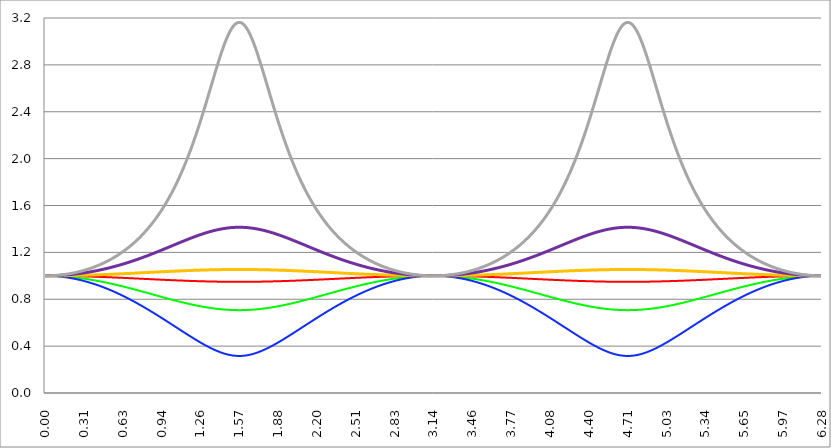
| Category | Series 1 | Series 0 | Series 2 | Series 3 | Series 4 | Series 5 |
|---|---|---|---|---|---|---|
| 0.0 | 1 | 1 | 1 | 1 | 1 | 1 |
| 0.00314159265358979 | 1 | 1 | 1 | 1 | 1 | 1 |
| 0.00628318530717958 | 1 | 1 | 1 | 1 | 1 | 1 |
| 0.00942477796076938 | 1 | 1 | 1 | 1 | 1 | 1 |
| 0.0125663706143592 | 1 | 1 | 1 | 1 | 1 | 1 |
| 0.015707963267949 | 1 | 1 | 1 | 1 | 1 | 1 |
| 0.0188495559215388 | 1 | 1 | 1 | 1 | 1 | 1 |
| 0.0219911485751285 | 1 | 1 | 1 | 1 | 1 | 1 |
| 0.0251327412287183 | 1 | 1 | 1 | 1 | 1 | 1 |
| 0.0282743338823081 | 1 | 1 | 1 | 1 | 1 | 1 |
| 0.0314159265358979 | 1 | 1 | 1 | 1 | 1 | 1 |
| 0.0345575191894877 | 1 | 1 | 0.999 | 1 | 1 | 1.001 |
| 0.0376991118430775 | 1 | 1 | 0.999 | 1 | 1 | 1.001 |
| 0.0408407044966673 | 1 | 1 | 0.999 | 1 | 1 | 1.001 |
| 0.0439822971502571 | 1 | 1 | 0.999 | 1 | 1 | 1.001 |
| 0.0471238898038469 | 1 | 0.999 | 0.999 | 1 | 1.001 | 1.001 |
| 0.0502654824574367 | 1 | 0.999 | 0.999 | 1 | 1.001 | 1.001 |
| 0.0534070751110265 | 1 | 0.999 | 0.999 | 1 | 1.001 | 1.001 |
| 0.0565486677646163 | 1 | 0.999 | 0.999 | 1 | 1.001 | 1.001 |
| 0.059690260418206 | 1 | 0.999 | 0.998 | 1 | 1.001 | 1.002 |
| 0.0628318530717958 | 1 | 0.999 | 0.998 | 1 | 1.001 | 1.002 |
| 0.0659734457253856 | 1 | 0.999 | 0.998 | 1 | 1.001 | 1.002 |
| 0.0691150383789754 | 1 | 0.999 | 0.998 | 1 | 1.001 | 1.002 |
| 0.0722566310325652 | 1 | 0.999 | 0.998 | 1 | 1.001 | 1.002 |
| 0.075398223686155 | 1 | 0.999 | 0.997 | 1 | 1.001 | 1.003 |
| 0.0785398163397448 | 1 | 0.998 | 0.997 | 1 | 1.002 | 1.003 |
| 0.0816814089933346 | 1 | 0.998 | 0.997 | 1 | 1.002 | 1.003 |
| 0.0848230016469244 | 1 | 0.998 | 0.997 | 1 | 1.002 | 1.003 |
| 0.0879645943005142 | 1 | 0.998 | 0.997 | 1 | 1.002 | 1.003 |
| 0.091106186954104 | 1 | 0.998 | 0.996 | 1 | 1.002 | 1.004 |
| 0.0942477796076937 | 1 | 0.998 | 0.996 | 1 | 1.002 | 1.004 |
| 0.0973893722612835 | 1 | 0.998 | 0.996 | 1 | 1.002 | 1.004 |
| 0.100530964914873 | 0.999 | 0.997 | 0.995 | 1.001 | 1.003 | 1.005 |
| 0.103672557568463 | 0.999 | 0.997 | 0.995 | 1.001 | 1.003 | 1.005 |
| 0.106814150222053 | 0.999 | 0.997 | 0.995 | 1.001 | 1.003 | 1.005 |
| 0.109955742875643 | 0.999 | 0.997 | 0.995 | 1.001 | 1.003 | 1.005 |
| 0.113097335529233 | 0.999 | 0.997 | 0.994 | 1.001 | 1.003 | 1.006 |
| 0.116238928182822 | 0.999 | 0.997 | 0.994 | 1.001 | 1.003 | 1.006 |
| 0.119380520836412 | 0.999 | 0.996 | 0.994 | 1.001 | 1.004 | 1.006 |
| 0.122522113490002 | 0.999 | 0.996 | 0.993 | 1.001 | 1.004 | 1.007 |
| 0.125663706143592 | 0.999 | 0.996 | 0.993 | 1.001 | 1.004 | 1.007 |
| 0.128805298797181 | 0.999 | 0.996 | 0.993 | 1.001 | 1.004 | 1.008 |
| 0.131946891450771 | 0.999 | 0.996 | 0.992 | 1.001 | 1.004 | 1.008 |
| 0.135088484104361 | 0.999 | 0.995 | 0.992 | 1.001 | 1.005 | 1.008 |
| 0.138230076757951 | 0.999 | 0.995 | 0.991 | 1.001 | 1.005 | 1.009 |
| 0.141371669411541 | 0.999 | 0.995 | 0.991 | 1.001 | 1.005 | 1.009 |
| 0.14451326206513 | 0.999 | 0.995 | 0.991 | 1.001 | 1.005 | 1.009 |
| 0.14765485471872 | 0.999 | 0.995 | 0.99 | 1.001 | 1.005 | 1.01 |
| 0.15079644737231 | 0.999 | 0.994 | 0.99 | 1.001 | 1.006 | 1.01 |
| 0.1539380400259 | 0.999 | 0.994 | 0.989 | 1.001 | 1.006 | 1.011 |
| 0.15707963267949 | 0.999 | 0.994 | 0.989 | 1.001 | 1.006 | 1.011 |
| 0.160221225333079 | 0.999 | 0.994 | 0.988 | 1.001 | 1.006 | 1.012 |
| 0.163362817986669 | 0.999 | 0.993 | 0.988 | 1.001 | 1.007 | 1.012 |
| 0.166504410640259 | 0.999 | 0.993 | 0.988 | 1.001 | 1.007 | 1.013 |
| 0.169646003293849 | 0.999 | 0.993 | 0.987 | 1.001 | 1.007 | 1.013 |
| 0.172787595947439 | 0.999 | 0.993 | 0.987 | 1.001 | 1.007 | 1.014 |
| 0.175929188601028 | 0.998 | 0.992 | 0.986 | 1.002 | 1.008 | 1.014 |
| 0.179070781254618 | 0.998 | 0.992 | 0.986 | 1.002 | 1.008 | 1.015 |
| 0.182212373908208 | 0.998 | 0.992 | 0.985 | 1.002 | 1.008 | 1.015 |
| 0.185353966561798 | 0.998 | 0.991 | 0.985 | 1.002 | 1.009 | 1.016 |
| 0.188495559215388 | 0.998 | 0.991 | 0.984 | 1.002 | 1.009 | 1.016 |
| 0.191637151868977 | 0.998 | 0.991 | 0.984 | 1.002 | 1.009 | 1.017 |
| 0.194778744522567 | 0.998 | 0.991 | 0.983 | 1.002 | 1.009 | 1.017 |
| 0.197920337176157 | 0.998 | 0.99 | 0.982 | 1.002 | 1.01 | 1.018 |
| 0.201061929829747 | 0.998 | 0.99 | 0.982 | 1.002 | 1.01 | 1.018 |
| 0.204203522483336 | 0.998 | 0.99 | 0.981 | 1.002 | 1.01 | 1.019 |
| 0.207345115136926 | 0.998 | 0.989 | 0.981 | 1.002 | 1.011 | 1.02 |
| 0.210486707790516 | 0.998 | 0.989 | 0.98 | 1.002 | 1.011 | 1.02 |
| 0.213628300444106 | 0.998 | 0.989 | 0.98 | 1.002 | 1.011 | 1.021 |
| 0.216769893097696 | 0.998 | 0.988 | 0.979 | 1.002 | 1.012 | 1.021 |
| 0.219911485751285 | 0.998 | 0.988 | 0.978 | 1.002 | 1.012 | 1.022 |
| 0.223053078404875 | 0.998 | 0.988 | 0.978 | 1.002 | 1.012 | 1.023 |
| 0.226194671058465 | 0.997 | 0.987 | 0.977 | 1.003 | 1.013 | 1.023 |
| 0.229336263712055 | 0.997 | 0.987 | 0.976 | 1.003 | 1.013 | 1.024 |
| 0.232477856365645 | 0.997 | 0.987 | 0.976 | 1.003 | 1.014 | 1.025 |
| 0.235619449019234 | 0.997 | 0.986 | 0.975 | 1.003 | 1.014 | 1.025 |
| 0.238761041672824 | 0.997 | 0.986 | 0.975 | 1.003 | 1.014 | 1.026 |
| 0.241902634326414 | 0.997 | 0.986 | 0.974 | 1.003 | 1.015 | 1.027 |
| 0.245044226980004 | 0.997 | 0.985 | 0.973 | 1.003 | 1.015 | 1.028 |
| 0.248185819633594 | 0.997 | 0.985 | 0.972 | 1.003 | 1.015 | 1.028 |
| 0.251327412287183 | 0.997 | 0.984 | 0.972 | 1.003 | 1.016 | 1.029 |
| 0.254469004940773 | 0.997 | 0.984 | 0.971 | 1.003 | 1.016 | 1.03 |
| 0.257610597594363 | 0.997 | 0.984 | 0.97 | 1.003 | 1.017 | 1.031 |
| 0.260752190247953 | 0.997 | 0.983 | 0.97 | 1.003 | 1.017 | 1.031 |
| 0.263893782901543 | 0.997 | 0.983 | 0.969 | 1.003 | 1.017 | 1.032 |
| 0.267035375555132 | 0.997 | 0.982 | 0.968 | 1.003 | 1.018 | 1.033 |
| 0.270176968208722 | 0.996 | 0.982 | 0.967 | 1.004 | 1.018 | 1.034 |
| 0.273318560862312 | 0.996 | 0.982 | 0.967 | 1.004 | 1.019 | 1.034 |
| 0.276460153515902 | 0.996 | 0.981 | 0.966 | 1.004 | 1.019 | 1.035 |
| 0.279601746169492 | 0.996 | 0.981 | 0.965 | 1.004 | 1.02 | 1.036 |
| 0.282743338823082 | 0.996 | 0.98 | 0.964 | 1.004 | 1.02 | 1.037 |
| 0.285884931476671 | 0.996 | 0.98 | 0.964 | 1.004 | 1.02 | 1.038 |
| 0.289026524130261 | 0.996 | 0.979 | 0.963 | 1.004 | 1.021 | 1.039 |
| 0.292168116783851 | 0.996 | 0.979 | 0.962 | 1.004 | 1.021 | 1.04 |
| 0.295309709437441 | 0.996 | 0.979 | 0.961 | 1.004 | 1.022 | 1.04 |
| 0.298451302091031 | 0.996 | 0.978 | 0.96 | 1.004 | 1.022 | 1.041 |
| 0.30159289474462 | 0.996 | 0.978 | 0.959 | 1.004 | 1.023 | 1.042 |
| 0.30473448739821 | 0.995 | 0.977 | 0.959 | 1.005 | 1.023 | 1.043 |
| 0.3078760800518 | 0.995 | 0.977 | 0.958 | 1.005 | 1.024 | 1.044 |
| 0.31101767270539 | 0.995 | 0.976 | 0.957 | 1.005 | 1.024 | 1.045 |
| 0.31415926535898 | 0.995 | 0.976 | 0.956 | 1.005 | 1.025 | 1.046 |
| 0.31730085801257 | 0.995 | 0.975 | 0.955 | 1.005 | 1.025 | 1.047 |
| 0.320442450666159 | 0.995 | 0.975 | 0.954 | 1.005 | 1.026 | 1.048 |
| 0.323584043319749 | 0.995 | 0.974 | 0.953 | 1.005 | 1.026 | 1.049 |
| 0.326725635973339 | 0.995 | 0.974 | 0.953 | 1.005 | 1.027 | 1.05 |
| 0.329867228626929 | 0.995 | 0.973 | 0.952 | 1.005 | 1.027 | 1.051 |
| 0.333008821280519 | 0.995 | 0.973 | 0.951 | 1.005 | 1.028 | 1.052 |
| 0.336150413934108 | 0.995 | 0.972 | 0.95 | 1.005 | 1.028 | 1.053 |
| 0.339292006587698 | 0.994 | 0.972 | 0.949 | 1.006 | 1.029 | 1.054 |
| 0.342433599241288 | 0.994 | 0.971 | 0.948 | 1.006 | 1.029 | 1.055 |
| 0.345575191894878 | 0.994 | 0.971 | 0.947 | 1.006 | 1.03 | 1.056 |
| 0.348716784548468 | 0.994 | 0.97 | 0.946 | 1.006 | 1.031 | 1.057 |
| 0.351858377202058 | 0.994 | 0.97 | 0.945 | 1.006 | 1.031 | 1.058 |
| 0.354999969855647 | 0.994 | 0.969 | 0.944 | 1.006 | 1.032 | 1.059 |
| 0.358141562509237 | 0.994 | 0.969 | 0.943 | 1.006 | 1.032 | 1.06 |
| 0.361283155162827 | 0.994 | 0.968 | 0.942 | 1.006 | 1.033 | 1.061 |
| 0.364424747816417 | 0.994 | 0.968 | 0.941 | 1.006 | 1.033 | 1.063 |
| 0.367566340470007 | 0.994 | 0.967 | 0.94 | 1.007 | 1.034 | 1.064 |
| 0.370707933123597 | 0.993 | 0.967 | 0.939 | 1.007 | 1.035 | 1.065 |
| 0.373849525777186 | 0.993 | 0.966 | 0.938 | 1.007 | 1.035 | 1.066 |
| 0.376991118430776 | 0.993 | 0.966 | 0.937 | 1.007 | 1.036 | 1.067 |
| 0.380132711084366 | 0.993 | 0.965 | 0.936 | 1.007 | 1.036 | 1.068 |
| 0.383274303737956 | 0.993 | 0.964 | 0.935 | 1.007 | 1.037 | 1.07 |
| 0.386415896391546 | 0.993 | 0.964 | 0.934 | 1.007 | 1.038 | 1.071 |
| 0.389557489045135 | 0.993 | 0.963 | 0.933 | 1.007 | 1.038 | 1.072 |
| 0.392699081698725 | 0.993 | 0.963 | 0.932 | 1.007 | 1.039 | 1.073 |
| 0.395840674352315 | 0.993 | 0.962 | 0.931 | 1.008 | 1.039 | 1.074 |
| 0.398982267005905 | 0.992 | 0.962 | 0.93 | 1.008 | 1.04 | 1.076 |
| 0.402123859659495 | 0.992 | 0.961 | 0.929 | 1.008 | 1.041 | 1.077 |
| 0.405265452313085 | 0.992 | 0.96 | 0.927 | 1.008 | 1.041 | 1.078 |
| 0.408407044966674 | 0.992 | 0.96 | 0.926 | 1.008 | 1.042 | 1.08 |
| 0.411548637620264 | 0.992 | 0.959 | 0.925 | 1.008 | 1.043 | 1.081 |
| 0.414690230273854 | 0.992 | 0.959 | 0.924 | 1.008 | 1.043 | 1.082 |
| 0.417831822927444 | 0.992 | 0.958 | 0.923 | 1.008 | 1.044 | 1.084 |
| 0.420973415581034 | 0.992 | 0.957 | 0.922 | 1.008 | 1.045 | 1.085 |
| 0.424115008234623 | 0.991 | 0.957 | 0.921 | 1.009 | 1.045 | 1.086 |
| 0.427256600888213 | 0.991 | 0.956 | 0.919 | 1.009 | 1.046 | 1.088 |
| 0.430398193541803 | 0.991 | 0.955 | 0.918 | 1.009 | 1.047 | 1.089 |
| 0.433539786195393 | 0.991 | 0.955 | 0.917 | 1.009 | 1.047 | 1.09 |
| 0.436681378848983 | 0.991 | 0.954 | 0.916 | 1.009 | 1.048 | 1.092 |
| 0.439822971502573 | 0.991 | 0.954 | 0.915 | 1.009 | 1.049 | 1.093 |
| 0.442964564156162 | 0.991 | 0.953 | 0.914 | 1.009 | 1.049 | 1.095 |
| 0.446106156809752 | 0.991 | 0.952 | 0.912 | 1.009 | 1.05 | 1.096 |
| 0.449247749463342 | 0.991 | 0.952 | 0.911 | 1.01 | 1.051 | 1.097 |
| 0.452389342116932 | 0.99 | 0.951 | 0.91 | 1.01 | 1.051 | 1.099 |
| 0.455530934770522 | 0.99 | 0.95 | 0.909 | 1.01 | 1.052 | 1.1 |
| 0.458672527424111 | 0.99 | 0.95 | 0.908 | 1.01 | 1.053 | 1.102 |
| 0.461814120077701 | 0.99 | 0.949 | 0.906 | 1.01 | 1.054 | 1.103 |
| 0.464955712731291 | 0.99 | 0.948 | 0.905 | 1.01 | 1.054 | 1.105 |
| 0.468097305384881 | 0.99 | 0.948 | 0.904 | 1.01 | 1.055 | 1.106 |
| 0.471238898038471 | 0.99 | 0.947 | 0.902 | 1.01 | 1.056 | 1.108 |
| 0.474380490692061 | 0.99 | 0.946 | 0.901 | 1.011 | 1.057 | 1.11 |
| 0.47752208334565 | 0.989 | 0.946 | 0.9 | 1.011 | 1.057 | 1.111 |
| 0.48066367599924 | 0.989 | 0.945 | 0.899 | 1.011 | 1.058 | 1.113 |
| 0.48380526865283 | 0.989 | 0.944 | 0.897 | 1.011 | 1.059 | 1.114 |
| 0.48694686130642 | 0.989 | 0.944 | 0.896 | 1.011 | 1.06 | 1.116 |
| 0.49008845396001 | 0.989 | 0.943 | 0.895 | 1.011 | 1.06 | 1.118 |
| 0.493230046613599 | 0.989 | 0.942 | 0.893 | 1.011 | 1.061 | 1.119 |
| 0.496371639267189 | 0.989 | 0.942 | 0.892 | 1.012 | 1.062 | 1.121 |
| 0.499513231920779 | 0.988 | 0.941 | 0.891 | 1.012 | 1.063 | 1.123 |
| 0.502654824574369 | 0.988 | 0.94 | 0.889 | 1.012 | 1.064 | 1.124 |
| 0.505796417227959 | 0.988 | 0.939 | 0.888 | 1.012 | 1.064 | 1.126 |
| 0.508938009881549 | 0.988 | 0.939 | 0.887 | 1.012 | 1.065 | 1.128 |
| 0.512079602535138 | 0.988 | 0.938 | 0.885 | 1.012 | 1.066 | 1.129 |
| 0.515221195188728 | 0.988 | 0.937 | 0.884 | 1.012 | 1.067 | 1.131 |
| 0.518362787842318 | 0.988 | 0.937 | 0.883 | 1.013 | 1.068 | 1.133 |
| 0.521504380495908 | 0.988 | 0.936 | 0.881 | 1.013 | 1.068 | 1.135 |
| 0.524645973149498 | 0.987 | 0.935 | 0.88 | 1.013 | 1.069 | 1.137 |
| 0.527787565803087 | 0.987 | 0.934 | 0.878 | 1.013 | 1.07 | 1.138 |
| 0.530929158456677 | 0.987 | 0.934 | 0.877 | 1.013 | 1.071 | 1.14 |
| 0.534070751110267 | 0.987 | 0.933 | 0.876 | 1.013 | 1.072 | 1.142 |
| 0.537212343763857 | 0.987 | 0.932 | 0.874 | 1.013 | 1.073 | 1.144 |
| 0.540353936417447 | 0.987 | 0.931 | 0.873 | 1.014 | 1.074 | 1.146 |
| 0.543495529071037 | 0.987 | 0.931 | 0.871 | 1.014 | 1.074 | 1.148 |
| 0.546637121724626 | 0.986 | 0.93 | 0.87 | 1.014 | 1.075 | 1.149 |
| 0.549778714378216 | 0.986 | 0.929 | 0.869 | 1.014 | 1.076 | 1.151 |
| 0.552920307031806 | 0.986 | 0.928 | 0.867 | 1.014 | 1.077 | 1.153 |
| 0.556061899685396 | 0.986 | 0.928 | 0.866 | 1.014 | 1.078 | 1.155 |
| 0.559203492338986 | 0.986 | 0.927 | 0.864 | 1.014 | 1.079 | 1.157 |
| 0.562345084992576 | 0.986 | 0.926 | 0.863 | 1.015 | 1.08 | 1.159 |
| 0.565486677646165 | 0.986 | 0.925 | 0.861 | 1.015 | 1.081 | 1.161 |
| 0.568628270299755 | 0.985 | 0.925 | 0.86 | 1.015 | 1.081 | 1.163 |
| 0.571769862953345 | 0.985 | 0.924 | 0.858 | 1.015 | 1.082 | 1.165 |
| 0.574911455606935 | 0.985 | 0.923 | 0.857 | 1.015 | 1.083 | 1.167 |
| 0.578053048260525 | 0.985 | 0.922 | 0.855 | 1.015 | 1.084 | 1.169 |
| 0.581194640914114 | 0.985 | 0.922 | 0.854 | 1.015 | 1.085 | 1.171 |
| 0.584336233567704 | 0.985 | 0.921 | 0.852 | 1.016 | 1.086 | 1.174 |
| 0.587477826221294 | 0.985 | 0.92 | 0.851 | 1.016 | 1.087 | 1.176 |
| 0.590619418874884 | 0.984 | 0.919 | 0.849 | 1.016 | 1.088 | 1.178 |
| 0.593761011528474 | 0.984 | 0.918 | 0.848 | 1.016 | 1.089 | 1.18 |
| 0.596902604182064 | 0.984 | 0.918 | 0.846 | 1.016 | 1.09 | 1.182 |
| 0.600044196835653 | 0.984 | 0.917 | 0.844 | 1.016 | 1.091 | 1.184 |
| 0.603185789489243 | 0.984 | 0.916 | 0.843 | 1.016 | 1.092 | 1.186 |
| 0.606327382142833 | 0.984 | 0.915 | 0.841 | 1.017 | 1.093 | 1.189 |
| 0.609468974796423 | 0.983 | 0.914 | 0.84 | 1.017 | 1.094 | 1.191 |
| 0.612610567450013 | 0.983 | 0.914 | 0.838 | 1.017 | 1.095 | 1.193 |
| 0.615752160103602 | 0.983 | 0.913 | 0.837 | 1.017 | 1.096 | 1.195 |
| 0.618893752757192 | 0.983 | 0.912 | 0.835 | 1.017 | 1.097 | 1.198 |
| 0.622035345410782 | 0.983 | 0.911 | 0.833 | 1.017 | 1.097 | 1.2 |
| 0.625176938064372 | 0.983 | 0.91 | 0.832 | 1.018 | 1.098 | 1.202 |
| 0.628318530717962 | 0.983 | 0.91 | 0.83 | 1.018 | 1.099 | 1.205 |
| 0.631460123371551 | 0.982 | 0.909 | 0.828 | 1.018 | 1.1 | 1.207 |
| 0.634601716025141 | 0.982 | 0.908 | 0.827 | 1.018 | 1.101 | 1.209 |
| 0.637743308678731 | 0.982 | 0.907 | 0.825 | 1.018 | 1.102 | 1.212 |
| 0.640884901332321 | 0.982 | 0.906 | 0.824 | 1.018 | 1.103 | 1.214 |
| 0.644026493985911 | 0.982 | 0.905 | 0.822 | 1.019 | 1.104 | 1.217 |
| 0.647168086639501 | 0.982 | 0.905 | 0.82 | 1.019 | 1.106 | 1.219 |
| 0.65030967929309 | 0.982 | 0.904 | 0.819 | 1.019 | 1.107 | 1.222 |
| 0.65345127194668 | 0.981 | 0.903 | 0.817 | 1.019 | 1.108 | 1.224 |
| 0.65659286460027 | 0.981 | 0.902 | 0.815 | 1.019 | 1.109 | 1.227 |
| 0.65973445725386 | 0.981 | 0.901 | 0.814 | 1.019 | 1.11 | 1.229 |
| 0.66287604990745 | 0.981 | 0.9 | 0.812 | 1.019 | 1.111 | 1.232 |
| 0.666017642561039 | 0.981 | 0.9 | 0.81 | 1.02 | 1.112 | 1.234 |
| 0.669159235214629 | 0.981 | 0.899 | 0.809 | 1.02 | 1.113 | 1.237 |
| 0.672300827868219 | 0.98 | 0.898 | 0.807 | 1.02 | 1.114 | 1.239 |
| 0.675442420521809 | 0.98 | 0.897 | 0.805 | 1.02 | 1.115 | 1.242 |
| 0.678584013175399 | 0.98 | 0.896 | 0.803 | 1.02 | 1.116 | 1.245 |
| 0.681725605828989 | 0.98 | 0.895 | 0.802 | 1.02 | 1.117 | 1.247 |
| 0.684867198482578 | 0.98 | 0.894 | 0.8 | 1.021 | 1.118 | 1.25 |
| 0.688008791136168 | 0.98 | 0.894 | 0.798 | 1.021 | 1.119 | 1.253 |
| 0.691150383789758 | 0.979 | 0.893 | 0.796 | 1.021 | 1.12 | 1.256 |
| 0.694291976443348 | 0.979 | 0.892 | 0.795 | 1.021 | 1.121 | 1.258 |
| 0.697433569096938 | 0.979 | 0.891 | 0.793 | 1.021 | 1.122 | 1.261 |
| 0.700575161750528 | 0.979 | 0.89 | 0.791 | 1.021 | 1.124 | 1.264 |
| 0.703716754404117 | 0.979 | 0.889 | 0.789 | 1.022 | 1.125 | 1.267 |
| 0.706858347057707 | 0.979 | 0.888 | 0.788 | 1.022 | 1.126 | 1.27 |
| 0.709999939711297 | 0.979 | 0.887 | 0.786 | 1.022 | 1.127 | 1.272 |
| 0.713141532364887 | 0.978 | 0.887 | 0.784 | 1.022 | 1.128 | 1.275 |
| 0.716283125018477 | 0.978 | 0.886 | 0.782 | 1.022 | 1.129 | 1.278 |
| 0.719424717672066 | 0.978 | 0.885 | 0.781 | 1.022 | 1.13 | 1.281 |
| 0.722566310325656 | 0.978 | 0.884 | 0.779 | 1.023 | 1.131 | 1.284 |
| 0.725707902979246 | 0.978 | 0.883 | 0.777 | 1.023 | 1.132 | 1.287 |
| 0.728849495632836 | 0.978 | 0.882 | 0.775 | 1.023 | 1.134 | 1.29 |
| 0.731991088286426 | 0.977 | 0.881 | 0.773 | 1.023 | 1.135 | 1.293 |
| 0.735132680940016 | 0.977 | 0.88 | 0.771 | 1.023 | 1.136 | 1.296 |
| 0.738274273593605 | 0.977 | 0.88 | 0.77 | 1.023 | 1.137 | 1.299 |
| 0.741415866247195 | 0.977 | 0.879 | 0.768 | 1.024 | 1.138 | 1.302 |
| 0.744557458900785 | 0.977 | 0.878 | 0.766 | 1.024 | 1.139 | 1.306 |
| 0.747699051554375 | 0.977 | 0.877 | 0.764 | 1.024 | 1.14 | 1.309 |
| 0.750840644207965 | 0.976 | 0.876 | 0.762 | 1.024 | 1.142 | 1.312 |
| 0.753982236861554 | 0.976 | 0.875 | 0.76 | 1.024 | 1.143 | 1.315 |
| 0.757123829515144 | 0.976 | 0.874 | 0.759 | 1.024 | 1.144 | 1.318 |
| 0.760265422168734 | 0.976 | 0.873 | 0.757 | 1.025 | 1.145 | 1.322 |
| 0.763407014822324 | 0.976 | 0.872 | 0.755 | 1.025 | 1.146 | 1.325 |
| 0.766548607475914 | 0.976 | 0.871 | 0.753 | 1.025 | 1.148 | 1.328 |
| 0.769690200129504 | 0.975 | 0.871 | 0.751 | 1.025 | 1.149 | 1.331 |
| 0.772831792783093 | 0.975 | 0.87 | 0.749 | 1.025 | 1.15 | 1.335 |
| 0.775973385436683 | 0.975 | 0.869 | 0.747 | 1.025 | 1.151 | 1.338 |
| 0.779114978090273 | 0.975 | 0.868 | 0.745 | 1.026 | 1.152 | 1.342 |
| 0.782256570743863 | 0.975 | 0.867 | 0.744 | 1.026 | 1.153 | 1.345 |
| 0.785398163397453 | 0.975 | 0.866 | 0.742 | 1.026 | 1.155 | 1.348 |
| 0.788539756051042 | 0.975 | 0.865 | 0.74 | 1.026 | 1.156 | 1.352 |
| 0.791681348704632 | 0.974 | 0.864 | 0.738 | 1.026 | 1.157 | 1.355 |
| 0.794822941358222 | 0.974 | 0.863 | 0.736 | 1.026 | 1.158 | 1.359 |
| 0.797964534011812 | 0.974 | 0.862 | 0.734 | 1.027 | 1.16 | 1.362 |
| 0.801106126665402 | 0.974 | 0.861 | 0.732 | 1.027 | 1.161 | 1.366 |
| 0.804247719318992 | 0.974 | 0.861 | 0.73 | 1.027 | 1.162 | 1.37 |
| 0.807389311972581 | 0.974 | 0.86 | 0.728 | 1.027 | 1.163 | 1.373 |
| 0.810530904626171 | 0.973 | 0.859 | 0.726 | 1.027 | 1.164 | 1.377 |
| 0.813672497279761 | 0.973 | 0.858 | 0.724 | 1.028 | 1.166 | 1.381 |
| 0.816814089933351 | 0.973 | 0.857 | 0.722 | 1.028 | 1.167 | 1.384 |
| 0.819955682586941 | 0.973 | 0.856 | 0.72 | 1.028 | 1.168 | 1.388 |
| 0.823097275240531 | 0.973 | 0.855 | 0.718 | 1.028 | 1.169 | 1.392 |
| 0.82623886789412 | 0.973 | 0.854 | 0.716 | 1.028 | 1.171 | 1.396 |
| 0.82938046054771 | 0.972 | 0.853 | 0.714 | 1.028 | 1.172 | 1.4 |
| 0.8325220532013 | 0.972 | 0.852 | 0.712 | 1.029 | 1.173 | 1.404 |
| 0.83566364585489 | 0.972 | 0.851 | 0.711 | 1.029 | 1.175 | 1.407 |
| 0.83880523850848 | 0.972 | 0.85 | 0.709 | 1.029 | 1.176 | 1.411 |
| 0.841946831162069 | 0.972 | 0.85 | 0.707 | 1.029 | 1.177 | 1.415 |
| 0.845088423815659 | 0.972 | 0.849 | 0.705 | 1.029 | 1.178 | 1.419 |
| 0.848230016469249 | 0.971 | 0.848 | 0.703 | 1.029 | 1.18 | 1.423 |
| 0.851371609122839 | 0.971 | 0.847 | 0.701 | 1.03 | 1.181 | 1.427 |
| 0.854513201776429 | 0.971 | 0.846 | 0.699 | 1.03 | 1.182 | 1.432 |
| 0.857654794430019 | 0.971 | 0.845 | 0.697 | 1.03 | 1.183 | 1.436 |
| 0.860796387083608 | 0.971 | 0.844 | 0.695 | 1.03 | 1.185 | 1.44 |
| 0.863937979737198 | 0.971 | 0.843 | 0.693 | 1.03 | 1.186 | 1.444 |
| 0.867079572390788 | 0.97 | 0.842 | 0.691 | 1.03 | 1.187 | 1.448 |
| 0.870221165044378 | 0.97 | 0.841 | 0.688 | 1.031 | 1.189 | 1.452 |
| 0.873362757697968 | 0.97 | 0.84 | 0.686 | 1.031 | 1.19 | 1.457 |
| 0.876504350351557 | 0.97 | 0.839 | 0.684 | 1.031 | 1.191 | 1.461 |
| 0.879645943005147 | 0.97 | 0.839 | 0.682 | 1.031 | 1.193 | 1.465 |
| 0.882787535658737 | 0.97 | 0.838 | 0.68 | 1.031 | 1.194 | 1.47 |
| 0.885929128312327 | 0.97 | 0.837 | 0.678 | 1.031 | 1.195 | 1.474 |
| 0.889070720965917 | 0.969 | 0.836 | 0.676 | 1.032 | 1.196 | 1.479 |
| 0.892212313619507 | 0.969 | 0.835 | 0.674 | 1.032 | 1.198 | 1.483 |
| 0.895353906273096 | 0.969 | 0.834 | 0.672 | 1.032 | 1.199 | 1.488 |
| 0.898495498926686 | 0.969 | 0.833 | 0.67 | 1.032 | 1.2 | 1.492 |
| 0.901637091580276 | 0.969 | 0.832 | 0.668 | 1.032 | 1.202 | 1.497 |
| 0.904778684233866 | 0.969 | 0.831 | 0.666 | 1.032 | 1.203 | 1.501 |
| 0.907920276887456 | 0.968 | 0.83 | 0.664 | 1.033 | 1.204 | 1.506 |
| 0.911061869541045 | 0.968 | 0.829 | 0.662 | 1.033 | 1.206 | 1.511 |
| 0.914203462194635 | 0.968 | 0.828 | 0.66 | 1.033 | 1.207 | 1.516 |
| 0.917345054848225 | 0.968 | 0.828 | 0.658 | 1.033 | 1.208 | 1.52 |
| 0.920486647501815 | 0.968 | 0.827 | 0.656 | 1.033 | 1.21 | 1.525 |
| 0.923628240155405 | 0.968 | 0.826 | 0.654 | 1.033 | 1.211 | 1.53 |
| 0.926769832808995 | 0.967 | 0.825 | 0.652 | 1.034 | 1.212 | 1.535 |
| 0.929911425462584 | 0.967 | 0.824 | 0.649 | 1.034 | 1.214 | 1.54 |
| 0.933053018116174 | 0.967 | 0.823 | 0.647 | 1.034 | 1.215 | 1.545 |
| 0.936194610769764 | 0.967 | 0.822 | 0.645 | 1.034 | 1.216 | 1.55 |
| 0.939336203423354 | 0.967 | 0.821 | 0.643 | 1.034 | 1.218 | 1.555 |
| 0.942477796076944 | 0.967 | 0.82 | 0.641 | 1.034 | 1.219 | 1.56 |
| 0.945619388730533 | 0.967 | 0.819 | 0.639 | 1.035 | 1.221 | 1.565 |
| 0.948760981384123 | 0.966 | 0.818 | 0.637 | 1.035 | 1.222 | 1.57 |
| 0.951902574037713 | 0.966 | 0.817 | 0.635 | 1.035 | 1.223 | 1.575 |
| 0.955044166691303 | 0.966 | 0.817 | 0.633 | 1.035 | 1.225 | 1.581 |
| 0.958185759344893 | 0.966 | 0.816 | 0.631 | 1.035 | 1.226 | 1.586 |
| 0.961327351998483 | 0.966 | 0.815 | 0.628 | 1.035 | 1.227 | 1.591 |
| 0.964468944652072 | 0.966 | 0.814 | 0.626 | 1.036 | 1.229 | 1.597 |
| 0.967610537305662 | 0.965 | 0.813 | 0.624 | 1.036 | 1.23 | 1.602 |
| 0.970752129959252 | 0.965 | 0.812 | 0.622 | 1.036 | 1.231 | 1.608 |
| 0.973893722612842 | 0.965 | 0.811 | 0.62 | 1.036 | 1.233 | 1.613 |
| 0.977035315266432 | 0.965 | 0.81 | 0.618 | 1.036 | 1.234 | 1.619 |
| 0.980176907920022 | 0.965 | 0.809 | 0.616 | 1.036 | 1.236 | 1.624 |
| 0.983318500573611 | 0.965 | 0.808 | 0.614 | 1.037 | 1.237 | 1.63 |
| 0.986460093227201 | 0.965 | 0.808 | 0.611 | 1.037 | 1.238 | 1.635 |
| 0.989601685880791 | 0.964 | 0.807 | 0.609 | 1.037 | 1.24 | 1.641 |
| 0.992743278534381 | 0.964 | 0.806 | 0.607 | 1.037 | 1.241 | 1.647 |
| 0.995884871187971 | 0.964 | 0.805 | 0.605 | 1.037 | 1.242 | 1.653 |
| 0.99902646384156 | 0.964 | 0.804 | 0.603 | 1.037 | 1.244 | 1.659 |
| 1.00216805649515 | 0.964 | 0.803 | 0.601 | 1.038 | 1.245 | 1.664 |
| 1.00530964914874 | 0.964 | 0.802 | 0.599 | 1.038 | 1.247 | 1.67 |
| 1.00845124180233 | 0.964 | 0.801 | 0.597 | 1.038 | 1.248 | 1.676 |
| 1.01159283445592 | 0.963 | 0.8 | 0.594 | 1.038 | 1.249 | 1.682 |
| 1.01473442710951 | 0.963 | 0.8 | 0.592 | 1.038 | 1.251 | 1.688 |
| 1.017876019763099 | 0.963 | 0.799 | 0.59 | 1.038 | 1.252 | 1.695 |
| 1.021017612416689 | 0.963 | 0.798 | 0.588 | 1.038 | 1.253 | 1.701 |
| 1.02415920507028 | 0.963 | 0.797 | 0.586 | 1.039 | 1.255 | 1.707 |
| 1.027300797723869 | 0.963 | 0.796 | 0.584 | 1.039 | 1.256 | 1.713 |
| 1.030442390377459 | 0.963 | 0.795 | 0.582 | 1.039 | 1.258 | 1.72 |
| 1.033583983031048 | 0.962 | 0.794 | 0.579 | 1.039 | 1.259 | 1.726 |
| 1.036725575684638 | 0.962 | 0.793 | 0.577 | 1.039 | 1.26 | 1.732 |
| 1.039867168338228 | 0.962 | 0.793 | 0.575 | 1.039 | 1.262 | 1.739 |
| 1.043008760991818 | 0.962 | 0.792 | 0.573 | 1.04 | 1.263 | 1.745 |
| 1.046150353645408 | 0.962 | 0.791 | 0.571 | 1.04 | 1.264 | 1.752 |
| 1.049291946298998 | 0.962 | 0.79 | 0.569 | 1.04 | 1.266 | 1.759 |
| 1.052433538952587 | 0.962 | 0.789 | 0.567 | 1.04 | 1.267 | 1.765 |
| 1.055575131606177 | 0.961 | 0.788 | 0.564 | 1.04 | 1.269 | 1.772 |
| 1.058716724259767 | 0.961 | 0.787 | 0.562 | 1.04 | 1.27 | 1.779 |
| 1.061858316913357 | 0.961 | 0.787 | 0.56 | 1.04 | 1.271 | 1.786 |
| 1.064999909566947 | 0.961 | 0.786 | 0.558 | 1.041 | 1.273 | 1.792 |
| 1.068141502220536 | 0.961 | 0.785 | 0.556 | 1.041 | 1.274 | 1.799 |
| 1.071283094874126 | 0.961 | 0.784 | 0.554 | 1.041 | 1.275 | 1.806 |
| 1.074424687527716 | 0.961 | 0.783 | 0.551 | 1.041 | 1.277 | 1.813 |
| 1.077566280181306 | 0.96 | 0.782 | 0.549 | 1.041 | 1.278 | 1.82 |
| 1.080707872834896 | 0.96 | 0.782 | 0.547 | 1.041 | 1.28 | 1.828 |
| 1.083849465488486 | 0.96 | 0.781 | 0.545 | 1.041 | 1.281 | 1.835 |
| 1.086991058142075 | 0.96 | 0.78 | 0.543 | 1.042 | 1.282 | 1.842 |
| 1.090132650795665 | 0.96 | 0.779 | 0.541 | 1.042 | 1.284 | 1.849 |
| 1.093274243449255 | 0.96 | 0.778 | 0.539 | 1.042 | 1.285 | 1.857 |
| 1.096415836102845 | 0.96 | 0.777 | 0.536 | 1.042 | 1.286 | 1.864 |
| 1.099557428756435 | 0.959 | 0.777 | 0.534 | 1.042 | 1.288 | 1.872 |
| 1.102699021410025 | 0.959 | 0.776 | 0.532 | 1.042 | 1.289 | 1.879 |
| 1.105840614063614 | 0.959 | 0.775 | 0.53 | 1.043 | 1.29 | 1.887 |
| 1.108982206717204 | 0.959 | 0.774 | 0.528 | 1.043 | 1.292 | 1.894 |
| 1.112123799370794 | 0.959 | 0.773 | 0.526 | 1.043 | 1.293 | 1.902 |
| 1.115265392024384 | 0.959 | 0.773 | 0.524 | 1.043 | 1.294 | 1.91 |
| 1.118406984677974 | 0.959 | 0.772 | 0.522 | 1.043 | 1.296 | 1.918 |
| 1.121548577331563 | 0.959 | 0.771 | 0.519 | 1.043 | 1.297 | 1.925 |
| 1.124690169985153 | 0.958 | 0.77 | 0.517 | 1.043 | 1.299 | 1.933 |
| 1.127831762638743 | 0.958 | 0.769 | 0.515 | 1.043 | 1.3 | 1.941 |
| 1.130973355292333 | 0.958 | 0.769 | 0.513 | 1.044 | 1.301 | 1.949 |
| 1.134114947945923 | 0.958 | 0.768 | 0.511 | 1.044 | 1.303 | 1.957 |
| 1.137256540599513 | 0.958 | 0.767 | 0.509 | 1.044 | 1.304 | 1.966 |
| 1.140398133253102 | 0.958 | 0.766 | 0.507 | 1.044 | 1.305 | 1.974 |
| 1.143539725906692 | 0.958 | 0.765 | 0.505 | 1.044 | 1.306 | 1.982 |
| 1.146681318560282 | 0.958 | 0.765 | 0.502 | 1.044 | 1.308 | 1.99 |
| 1.149822911213872 | 0.957 | 0.764 | 0.5 | 1.044 | 1.309 | 1.999 |
| 1.152964503867462 | 0.957 | 0.763 | 0.498 | 1.045 | 1.31 | 2.007 |
| 1.156106096521051 | 0.957 | 0.762 | 0.496 | 1.045 | 1.312 | 2.016 |
| 1.159247689174641 | 0.957 | 0.762 | 0.494 | 1.045 | 1.313 | 2.024 |
| 1.162389281828231 | 0.957 | 0.761 | 0.492 | 1.045 | 1.314 | 2.033 |
| 1.165530874481821 | 0.957 | 0.76 | 0.49 | 1.045 | 1.316 | 2.042 |
| 1.168672467135411 | 0.957 | 0.759 | 0.488 | 1.045 | 1.317 | 2.05 |
| 1.171814059789001 | 0.957 | 0.759 | 0.486 | 1.045 | 1.318 | 2.059 |
| 1.17495565244259 | 0.956 | 0.758 | 0.484 | 1.045 | 1.32 | 2.068 |
| 1.17809724509618 | 0.956 | 0.757 | 0.481 | 1.046 | 1.321 | 2.077 |
| 1.18123883774977 | 0.956 | 0.756 | 0.479 | 1.046 | 1.322 | 2.086 |
| 1.18438043040336 | 0.956 | 0.756 | 0.477 | 1.046 | 1.323 | 2.095 |
| 1.18752202305695 | 0.956 | 0.755 | 0.475 | 1.046 | 1.325 | 2.104 |
| 1.190663615710539 | 0.956 | 0.754 | 0.473 | 1.046 | 1.326 | 2.113 |
| 1.193805208364129 | 0.956 | 0.753 | 0.471 | 1.046 | 1.327 | 2.123 |
| 1.19694680101772 | 0.956 | 0.753 | 0.469 | 1.046 | 1.328 | 2.132 |
| 1.200088393671309 | 0.956 | 0.752 | 0.467 | 1.046 | 1.33 | 2.141 |
| 1.203229986324899 | 0.955 | 0.751 | 0.465 | 1.047 | 1.331 | 2.151 |
| 1.206371578978489 | 0.955 | 0.751 | 0.463 | 1.047 | 1.332 | 2.16 |
| 1.209513171632078 | 0.955 | 0.75 | 0.461 | 1.047 | 1.333 | 2.17 |
| 1.212654764285668 | 0.955 | 0.749 | 0.459 | 1.047 | 1.335 | 2.179 |
| 1.215796356939258 | 0.955 | 0.749 | 0.457 | 1.047 | 1.336 | 2.189 |
| 1.218937949592848 | 0.955 | 0.748 | 0.455 | 1.047 | 1.337 | 2.198 |
| 1.222079542246438 | 0.955 | 0.747 | 0.453 | 1.047 | 1.338 | 2.208 |
| 1.225221134900027 | 0.955 | 0.747 | 0.451 | 1.047 | 1.339 | 2.218 |
| 1.228362727553617 | 0.955 | 0.746 | 0.449 | 1.048 | 1.341 | 2.228 |
| 1.231504320207207 | 0.955 | 0.745 | 0.447 | 1.048 | 1.342 | 2.238 |
| 1.234645912860797 | 0.954 | 0.745 | 0.445 | 1.048 | 1.343 | 2.248 |
| 1.237787505514387 | 0.954 | 0.744 | 0.443 | 1.048 | 1.344 | 2.258 |
| 1.240929098167977 | 0.954 | 0.743 | 0.441 | 1.048 | 1.345 | 2.268 |
| 1.244070690821566 | 0.954 | 0.743 | 0.439 | 1.048 | 1.347 | 2.278 |
| 1.247212283475156 | 0.954 | 0.742 | 0.437 | 1.048 | 1.348 | 2.288 |
| 1.250353876128746 | 0.954 | 0.741 | 0.435 | 1.048 | 1.349 | 2.298 |
| 1.253495468782336 | 0.954 | 0.741 | 0.433 | 1.048 | 1.35 | 2.309 |
| 1.256637061435926 | 0.954 | 0.74 | 0.431 | 1.049 | 1.351 | 2.319 |
| 1.259778654089515 | 0.954 | 0.739 | 0.429 | 1.049 | 1.352 | 2.329 |
| 1.262920246743105 | 0.954 | 0.739 | 0.427 | 1.049 | 1.353 | 2.34 |
| 1.266061839396695 | 0.953 | 0.738 | 0.425 | 1.049 | 1.355 | 2.35 |
| 1.269203432050285 | 0.953 | 0.738 | 0.424 | 1.049 | 1.356 | 2.361 |
| 1.272345024703875 | 0.953 | 0.737 | 0.422 | 1.049 | 1.357 | 2.371 |
| 1.275486617357465 | 0.953 | 0.736 | 0.42 | 1.049 | 1.358 | 2.382 |
| 1.278628210011054 | 0.953 | 0.736 | 0.418 | 1.049 | 1.359 | 2.393 |
| 1.281769802664644 | 0.953 | 0.735 | 0.416 | 1.049 | 1.36 | 2.403 |
| 1.284911395318234 | 0.953 | 0.735 | 0.414 | 1.049 | 1.361 | 2.414 |
| 1.288052987971824 | 0.953 | 0.734 | 0.412 | 1.05 | 1.362 | 2.425 |
| 1.291194580625414 | 0.953 | 0.734 | 0.411 | 1.05 | 1.363 | 2.436 |
| 1.294336173279003 | 0.953 | 0.733 | 0.409 | 1.05 | 1.364 | 2.447 |
| 1.297477765932593 | 0.953 | 0.732 | 0.407 | 1.05 | 1.365 | 2.458 |
| 1.300619358586183 | 0.952 | 0.732 | 0.405 | 1.05 | 1.366 | 2.468 |
| 1.303760951239773 | 0.952 | 0.731 | 0.403 | 1.05 | 1.367 | 2.479 |
| 1.306902543893363 | 0.952 | 0.731 | 0.402 | 1.05 | 1.368 | 2.49 |
| 1.310044136546953 | 0.952 | 0.73 | 0.4 | 1.05 | 1.369 | 2.501 |
| 1.313185729200542 | 0.952 | 0.73 | 0.398 | 1.05 | 1.37 | 2.512 |
| 1.316327321854132 | 0.952 | 0.729 | 0.396 | 1.05 | 1.371 | 2.524 |
| 1.319468914507722 | 0.952 | 0.729 | 0.395 | 1.05 | 1.372 | 2.535 |
| 1.322610507161312 | 0.952 | 0.728 | 0.393 | 1.051 | 1.373 | 2.546 |
| 1.325752099814902 | 0.952 | 0.728 | 0.391 | 1.051 | 1.374 | 2.557 |
| 1.328893692468491 | 0.952 | 0.727 | 0.389 | 1.051 | 1.375 | 2.568 |
| 1.332035285122081 | 0.952 | 0.727 | 0.388 | 1.051 | 1.376 | 2.579 |
| 1.335176877775671 | 0.952 | 0.726 | 0.386 | 1.051 | 1.377 | 2.59 |
| 1.338318470429261 | 0.951 | 0.726 | 0.384 | 1.051 | 1.378 | 2.601 |
| 1.341460063082851 | 0.951 | 0.725 | 0.383 | 1.051 | 1.379 | 2.613 |
| 1.344601655736441 | 0.951 | 0.725 | 0.381 | 1.051 | 1.38 | 2.624 |
| 1.34774324839003 | 0.951 | 0.724 | 0.38 | 1.051 | 1.381 | 2.635 |
| 1.35088484104362 | 0.951 | 0.724 | 0.378 | 1.051 | 1.382 | 2.646 |
| 1.35402643369721 | 0.951 | 0.723 | 0.376 | 1.051 | 1.383 | 2.657 |
| 1.3571680263508 | 0.951 | 0.723 | 0.375 | 1.051 | 1.383 | 2.668 |
| 1.36030961900439 | 0.951 | 0.722 | 0.373 | 1.052 | 1.384 | 2.679 |
| 1.363451211657979 | 0.951 | 0.722 | 0.372 | 1.052 | 1.385 | 2.691 |
| 1.36659280431157 | 0.951 | 0.721 | 0.37 | 1.052 | 1.386 | 2.702 |
| 1.369734396965159 | 0.951 | 0.721 | 0.369 | 1.052 | 1.387 | 2.713 |
| 1.372875989618749 | 0.951 | 0.721 | 0.367 | 1.052 | 1.388 | 2.724 |
| 1.376017582272339 | 0.951 | 0.72 | 0.366 | 1.052 | 1.388 | 2.735 |
| 1.379159174925929 | 0.951 | 0.72 | 0.364 | 1.052 | 1.389 | 2.746 |
| 1.382300767579518 | 0.951 | 0.719 | 0.363 | 1.052 | 1.39 | 2.757 |
| 1.385442360233108 | 0.95 | 0.719 | 0.361 | 1.052 | 1.391 | 2.767 |
| 1.388583952886698 | 0.95 | 0.719 | 0.36 | 1.052 | 1.392 | 2.778 |
| 1.391725545540288 | 0.95 | 0.718 | 0.359 | 1.052 | 1.392 | 2.789 |
| 1.394867138193878 | 0.95 | 0.718 | 0.357 | 1.052 | 1.393 | 2.8 |
| 1.398008730847468 | 0.95 | 0.717 | 0.356 | 1.052 | 1.394 | 2.81 |
| 1.401150323501057 | 0.95 | 0.717 | 0.354 | 1.052 | 1.394 | 2.821 |
| 1.404291916154647 | 0.95 | 0.717 | 0.353 | 1.052 | 1.395 | 2.832 |
| 1.407433508808237 | 0.95 | 0.716 | 0.352 | 1.053 | 1.396 | 2.842 |
| 1.410575101461827 | 0.95 | 0.716 | 0.351 | 1.053 | 1.397 | 2.852 |
| 1.413716694115417 | 0.95 | 0.716 | 0.349 | 1.053 | 1.397 | 2.863 |
| 1.416858286769006 | 0.95 | 0.715 | 0.348 | 1.053 | 1.398 | 2.873 |
| 1.419999879422596 | 0.95 | 0.715 | 0.347 | 1.053 | 1.399 | 2.883 |
| 1.423141472076186 | 0.95 | 0.715 | 0.346 | 1.053 | 1.399 | 2.893 |
| 1.426283064729776 | 0.95 | 0.714 | 0.344 | 1.053 | 1.4 | 2.903 |
| 1.429424657383366 | 0.95 | 0.714 | 0.343 | 1.053 | 1.4 | 2.913 |
| 1.432566250036956 | 0.95 | 0.714 | 0.342 | 1.053 | 1.401 | 2.922 |
| 1.435707842690545 | 0.95 | 0.713 | 0.341 | 1.053 | 1.402 | 2.932 |
| 1.438849435344135 | 0.95 | 0.713 | 0.34 | 1.053 | 1.402 | 2.941 |
| 1.441991027997725 | 0.95 | 0.713 | 0.339 | 1.053 | 1.403 | 2.951 |
| 1.445132620651315 | 0.95 | 0.713 | 0.338 | 1.053 | 1.403 | 2.96 |
| 1.448274213304905 | 0.949 | 0.712 | 0.337 | 1.053 | 1.404 | 2.969 |
| 1.451415805958494 | 0.949 | 0.712 | 0.336 | 1.053 | 1.404 | 2.978 |
| 1.454557398612084 | 0.949 | 0.712 | 0.335 | 1.053 | 1.405 | 2.987 |
| 1.457698991265674 | 0.949 | 0.712 | 0.334 | 1.053 | 1.405 | 2.995 |
| 1.460840583919264 | 0.949 | 0.711 | 0.333 | 1.053 | 1.406 | 3.004 |
| 1.463982176572854 | 0.949 | 0.711 | 0.332 | 1.053 | 1.406 | 3.012 |
| 1.467123769226444 | 0.949 | 0.711 | 0.331 | 1.053 | 1.407 | 3.02 |
| 1.470265361880033 | 0.949 | 0.711 | 0.33 | 1.054 | 1.407 | 3.028 |
| 1.473406954533623 | 0.949 | 0.71 | 0.329 | 1.054 | 1.408 | 3.036 |
| 1.476548547187213 | 0.949 | 0.71 | 0.329 | 1.054 | 1.408 | 3.043 |
| 1.479690139840803 | 0.949 | 0.71 | 0.328 | 1.054 | 1.408 | 3.051 |
| 1.482831732494393 | 0.949 | 0.71 | 0.327 | 1.054 | 1.409 | 3.058 |
| 1.485973325147982 | 0.949 | 0.71 | 0.326 | 1.054 | 1.409 | 3.065 |
| 1.489114917801572 | 0.949 | 0.709 | 0.326 | 1.054 | 1.41 | 3.072 |
| 1.492256510455162 | 0.949 | 0.709 | 0.325 | 1.054 | 1.41 | 3.078 |
| 1.495398103108752 | 0.949 | 0.709 | 0.324 | 1.054 | 1.41 | 3.084 |
| 1.498539695762342 | 0.949 | 0.709 | 0.324 | 1.054 | 1.411 | 3.091 |
| 1.501681288415932 | 0.949 | 0.709 | 0.323 | 1.054 | 1.411 | 3.097 |
| 1.504822881069521 | 0.949 | 0.709 | 0.322 | 1.054 | 1.411 | 3.102 |
| 1.507964473723111 | 0.949 | 0.708 | 0.322 | 1.054 | 1.411 | 3.108 |
| 1.511106066376701 | 0.949 | 0.708 | 0.321 | 1.054 | 1.412 | 3.113 |
| 1.514247659030291 | 0.949 | 0.708 | 0.321 | 1.054 | 1.412 | 3.118 |
| 1.517389251683881 | 0.949 | 0.708 | 0.32 | 1.054 | 1.412 | 3.122 |
| 1.520530844337471 | 0.949 | 0.708 | 0.32 | 1.054 | 1.412 | 3.127 |
| 1.52367243699106 | 0.949 | 0.708 | 0.319 | 1.054 | 1.413 | 3.131 |
| 1.52681402964465 | 0.949 | 0.708 | 0.319 | 1.054 | 1.413 | 3.135 |
| 1.52995562229824 | 0.949 | 0.708 | 0.319 | 1.054 | 1.413 | 3.139 |
| 1.53309721495183 | 0.949 | 0.708 | 0.318 | 1.054 | 1.413 | 3.142 |
| 1.53623880760542 | 0.949 | 0.708 | 0.318 | 1.054 | 1.413 | 3.145 |
| 1.539380400259009 | 0.949 | 0.707 | 0.318 | 1.054 | 1.414 | 3.148 |
| 1.542521992912599 | 0.949 | 0.707 | 0.317 | 1.054 | 1.414 | 3.151 |
| 1.545663585566189 | 0.949 | 0.707 | 0.317 | 1.054 | 1.414 | 3.153 |
| 1.548805178219779 | 0.949 | 0.707 | 0.317 | 1.054 | 1.414 | 3.155 |
| 1.551946770873369 | 0.949 | 0.707 | 0.317 | 1.054 | 1.414 | 3.157 |
| 1.555088363526959 | 0.949 | 0.707 | 0.317 | 1.054 | 1.414 | 3.159 |
| 1.558229956180548 | 0.949 | 0.707 | 0.316 | 1.054 | 1.414 | 3.16 |
| 1.561371548834138 | 0.949 | 0.707 | 0.316 | 1.054 | 1.414 | 3.161 |
| 1.564513141487728 | 0.949 | 0.707 | 0.316 | 1.054 | 1.414 | 3.162 |
| 1.567654734141318 | 0.949 | 0.707 | 0.316 | 1.054 | 1.414 | 3.162 |
| 1.570796326794908 | 0.949 | 0.707 | 0.316 | 1.054 | 1.414 | 3.162 |
| 1.573937919448497 | 0.949 | 0.707 | 0.316 | 1.054 | 1.414 | 3.162 |
| 1.577079512102087 | 0.949 | 0.707 | 0.316 | 1.054 | 1.414 | 3.162 |
| 1.580221104755677 | 0.949 | 0.707 | 0.316 | 1.054 | 1.414 | 3.161 |
| 1.583362697409267 | 0.949 | 0.707 | 0.316 | 1.054 | 1.414 | 3.16 |
| 1.586504290062857 | 0.949 | 0.707 | 0.317 | 1.054 | 1.414 | 3.159 |
| 1.589645882716447 | 0.949 | 0.707 | 0.317 | 1.054 | 1.414 | 3.157 |
| 1.592787475370036 | 0.949 | 0.707 | 0.317 | 1.054 | 1.414 | 3.155 |
| 1.595929068023626 | 0.949 | 0.707 | 0.317 | 1.054 | 1.414 | 3.153 |
| 1.599070660677216 | 0.949 | 0.707 | 0.317 | 1.054 | 1.414 | 3.151 |
| 1.602212253330806 | 0.949 | 0.707 | 0.318 | 1.054 | 1.414 | 3.148 |
| 1.605353845984396 | 0.949 | 0.708 | 0.318 | 1.054 | 1.413 | 3.145 |
| 1.608495438637985 | 0.949 | 0.708 | 0.318 | 1.054 | 1.413 | 3.142 |
| 1.611637031291575 | 0.949 | 0.708 | 0.319 | 1.054 | 1.413 | 3.139 |
| 1.614778623945165 | 0.949 | 0.708 | 0.319 | 1.054 | 1.413 | 3.135 |
| 1.617920216598755 | 0.949 | 0.708 | 0.319 | 1.054 | 1.413 | 3.131 |
| 1.621061809252345 | 0.949 | 0.708 | 0.32 | 1.054 | 1.412 | 3.127 |
| 1.624203401905935 | 0.949 | 0.708 | 0.32 | 1.054 | 1.412 | 3.122 |
| 1.627344994559524 | 0.949 | 0.708 | 0.321 | 1.054 | 1.412 | 3.118 |
| 1.630486587213114 | 0.949 | 0.708 | 0.321 | 1.054 | 1.412 | 3.113 |
| 1.633628179866704 | 0.949 | 0.708 | 0.322 | 1.054 | 1.411 | 3.108 |
| 1.636769772520294 | 0.949 | 0.709 | 0.322 | 1.054 | 1.411 | 3.102 |
| 1.639911365173884 | 0.949 | 0.709 | 0.323 | 1.054 | 1.411 | 3.097 |
| 1.643052957827473 | 0.949 | 0.709 | 0.324 | 1.054 | 1.411 | 3.091 |
| 1.646194550481063 | 0.949 | 0.709 | 0.324 | 1.054 | 1.41 | 3.084 |
| 1.649336143134653 | 0.949 | 0.709 | 0.325 | 1.054 | 1.41 | 3.078 |
| 1.652477735788243 | 0.949 | 0.709 | 0.326 | 1.054 | 1.41 | 3.072 |
| 1.655619328441833 | 0.949 | 0.71 | 0.326 | 1.054 | 1.409 | 3.065 |
| 1.658760921095423 | 0.949 | 0.71 | 0.327 | 1.054 | 1.409 | 3.058 |
| 1.661902513749012 | 0.949 | 0.71 | 0.328 | 1.054 | 1.408 | 3.051 |
| 1.665044106402602 | 0.949 | 0.71 | 0.329 | 1.054 | 1.408 | 3.043 |
| 1.668185699056192 | 0.949 | 0.71 | 0.329 | 1.054 | 1.408 | 3.036 |
| 1.671327291709782 | 0.949 | 0.711 | 0.33 | 1.054 | 1.407 | 3.028 |
| 1.674468884363372 | 0.949 | 0.711 | 0.331 | 1.053 | 1.407 | 3.02 |
| 1.677610477016961 | 0.949 | 0.711 | 0.332 | 1.053 | 1.406 | 3.012 |
| 1.680752069670551 | 0.949 | 0.711 | 0.333 | 1.053 | 1.406 | 3.004 |
| 1.683893662324141 | 0.949 | 0.712 | 0.334 | 1.053 | 1.405 | 2.995 |
| 1.687035254977731 | 0.949 | 0.712 | 0.335 | 1.053 | 1.405 | 2.987 |
| 1.690176847631321 | 0.949 | 0.712 | 0.336 | 1.053 | 1.404 | 2.978 |
| 1.693318440284911 | 0.949 | 0.712 | 0.337 | 1.053 | 1.404 | 2.969 |
| 1.6964600329385 | 0.95 | 0.713 | 0.338 | 1.053 | 1.403 | 2.96 |
| 1.69960162559209 | 0.95 | 0.713 | 0.339 | 1.053 | 1.403 | 2.951 |
| 1.70274321824568 | 0.95 | 0.713 | 0.34 | 1.053 | 1.402 | 2.941 |
| 1.70588481089927 | 0.95 | 0.713 | 0.341 | 1.053 | 1.402 | 2.932 |
| 1.70902640355286 | 0.95 | 0.714 | 0.342 | 1.053 | 1.401 | 2.922 |
| 1.712167996206449 | 0.95 | 0.714 | 0.343 | 1.053 | 1.4 | 2.913 |
| 1.715309588860039 | 0.95 | 0.714 | 0.344 | 1.053 | 1.4 | 2.903 |
| 1.71845118151363 | 0.95 | 0.715 | 0.346 | 1.053 | 1.399 | 2.893 |
| 1.721592774167219 | 0.95 | 0.715 | 0.347 | 1.053 | 1.399 | 2.883 |
| 1.724734366820809 | 0.95 | 0.715 | 0.348 | 1.053 | 1.398 | 2.873 |
| 1.727875959474399 | 0.95 | 0.716 | 0.349 | 1.053 | 1.397 | 2.863 |
| 1.731017552127988 | 0.95 | 0.716 | 0.351 | 1.053 | 1.397 | 2.852 |
| 1.734159144781578 | 0.95 | 0.716 | 0.352 | 1.053 | 1.396 | 2.842 |
| 1.737300737435168 | 0.95 | 0.717 | 0.353 | 1.052 | 1.395 | 2.832 |
| 1.740442330088758 | 0.95 | 0.717 | 0.354 | 1.052 | 1.394 | 2.821 |
| 1.743583922742348 | 0.95 | 0.717 | 0.356 | 1.052 | 1.394 | 2.81 |
| 1.746725515395937 | 0.95 | 0.718 | 0.357 | 1.052 | 1.393 | 2.8 |
| 1.749867108049527 | 0.95 | 0.718 | 0.359 | 1.052 | 1.392 | 2.789 |
| 1.753008700703117 | 0.95 | 0.719 | 0.36 | 1.052 | 1.392 | 2.778 |
| 1.756150293356707 | 0.95 | 0.719 | 0.361 | 1.052 | 1.391 | 2.767 |
| 1.759291886010297 | 0.951 | 0.719 | 0.363 | 1.052 | 1.39 | 2.757 |
| 1.762433478663887 | 0.951 | 0.72 | 0.364 | 1.052 | 1.389 | 2.746 |
| 1.765575071317476 | 0.951 | 0.72 | 0.366 | 1.052 | 1.388 | 2.735 |
| 1.768716663971066 | 0.951 | 0.721 | 0.367 | 1.052 | 1.388 | 2.724 |
| 1.771858256624656 | 0.951 | 0.721 | 0.369 | 1.052 | 1.387 | 2.713 |
| 1.774999849278246 | 0.951 | 0.721 | 0.37 | 1.052 | 1.386 | 2.702 |
| 1.778141441931836 | 0.951 | 0.722 | 0.372 | 1.052 | 1.385 | 2.691 |
| 1.781283034585426 | 0.951 | 0.722 | 0.373 | 1.052 | 1.384 | 2.679 |
| 1.784424627239015 | 0.951 | 0.723 | 0.375 | 1.051 | 1.383 | 2.668 |
| 1.787566219892605 | 0.951 | 0.723 | 0.376 | 1.051 | 1.383 | 2.657 |
| 1.790707812546195 | 0.951 | 0.724 | 0.378 | 1.051 | 1.382 | 2.646 |
| 1.793849405199785 | 0.951 | 0.724 | 0.38 | 1.051 | 1.381 | 2.635 |
| 1.796990997853375 | 0.951 | 0.725 | 0.381 | 1.051 | 1.38 | 2.624 |
| 1.800132590506964 | 0.951 | 0.725 | 0.383 | 1.051 | 1.379 | 2.613 |
| 1.803274183160554 | 0.951 | 0.726 | 0.384 | 1.051 | 1.378 | 2.601 |
| 1.806415775814144 | 0.952 | 0.726 | 0.386 | 1.051 | 1.377 | 2.59 |
| 1.809557368467734 | 0.952 | 0.727 | 0.388 | 1.051 | 1.376 | 2.579 |
| 1.812698961121324 | 0.952 | 0.727 | 0.389 | 1.051 | 1.375 | 2.568 |
| 1.815840553774914 | 0.952 | 0.728 | 0.391 | 1.051 | 1.374 | 2.557 |
| 1.818982146428503 | 0.952 | 0.728 | 0.393 | 1.051 | 1.373 | 2.546 |
| 1.822123739082093 | 0.952 | 0.729 | 0.395 | 1.05 | 1.372 | 2.535 |
| 1.825265331735683 | 0.952 | 0.729 | 0.396 | 1.05 | 1.371 | 2.524 |
| 1.828406924389273 | 0.952 | 0.73 | 0.398 | 1.05 | 1.37 | 2.512 |
| 1.831548517042863 | 0.952 | 0.73 | 0.4 | 1.05 | 1.369 | 2.501 |
| 1.834690109696452 | 0.952 | 0.731 | 0.402 | 1.05 | 1.368 | 2.49 |
| 1.837831702350042 | 0.952 | 0.731 | 0.403 | 1.05 | 1.367 | 2.479 |
| 1.840973295003632 | 0.952 | 0.732 | 0.405 | 1.05 | 1.366 | 2.468 |
| 1.844114887657222 | 0.953 | 0.732 | 0.407 | 1.05 | 1.365 | 2.458 |
| 1.847256480310812 | 0.953 | 0.733 | 0.409 | 1.05 | 1.364 | 2.447 |
| 1.850398072964402 | 0.953 | 0.734 | 0.411 | 1.05 | 1.363 | 2.436 |
| 1.853539665617991 | 0.953 | 0.734 | 0.412 | 1.05 | 1.362 | 2.425 |
| 1.856681258271581 | 0.953 | 0.735 | 0.414 | 1.049 | 1.361 | 2.414 |
| 1.859822850925171 | 0.953 | 0.735 | 0.416 | 1.049 | 1.36 | 2.403 |
| 1.862964443578761 | 0.953 | 0.736 | 0.418 | 1.049 | 1.359 | 2.393 |
| 1.866106036232351 | 0.953 | 0.736 | 0.42 | 1.049 | 1.358 | 2.382 |
| 1.86924762888594 | 0.953 | 0.737 | 0.422 | 1.049 | 1.357 | 2.371 |
| 1.87238922153953 | 0.953 | 0.738 | 0.424 | 1.049 | 1.356 | 2.361 |
| 1.87553081419312 | 0.953 | 0.738 | 0.425 | 1.049 | 1.355 | 2.35 |
| 1.87867240684671 | 0.954 | 0.739 | 0.427 | 1.049 | 1.353 | 2.34 |
| 1.8818139995003 | 0.954 | 0.739 | 0.429 | 1.049 | 1.352 | 2.329 |
| 1.88495559215389 | 0.954 | 0.74 | 0.431 | 1.049 | 1.351 | 2.319 |
| 1.888097184807479 | 0.954 | 0.741 | 0.433 | 1.048 | 1.35 | 2.309 |
| 1.891238777461069 | 0.954 | 0.741 | 0.435 | 1.048 | 1.349 | 2.298 |
| 1.89438037011466 | 0.954 | 0.742 | 0.437 | 1.048 | 1.348 | 2.288 |
| 1.897521962768249 | 0.954 | 0.743 | 0.439 | 1.048 | 1.347 | 2.278 |
| 1.900663555421839 | 0.954 | 0.743 | 0.441 | 1.048 | 1.345 | 2.268 |
| 1.903805148075429 | 0.954 | 0.744 | 0.443 | 1.048 | 1.344 | 2.258 |
| 1.906946740729018 | 0.954 | 0.745 | 0.445 | 1.048 | 1.343 | 2.248 |
| 1.910088333382608 | 0.955 | 0.745 | 0.447 | 1.048 | 1.342 | 2.238 |
| 1.913229926036198 | 0.955 | 0.746 | 0.449 | 1.048 | 1.341 | 2.228 |
| 1.916371518689788 | 0.955 | 0.747 | 0.451 | 1.047 | 1.339 | 2.218 |
| 1.919513111343378 | 0.955 | 0.747 | 0.453 | 1.047 | 1.338 | 2.208 |
| 1.922654703996967 | 0.955 | 0.748 | 0.455 | 1.047 | 1.337 | 2.198 |
| 1.925796296650557 | 0.955 | 0.749 | 0.457 | 1.047 | 1.336 | 2.189 |
| 1.928937889304147 | 0.955 | 0.749 | 0.459 | 1.047 | 1.335 | 2.179 |
| 1.932079481957737 | 0.955 | 0.75 | 0.461 | 1.047 | 1.333 | 2.17 |
| 1.935221074611327 | 0.955 | 0.751 | 0.463 | 1.047 | 1.332 | 2.16 |
| 1.938362667264917 | 0.955 | 0.751 | 0.465 | 1.047 | 1.331 | 2.151 |
| 1.941504259918506 | 0.956 | 0.752 | 0.467 | 1.046 | 1.33 | 2.141 |
| 1.944645852572096 | 0.956 | 0.753 | 0.469 | 1.046 | 1.328 | 2.132 |
| 1.947787445225686 | 0.956 | 0.753 | 0.471 | 1.046 | 1.327 | 2.123 |
| 1.950929037879276 | 0.956 | 0.754 | 0.473 | 1.046 | 1.326 | 2.113 |
| 1.954070630532866 | 0.956 | 0.755 | 0.475 | 1.046 | 1.325 | 2.104 |
| 1.957212223186455 | 0.956 | 0.756 | 0.477 | 1.046 | 1.323 | 2.095 |
| 1.960353815840045 | 0.956 | 0.756 | 0.479 | 1.046 | 1.322 | 2.086 |
| 1.963495408493635 | 0.956 | 0.757 | 0.481 | 1.046 | 1.321 | 2.077 |
| 1.966637001147225 | 0.956 | 0.758 | 0.484 | 1.045 | 1.32 | 2.068 |
| 1.969778593800815 | 0.957 | 0.759 | 0.486 | 1.045 | 1.318 | 2.059 |
| 1.972920186454405 | 0.957 | 0.759 | 0.488 | 1.045 | 1.317 | 2.05 |
| 1.976061779107994 | 0.957 | 0.76 | 0.49 | 1.045 | 1.316 | 2.042 |
| 1.979203371761584 | 0.957 | 0.761 | 0.492 | 1.045 | 1.314 | 2.033 |
| 1.982344964415174 | 0.957 | 0.762 | 0.494 | 1.045 | 1.313 | 2.024 |
| 1.985486557068764 | 0.957 | 0.762 | 0.496 | 1.045 | 1.312 | 2.016 |
| 1.988628149722354 | 0.957 | 0.763 | 0.498 | 1.045 | 1.31 | 2.007 |
| 1.991769742375943 | 0.957 | 0.764 | 0.5 | 1.044 | 1.309 | 1.999 |
| 1.994911335029533 | 0.958 | 0.765 | 0.502 | 1.044 | 1.308 | 1.99 |
| 1.998052927683123 | 0.958 | 0.765 | 0.505 | 1.044 | 1.306 | 1.982 |
| 2.001194520336712 | 0.958 | 0.766 | 0.507 | 1.044 | 1.305 | 1.974 |
| 2.004336112990302 | 0.958 | 0.767 | 0.509 | 1.044 | 1.304 | 1.966 |
| 2.007477705643892 | 0.958 | 0.768 | 0.511 | 1.044 | 1.303 | 1.957 |
| 2.010619298297482 | 0.958 | 0.769 | 0.513 | 1.044 | 1.301 | 1.949 |
| 2.013760890951071 | 0.958 | 0.769 | 0.515 | 1.043 | 1.3 | 1.941 |
| 2.016902483604661 | 0.958 | 0.77 | 0.517 | 1.043 | 1.299 | 1.933 |
| 2.02004407625825 | 0.959 | 0.771 | 0.519 | 1.043 | 1.297 | 1.925 |
| 2.02318566891184 | 0.959 | 0.772 | 0.522 | 1.043 | 1.296 | 1.918 |
| 2.02632726156543 | 0.959 | 0.773 | 0.524 | 1.043 | 1.294 | 1.91 |
| 2.029468854219019 | 0.959 | 0.773 | 0.526 | 1.043 | 1.293 | 1.902 |
| 2.032610446872609 | 0.959 | 0.774 | 0.528 | 1.043 | 1.292 | 1.894 |
| 2.035752039526198 | 0.959 | 0.775 | 0.53 | 1.043 | 1.29 | 1.887 |
| 2.038893632179788 | 0.959 | 0.776 | 0.532 | 1.042 | 1.289 | 1.879 |
| 2.042035224833378 | 0.959 | 0.777 | 0.534 | 1.042 | 1.288 | 1.872 |
| 2.045176817486967 | 0.96 | 0.777 | 0.536 | 1.042 | 1.286 | 1.864 |
| 2.048318410140557 | 0.96 | 0.778 | 0.539 | 1.042 | 1.285 | 1.857 |
| 2.051460002794146 | 0.96 | 0.779 | 0.541 | 1.042 | 1.284 | 1.849 |
| 2.054601595447736 | 0.96 | 0.78 | 0.543 | 1.042 | 1.282 | 1.842 |
| 2.057743188101325 | 0.96 | 0.781 | 0.545 | 1.041 | 1.281 | 1.835 |
| 2.060884780754915 | 0.96 | 0.782 | 0.547 | 1.041 | 1.28 | 1.828 |
| 2.064026373408505 | 0.96 | 0.782 | 0.549 | 1.041 | 1.278 | 1.82 |
| 2.067167966062094 | 0.961 | 0.783 | 0.551 | 1.041 | 1.277 | 1.813 |
| 2.070309558715684 | 0.961 | 0.784 | 0.554 | 1.041 | 1.275 | 1.806 |
| 2.073451151369273 | 0.961 | 0.785 | 0.556 | 1.041 | 1.274 | 1.799 |
| 2.076592744022863 | 0.961 | 0.786 | 0.558 | 1.041 | 1.273 | 1.792 |
| 2.079734336676452 | 0.961 | 0.787 | 0.56 | 1.04 | 1.271 | 1.786 |
| 2.082875929330042 | 0.961 | 0.787 | 0.562 | 1.04 | 1.27 | 1.779 |
| 2.086017521983632 | 0.961 | 0.788 | 0.564 | 1.04 | 1.269 | 1.772 |
| 2.089159114637221 | 0.962 | 0.789 | 0.567 | 1.04 | 1.267 | 1.765 |
| 2.092300707290811 | 0.962 | 0.79 | 0.569 | 1.04 | 1.266 | 1.759 |
| 2.095442299944401 | 0.962 | 0.791 | 0.571 | 1.04 | 1.264 | 1.752 |
| 2.09858389259799 | 0.962 | 0.792 | 0.573 | 1.04 | 1.263 | 1.745 |
| 2.10172548525158 | 0.962 | 0.793 | 0.575 | 1.039 | 1.262 | 1.739 |
| 2.104867077905169 | 0.962 | 0.793 | 0.577 | 1.039 | 1.26 | 1.732 |
| 2.108008670558759 | 0.962 | 0.794 | 0.579 | 1.039 | 1.259 | 1.726 |
| 2.111150263212349 | 0.963 | 0.795 | 0.582 | 1.039 | 1.258 | 1.72 |
| 2.114291855865938 | 0.963 | 0.796 | 0.584 | 1.039 | 1.256 | 1.713 |
| 2.117433448519528 | 0.963 | 0.797 | 0.586 | 1.039 | 1.255 | 1.707 |
| 2.120575041173117 | 0.963 | 0.798 | 0.588 | 1.038 | 1.253 | 1.701 |
| 2.123716633826707 | 0.963 | 0.799 | 0.59 | 1.038 | 1.252 | 1.695 |
| 2.126858226480297 | 0.963 | 0.8 | 0.592 | 1.038 | 1.251 | 1.688 |
| 2.129999819133886 | 0.963 | 0.8 | 0.594 | 1.038 | 1.249 | 1.682 |
| 2.133141411787476 | 0.964 | 0.801 | 0.597 | 1.038 | 1.248 | 1.676 |
| 2.136283004441065 | 0.964 | 0.802 | 0.599 | 1.038 | 1.247 | 1.67 |
| 2.139424597094655 | 0.964 | 0.803 | 0.601 | 1.038 | 1.245 | 1.664 |
| 2.142566189748245 | 0.964 | 0.804 | 0.603 | 1.037 | 1.244 | 1.659 |
| 2.145707782401834 | 0.964 | 0.805 | 0.605 | 1.037 | 1.242 | 1.653 |
| 2.148849375055424 | 0.964 | 0.806 | 0.607 | 1.037 | 1.241 | 1.647 |
| 2.151990967709013 | 0.964 | 0.807 | 0.609 | 1.037 | 1.24 | 1.641 |
| 2.155132560362603 | 0.965 | 0.808 | 0.611 | 1.037 | 1.238 | 1.635 |
| 2.158274153016193 | 0.965 | 0.808 | 0.614 | 1.037 | 1.237 | 1.63 |
| 2.161415745669782 | 0.965 | 0.809 | 0.616 | 1.036 | 1.236 | 1.624 |
| 2.164557338323372 | 0.965 | 0.81 | 0.618 | 1.036 | 1.234 | 1.619 |
| 2.167698930976961 | 0.965 | 0.811 | 0.62 | 1.036 | 1.233 | 1.613 |
| 2.170840523630551 | 0.965 | 0.812 | 0.622 | 1.036 | 1.231 | 1.608 |
| 2.173982116284141 | 0.965 | 0.813 | 0.624 | 1.036 | 1.23 | 1.602 |
| 2.17712370893773 | 0.966 | 0.814 | 0.626 | 1.036 | 1.229 | 1.597 |
| 2.18026530159132 | 0.966 | 0.815 | 0.628 | 1.035 | 1.227 | 1.591 |
| 2.183406894244909 | 0.966 | 0.816 | 0.631 | 1.035 | 1.226 | 1.586 |
| 2.186548486898499 | 0.966 | 0.817 | 0.633 | 1.035 | 1.225 | 1.581 |
| 2.189690079552089 | 0.966 | 0.817 | 0.635 | 1.035 | 1.223 | 1.575 |
| 2.192831672205678 | 0.966 | 0.818 | 0.637 | 1.035 | 1.222 | 1.57 |
| 2.195973264859268 | 0.967 | 0.819 | 0.639 | 1.035 | 1.221 | 1.565 |
| 2.199114857512857 | 0.967 | 0.82 | 0.641 | 1.034 | 1.219 | 1.56 |
| 2.202256450166447 | 0.967 | 0.821 | 0.643 | 1.034 | 1.218 | 1.555 |
| 2.205398042820036 | 0.967 | 0.822 | 0.645 | 1.034 | 1.216 | 1.55 |
| 2.208539635473626 | 0.967 | 0.823 | 0.647 | 1.034 | 1.215 | 1.545 |
| 2.211681228127216 | 0.967 | 0.824 | 0.649 | 1.034 | 1.214 | 1.54 |
| 2.214822820780805 | 0.967 | 0.825 | 0.652 | 1.034 | 1.212 | 1.535 |
| 2.217964413434395 | 0.968 | 0.826 | 0.654 | 1.033 | 1.211 | 1.53 |
| 2.221106006087984 | 0.968 | 0.827 | 0.656 | 1.033 | 1.21 | 1.525 |
| 2.224247598741574 | 0.968 | 0.828 | 0.658 | 1.033 | 1.208 | 1.52 |
| 2.227389191395164 | 0.968 | 0.828 | 0.66 | 1.033 | 1.207 | 1.516 |
| 2.230530784048753 | 0.968 | 0.829 | 0.662 | 1.033 | 1.206 | 1.511 |
| 2.233672376702343 | 0.968 | 0.83 | 0.664 | 1.033 | 1.204 | 1.506 |
| 2.236813969355933 | 0.969 | 0.831 | 0.666 | 1.032 | 1.203 | 1.501 |
| 2.239955562009522 | 0.969 | 0.832 | 0.668 | 1.032 | 1.202 | 1.497 |
| 2.243097154663112 | 0.969 | 0.833 | 0.67 | 1.032 | 1.2 | 1.492 |
| 2.246238747316701 | 0.969 | 0.834 | 0.672 | 1.032 | 1.199 | 1.488 |
| 2.249380339970291 | 0.969 | 0.835 | 0.674 | 1.032 | 1.198 | 1.483 |
| 2.252521932623881 | 0.969 | 0.836 | 0.676 | 1.032 | 1.196 | 1.479 |
| 2.25566352527747 | 0.97 | 0.837 | 0.678 | 1.031 | 1.195 | 1.474 |
| 2.25880511793106 | 0.97 | 0.838 | 0.68 | 1.031 | 1.194 | 1.47 |
| 2.261946710584649 | 0.97 | 0.839 | 0.682 | 1.031 | 1.193 | 1.465 |
| 2.265088303238239 | 0.97 | 0.839 | 0.684 | 1.031 | 1.191 | 1.461 |
| 2.268229895891829 | 0.97 | 0.84 | 0.686 | 1.031 | 1.19 | 1.457 |
| 2.271371488545418 | 0.97 | 0.841 | 0.688 | 1.031 | 1.189 | 1.452 |
| 2.274513081199008 | 0.97 | 0.842 | 0.691 | 1.03 | 1.187 | 1.448 |
| 2.277654673852597 | 0.971 | 0.843 | 0.693 | 1.03 | 1.186 | 1.444 |
| 2.280796266506186 | 0.971 | 0.844 | 0.695 | 1.03 | 1.185 | 1.44 |
| 2.283937859159776 | 0.971 | 0.845 | 0.697 | 1.03 | 1.183 | 1.436 |
| 2.287079451813366 | 0.971 | 0.846 | 0.699 | 1.03 | 1.182 | 1.432 |
| 2.290221044466955 | 0.971 | 0.847 | 0.701 | 1.03 | 1.181 | 1.427 |
| 2.293362637120545 | 0.971 | 0.848 | 0.703 | 1.029 | 1.18 | 1.423 |
| 2.296504229774135 | 0.972 | 0.849 | 0.705 | 1.029 | 1.178 | 1.419 |
| 2.299645822427724 | 0.972 | 0.85 | 0.707 | 1.029 | 1.177 | 1.415 |
| 2.302787415081314 | 0.972 | 0.85 | 0.709 | 1.029 | 1.176 | 1.411 |
| 2.305929007734904 | 0.972 | 0.851 | 0.711 | 1.029 | 1.175 | 1.407 |
| 2.309070600388493 | 0.972 | 0.852 | 0.712 | 1.029 | 1.173 | 1.404 |
| 2.312212193042083 | 0.972 | 0.853 | 0.714 | 1.028 | 1.172 | 1.4 |
| 2.315353785695672 | 0.973 | 0.854 | 0.716 | 1.028 | 1.171 | 1.396 |
| 2.318495378349262 | 0.973 | 0.855 | 0.718 | 1.028 | 1.169 | 1.392 |
| 2.321636971002852 | 0.973 | 0.856 | 0.72 | 1.028 | 1.168 | 1.388 |
| 2.324778563656441 | 0.973 | 0.857 | 0.722 | 1.028 | 1.167 | 1.384 |
| 2.327920156310031 | 0.973 | 0.858 | 0.724 | 1.028 | 1.166 | 1.381 |
| 2.33106174896362 | 0.973 | 0.859 | 0.726 | 1.027 | 1.164 | 1.377 |
| 2.33420334161721 | 0.974 | 0.86 | 0.728 | 1.027 | 1.163 | 1.373 |
| 2.3373449342708 | 0.974 | 0.861 | 0.73 | 1.027 | 1.162 | 1.37 |
| 2.340486526924389 | 0.974 | 0.861 | 0.732 | 1.027 | 1.161 | 1.366 |
| 2.343628119577979 | 0.974 | 0.862 | 0.734 | 1.027 | 1.16 | 1.362 |
| 2.346769712231568 | 0.974 | 0.863 | 0.736 | 1.026 | 1.158 | 1.359 |
| 2.349911304885158 | 0.974 | 0.864 | 0.738 | 1.026 | 1.157 | 1.355 |
| 2.353052897538748 | 0.975 | 0.865 | 0.74 | 1.026 | 1.156 | 1.352 |
| 2.356194490192337 | 0.975 | 0.866 | 0.742 | 1.026 | 1.155 | 1.348 |
| 2.359336082845927 | 0.975 | 0.867 | 0.744 | 1.026 | 1.153 | 1.345 |
| 2.362477675499516 | 0.975 | 0.868 | 0.745 | 1.026 | 1.152 | 1.342 |
| 2.365619268153106 | 0.975 | 0.869 | 0.747 | 1.025 | 1.151 | 1.338 |
| 2.368760860806696 | 0.975 | 0.87 | 0.749 | 1.025 | 1.15 | 1.335 |
| 2.371902453460285 | 0.975 | 0.871 | 0.751 | 1.025 | 1.149 | 1.331 |
| 2.375044046113875 | 0.976 | 0.871 | 0.753 | 1.025 | 1.148 | 1.328 |
| 2.378185638767464 | 0.976 | 0.872 | 0.755 | 1.025 | 1.146 | 1.325 |
| 2.381327231421054 | 0.976 | 0.873 | 0.757 | 1.025 | 1.145 | 1.322 |
| 2.384468824074644 | 0.976 | 0.874 | 0.759 | 1.024 | 1.144 | 1.318 |
| 2.387610416728233 | 0.976 | 0.875 | 0.76 | 1.024 | 1.143 | 1.315 |
| 2.390752009381823 | 0.976 | 0.876 | 0.762 | 1.024 | 1.142 | 1.312 |
| 2.393893602035412 | 0.977 | 0.877 | 0.764 | 1.024 | 1.14 | 1.309 |
| 2.397035194689002 | 0.977 | 0.878 | 0.766 | 1.024 | 1.139 | 1.306 |
| 2.400176787342591 | 0.977 | 0.879 | 0.768 | 1.024 | 1.138 | 1.302 |
| 2.403318379996181 | 0.977 | 0.88 | 0.77 | 1.023 | 1.137 | 1.299 |
| 2.406459972649771 | 0.977 | 0.88 | 0.771 | 1.023 | 1.136 | 1.296 |
| 2.40960156530336 | 0.977 | 0.881 | 0.773 | 1.023 | 1.135 | 1.293 |
| 2.41274315795695 | 0.978 | 0.882 | 0.775 | 1.023 | 1.134 | 1.29 |
| 2.41588475061054 | 0.978 | 0.883 | 0.777 | 1.023 | 1.132 | 1.287 |
| 2.419026343264129 | 0.978 | 0.884 | 0.779 | 1.023 | 1.131 | 1.284 |
| 2.422167935917719 | 0.978 | 0.885 | 0.781 | 1.022 | 1.13 | 1.281 |
| 2.425309528571308 | 0.978 | 0.886 | 0.782 | 1.022 | 1.129 | 1.278 |
| 2.428451121224898 | 0.978 | 0.887 | 0.784 | 1.022 | 1.128 | 1.275 |
| 2.431592713878488 | 0.979 | 0.887 | 0.786 | 1.022 | 1.127 | 1.272 |
| 2.434734306532077 | 0.979 | 0.888 | 0.788 | 1.022 | 1.126 | 1.27 |
| 2.437875899185667 | 0.979 | 0.889 | 0.789 | 1.022 | 1.125 | 1.267 |
| 2.441017491839256 | 0.979 | 0.89 | 0.791 | 1.021 | 1.124 | 1.264 |
| 2.444159084492846 | 0.979 | 0.891 | 0.793 | 1.021 | 1.122 | 1.261 |
| 2.447300677146435 | 0.979 | 0.892 | 0.795 | 1.021 | 1.121 | 1.258 |
| 2.450442269800025 | 0.979 | 0.893 | 0.796 | 1.021 | 1.12 | 1.256 |
| 2.453583862453615 | 0.98 | 0.894 | 0.798 | 1.021 | 1.119 | 1.253 |
| 2.456725455107204 | 0.98 | 0.894 | 0.8 | 1.021 | 1.118 | 1.25 |
| 2.459867047760794 | 0.98 | 0.895 | 0.802 | 1.02 | 1.117 | 1.247 |
| 2.463008640414384 | 0.98 | 0.896 | 0.803 | 1.02 | 1.116 | 1.245 |
| 2.466150233067973 | 0.98 | 0.897 | 0.805 | 1.02 | 1.115 | 1.242 |
| 2.469291825721563 | 0.98 | 0.898 | 0.807 | 1.02 | 1.114 | 1.239 |
| 2.472433418375152 | 0.981 | 0.899 | 0.809 | 1.02 | 1.113 | 1.237 |
| 2.475575011028742 | 0.981 | 0.9 | 0.81 | 1.02 | 1.112 | 1.234 |
| 2.478716603682332 | 0.981 | 0.9 | 0.812 | 1.019 | 1.111 | 1.232 |
| 2.481858196335921 | 0.981 | 0.901 | 0.814 | 1.019 | 1.11 | 1.229 |
| 2.48499978898951 | 0.981 | 0.902 | 0.815 | 1.019 | 1.109 | 1.227 |
| 2.4881413816431 | 0.981 | 0.903 | 0.817 | 1.019 | 1.108 | 1.224 |
| 2.49128297429669 | 0.982 | 0.904 | 0.819 | 1.019 | 1.107 | 1.222 |
| 2.49442456695028 | 0.982 | 0.905 | 0.82 | 1.019 | 1.106 | 1.219 |
| 2.497566159603869 | 0.982 | 0.905 | 0.822 | 1.019 | 1.104 | 1.217 |
| 2.500707752257458 | 0.982 | 0.906 | 0.824 | 1.018 | 1.103 | 1.214 |
| 2.503849344911048 | 0.982 | 0.907 | 0.825 | 1.018 | 1.102 | 1.212 |
| 2.506990937564638 | 0.982 | 0.908 | 0.827 | 1.018 | 1.101 | 1.209 |
| 2.510132530218228 | 0.982 | 0.909 | 0.828 | 1.018 | 1.1 | 1.207 |
| 2.513274122871817 | 0.983 | 0.91 | 0.83 | 1.018 | 1.099 | 1.205 |
| 2.516415715525407 | 0.983 | 0.91 | 0.832 | 1.018 | 1.098 | 1.202 |
| 2.519557308178996 | 0.983 | 0.911 | 0.833 | 1.017 | 1.097 | 1.2 |
| 2.522698900832586 | 0.983 | 0.912 | 0.835 | 1.017 | 1.097 | 1.198 |
| 2.525840493486176 | 0.983 | 0.913 | 0.837 | 1.017 | 1.096 | 1.195 |
| 2.528982086139765 | 0.983 | 0.914 | 0.838 | 1.017 | 1.095 | 1.193 |
| 2.532123678793355 | 0.983 | 0.914 | 0.84 | 1.017 | 1.094 | 1.191 |
| 2.535265271446944 | 0.984 | 0.915 | 0.841 | 1.017 | 1.093 | 1.189 |
| 2.538406864100534 | 0.984 | 0.916 | 0.843 | 1.016 | 1.092 | 1.186 |
| 2.541548456754124 | 0.984 | 0.917 | 0.844 | 1.016 | 1.091 | 1.184 |
| 2.544690049407713 | 0.984 | 0.918 | 0.846 | 1.016 | 1.09 | 1.182 |
| 2.547831642061302 | 0.984 | 0.918 | 0.848 | 1.016 | 1.089 | 1.18 |
| 2.550973234714892 | 0.984 | 0.919 | 0.849 | 1.016 | 1.088 | 1.178 |
| 2.554114827368482 | 0.985 | 0.92 | 0.851 | 1.016 | 1.087 | 1.176 |
| 2.557256420022072 | 0.985 | 0.921 | 0.852 | 1.016 | 1.086 | 1.174 |
| 2.560398012675661 | 0.985 | 0.922 | 0.854 | 1.015 | 1.085 | 1.171 |
| 2.563539605329251 | 0.985 | 0.922 | 0.855 | 1.015 | 1.084 | 1.169 |
| 2.56668119798284 | 0.985 | 0.923 | 0.857 | 1.015 | 1.083 | 1.167 |
| 2.56982279063643 | 0.985 | 0.924 | 0.858 | 1.015 | 1.082 | 1.165 |
| 2.57296438329002 | 0.985 | 0.925 | 0.86 | 1.015 | 1.081 | 1.163 |
| 2.576105975943609 | 0.986 | 0.925 | 0.861 | 1.015 | 1.081 | 1.161 |
| 2.579247568597199 | 0.986 | 0.926 | 0.863 | 1.015 | 1.08 | 1.159 |
| 2.582389161250788 | 0.986 | 0.927 | 0.864 | 1.014 | 1.079 | 1.157 |
| 2.585530753904377 | 0.986 | 0.928 | 0.866 | 1.014 | 1.078 | 1.155 |
| 2.588672346557967 | 0.986 | 0.928 | 0.867 | 1.014 | 1.077 | 1.153 |
| 2.591813939211557 | 0.986 | 0.929 | 0.869 | 1.014 | 1.076 | 1.151 |
| 2.594955531865147 | 0.986 | 0.93 | 0.87 | 1.014 | 1.075 | 1.149 |
| 2.598097124518736 | 0.987 | 0.931 | 0.871 | 1.014 | 1.074 | 1.148 |
| 2.601238717172326 | 0.987 | 0.931 | 0.873 | 1.014 | 1.074 | 1.146 |
| 2.604380309825915 | 0.987 | 0.932 | 0.874 | 1.013 | 1.073 | 1.144 |
| 2.607521902479505 | 0.987 | 0.933 | 0.876 | 1.013 | 1.072 | 1.142 |
| 2.610663495133095 | 0.987 | 0.934 | 0.877 | 1.013 | 1.071 | 1.14 |
| 2.613805087786684 | 0.987 | 0.934 | 0.878 | 1.013 | 1.07 | 1.138 |
| 2.616946680440274 | 0.987 | 0.935 | 0.88 | 1.013 | 1.069 | 1.137 |
| 2.620088273093863 | 0.988 | 0.936 | 0.881 | 1.013 | 1.068 | 1.135 |
| 2.623229865747452 | 0.988 | 0.937 | 0.883 | 1.013 | 1.068 | 1.133 |
| 2.626371458401042 | 0.988 | 0.937 | 0.884 | 1.012 | 1.067 | 1.131 |
| 2.629513051054632 | 0.988 | 0.938 | 0.885 | 1.012 | 1.066 | 1.129 |
| 2.632654643708222 | 0.988 | 0.939 | 0.887 | 1.012 | 1.065 | 1.128 |
| 2.635796236361811 | 0.988 | 0.939 | 0.888 | 1.012 | 1.064 | 1.126 |
| 2.638937829015401 | 0.988 | 0.94 | 0.889 | 1.012 | 1.064 | 1.124 |
| 2.642079421668991 | 0.988 | 0.941 | 0.891 | 1.012 | 1.063 | 1.123 |
| 2.64522101432258 | 0.989 | 0.942 | 0.892 | 1.012 | 1.062 | 1.121 |
| 2.64836260697617 | 0.989 | 0.942 | 0.893 | 1.011 | 1.061 | 1.119 |
| 2.651504199629759 | 0.989 | 0.943 | 0.895 | 1.011 | 1.06 | 1.118 |
| 2.654645792283349 | 0.989 | 0.944 | 0.896 | 1.011 | 1.06 | 1.116 |
| 2.657787384936938 | 0.989 | 0.944 | 0.897 | 1.011 | 1.059 | 1.114 |
| 2.660928977590528 | 0.989 | 0.945 | 0.899 | 1.011 | 1.058 | 1.113 |
| 2.664070570244118 | 0.989 | 0.946 | 0.9 | 1.011 | 1.057 | 1.111 |
| 2.667212162897707 | 0.99 | 0.946 | 0.901 | 1.011 | 1.057 | 1.11 |
| 2.670353755551297 | 0.99 | 0.947 | 0.902 | 1.01 | 1.056 | 1.108 |
| 2.673495348204887 | 0.99 | 0.948 | 0.904 | 1.01 | 1.055 | 1.106 |
| 2.676636940858476 | 0.99 | 0.948 | 0.905 | 1.01 | 1.054 | 1.105 |
| 2.679778533512066 | 0.99 | 0.949 | 0.906 | 1.01 | 1.054 | 1.103 |
| 2.682920126165655 | 0.99 | 0.95 | 0.908 | 1.01 | 1.053 | 1.102 |
| 2.686061718819245 | 0.99 | 0.95 | 0.909 | 1.01 | 1.052 | 1.1 |
| 2.689203311472835 | 0.99 | 0.951 | 0.91 | 1.01 | 1.051 | 1.099 |
| 2.692344904126424 | 0.991 | 0.952 | 0.911 | 1.01 | 1.051 | 1.097 |
| 2.695486496780014 | 0.991 | 0.952 | 0.912 | 1.009 | 1.05 | 1.096 |
| 2.698628089433603 | 0.991 | 0.953 | 0.914 | 1.009 | 1.049 | 1.095 |
| 2.701769682087193 | 0.991 | 0.954 | 0.915 | 1.009 | 1.049 | 1.093 |
| 2.704911274740782 | 0.991 | 0.954 | 0.916 | 1.009 | 1.048 | 1.092 |
| 2.708052867394372 | 0.991 | 0.955 | 0.917 | 1.009 | 1.047 | 1.09 |
| 2.711194460047962 | 0.991 | 0.955 | 0.918 | 1.009 | 1.047 | 1.089 |
| 2.714336052701551 | 0.991 | 0.956 | 0.919 | 1.009 | 1.046 | 1.088 |
| 2.717477645355141 | 0.991 | 0.957 | 0.921 | 1.009 | 1.045 | 1.086 |
| 2.720619238008731 | 0.992 | 0.957 | 0.922 | 1.008 | 1.045 | 1.085 |
| 2.72376083066232 | 0.992 | 0.958 | 0.923 | 1.008 | 1.044 | 1.084 |
| 2.72690242331591 | 0.992 | 0.959 | 0.924 | 1.008 | 1.043 | 1.082 |
| 2.730044015969499 | 0.992 | 0.959 | 0.925 | 1.008 | 1.043 | 1.081 |
| 2.733185608623089 | 0.992 | 0.96 | 0.926 | 1.008 | 1.042 | 1.08 |
| 2.736327201276678 | 0.992 | 0.96 | 0.927 | 1.008 | 1.041 | 1.078 |
| 2.739468793930268 | 0.992 | 0.961 | 0.929 | 1.008 | 1.041 | 1.077 |
| 2.742610386583858 | 0.992 | 0.962 | 0.93 | 1.008 | 1.04 | 1.076 |
| 2.745751979237447 | 0.993 | 0.962 | 0.931 | 1.008 | 1.039 | 1.074 |
| 2.748893571891036 | 0.993 | 0.963 | 0.932 | 1.007 | 1.039 | 1.073 |
| 2.752035164544627 | 0.993 | 0.963 | 0.933 | 1.007 | 1.038 | 1.072 |
| 2.755176757198216 | 0.993 | 0.964 | 0.934 | 1.007 | 1.038 | 1.071 |
| 2.758318349851806 | 0.993 | 0.964 | 0.935 | 1.007 | 1.037 | 1.07 |
| 2.761459942505395 | 0.993 | 0.965 | 0.936 | 1.007 | 1.036 | 1.068 |
| 2.764601535158985 | 0.993 | 0.966 | 0.937 | 1.007 | 1.036 | 1.067 |
| 2.767743127812574 | 0.993 | 0.966 | 0.938 | 1.007 | 1.035 | 1.066 |
| 2.770884720466164 | 0.993 | 0.967 | 0.939 | 1.007 | 1.035 | 1.065 |
| 2.774026313119754 | 0.994 | 0.967 | 0.94 | 1.007 | 1.034 | 1.064 |
| 2.777167905773343 | 0.994 | 0.968 | 0.941 | 1.006 | 1.033 | 1.063 |
| 2.780309498426932 | 0.994 | 0.968 | 0.942 | 1.006 | 1.033 | 1.061 |
| 2.783451091080522 | 0.994 | 0.969 | 0.943 | 1.006 | 1.032 | 1.06 |
| 2.786592683734112 | 0.994 | 0.969 | 0.944 | 1.006 | 1.032 | 1.059 |
| 2.789734276387701 | 0.994 | 0.97 | 0.945 | 1.006 | 1.031 | 1.058 |
| 2.792875869041291 | 0.994 | 0.97 | 0.946 | 1.006 | 1.031 | 1.057 |
| 2.796017461694881 | 0.994 | 0.971 | 0.947 | 1.006 | 1.03 | 1.056 |
| 2.79915905434847 | 0.994 | 0.971 | 0.948 | 1.006 | 1.029 | 1.055 |
| 2.80230064700206 | 0.994 | 0.972 | 0.949 | 1.006 | 1.029 | 1.054 |
| 2.80544223965565 | 0.995 | 0.972 | 0.95 | 1.005 | 1.028 | 1.053 |
| 2.808583832309239 | 0.995 | 0.973 | 0.951 | 1.005 | 1.028 | 1.052 |
| 2.811725424962829 | 0.995 | 0.973 | 0.952 | 1.005 | 1.027 | 1.051 |
| 2.814867017616419 | 0.995 | 0.974 | 0.953 | 1.005 | 1.027 | 1.05 |
| 2.818008610270008 | 0.995 | 0.974 | 0.953 | 1.005 | 1.026 | 1.049 |
| 2.821150202923598 | 0.995 | 0.975 | 0.954 | 1.005 | 1.026 | 1.048 |
| 2.824291795577187 | 0.995 | 0.975 | 0.955 | 1.005 | 1.025 | 1.047 |
| 2.827433388230777 | 0.995 | 0.976 | 0.956 | 1.005 | 1.025 | 1.046 |
| 2.830574980884366 | 0.995 | 0.976 | 0.957 | 1.005 | 1.024 | 1.045 |
| 2.833716573537956 | 0.995 | 0.977 | 0.958 | 1.005 | 1.024 | 1.044 |
| 2.836858166191546 | 0.995 | 0.977 | 0.959 | 1.005 | 1.023 | 1.043 |
| 2.839999758845135 | 0.996 | 0.978 | 0.959 | 1.004 | 1.023 | 1.042 |
| 2.843141351498725 | 0.996 | 0.978 | 0.96 | 1.004 | 1.022 | 1.041 |
| 2.846282944152314 | 0.996 | 0.979 | 0.961 | 1.004 | 1.022 | 1.04 |
| 2.849424536805904 | 0.996 | 0.979 | 0.962 | 1.004 | 1.021 | 1.04 |
| 2.852566129459494 | 0.996 | 0.979 | 0.963 | 1.004 | 1.021 | 1.039 |
| 2.855707722113083 | 0.996 | 0.98 | 0.964 | 1.004 | 1.02 | 1.038 |
| 2.858849314766673 | 0.996 | 0.98 | 0.964 | 1.004 | 1.02 | 1.037 |
| 2.861990907420262 | 0.996 | 0.981 | 0.965 | 1.004 | 1.02 | 1.036 |
| 2.865132500073852 | 0.996 | 0.981 | 0.966 | 1.004 | 1.019 | 1.035 |
| 2.868274092727442 | 0.996 | 0.982 | 0.967 | 1.004 | 1.019 | 1.034 |
| 2.871415685381031 | 0.996 | 0.982 | 0.967 | 1.004 | 1.018 | 1.034 |
| 2.874557278034621 | 0.997 | 0.982 | 0.968 | 1.003 | 1.018 | 1.033 |
| 2.87769887068821 | 0.997 | 0.983 | 0.969 | 1.003 | 1.017 | 1.032 |
| 2.8808404633418 | 0.997 | 0.983 | 0.97 | 1.003 | 1.017 | 1.031 |
| 2.88398205599539 | 0.997 | 0.984 | 0.97 | 1.003 | 1.017 | 1.031 |
| 2.88712364864898 | 0.997 | 0.984 | 0.971 | 1.003 | 1.016 | 1.03 |
| 2.890265241302569 | 0.997 | 0.984 | 0.972 | 1.003 | 1.016 | 1.029 |
| 2.893406833956158 | 0.997 | 0.985 | 0.972 | 1.003 | 1.015 | 1.028 |
| 2.896548426609748 | 0.997 | 0.985 | 0.973 | 1.003 | 1.015 | 1.028 |
| 2.899690019263338 | 0.997 | 0.986 | 0.974 | 1.003 | 1.015 | 1.027 |
| 2.902831611916927 | 0.997 | 0.986 | 0.975 | 1.003 | 1.014 | 1.026 |
| 2.905973204570517 | 0.997 | 0.986 | 0.975 | 1.003 | 1.014 | 1.025 |
| 2.909114797224106 | 0.997 | 0.987 | 0.976 | 1.003 | 1.014 | 1.025 |
| 2.912256389877696 | 0.997 | 0.987 | 0.976 | 1.003 | 1.013 | 1.024 |
| 2.915397982531286 | 0.997 | 0.987 | 0.977 | 1.003 | 1.013 | 1.023 |
| 2.918539575184875 | 0.998 | 0.988 | 0.978 | 1.002 | 1.012 | 1.023 |
| 2.921681167838465 | 0.998 | 0.988 | 0.978 | 1.002 | 1.012 | 1.022 |
| 2.924822760492054 | 0.998 | 0.988 | 0.979 | 1.002 | 1.012 | 1.021 |
| 2.927964353145644 | 0.998 | 0.989 | 0.98 | 1.002 | 1.011 | 1.021 |
| 2.931105945799234 | 0.998 | 0.989 | 0.98 | 1.002 | 1.011 | 1.02 |
| 2.934247538452823 | 0.998 | 0.989 | 0.981 | 1.002 | 1.011 | 1.02 |
| 2.937389131106413 | 0.998 | 0.99 | 0.981 | 1.002 | 1.01 | 1.019 |
| 2.940530723760002 | 0.998 | 0.99 | 0.982 | 1.002 | 1.01 | 1.018 |
| 2.943672316413592 | 0.998 | 0.99 | 0.982 | 1.002 | 1.01 | 1.018 |
| 2.946813909067182 | 0.998 | 0.991 | 0.983 | 1.002 | 1.009 | 1.017 |
| 2.949955501720771 | 0.998 | 0.991 | 0.984 | 1.002 | 1.009 | 1.017 |
| 2.953097094374361 | 0.998 | 0.991 | 0.984 | 1.002 | 1.009 | 1.016 |
| 2.95623868702795 | 0.998 | 0.991 | 0.985 | 1.002 | 1.009 | 1.016 |
| 2.95938027968154 | 0.998 | 0.992 | 0.985 | 1.002 | 1.008 | 1.015 |
| 2.96252187233513 | 0.998 | 0.992 | 0.986 | 1.002 | 1.008 | 1.015 |
| 2.965663464988719 | 0.998 | 0.992 | 0.986 | 1.002 | 1.008 | 1.014 |
| 2.968805057642309 | 0.999 | 0.993 | 0.987 | 1.001 | 1.007 | 1.014 |
| 2.971946650295898 | 0.999 | 0.993 | 0.987 | 1.001 | 1.007 | 1.013 |
| 2.975088242949488 | 0.999 | 0.993 | 0.988 | 1.001 | 1.007 | 1.013 |
| 2.978229835603078 | 0.999 | 0.993 | 0.988 | 1.001 | 1.007 | 1.012 |
| 2.981371428256667 | 0.999 | 0.994 | 0.988 | 1.001 | 1.006 | 1.012 |
| 2.984513020910257 | 0.999 | 0.994 | 0.989 | 1.001 | 1.006 | 1.011 |
| 2.987654613563846 | 0.999 | 0.994 | 0.989 | 1.001 | 1.006 | 1.011 |
| 2.990796206217436 | 0.999 | 0.994 | 0.99 | 1.001 | 1.006 | 1.01 |
| 2.993937798871025 | 0.999 | 0.995 | 0.99 | 1.001 | 1.005 | 1.01 |
| 2.997079391524615 | 0.999 | 0.995 | 0.991 | 1.001 | 1.005 | 1.009 |
| 3.000220984178205 | 0.999 | 0.995 | 0.991 | 1.001 | 1.005 | 1.009 |
| 3.003362576831794 | 0.999 | 0.995 | 0.991 | 1.001 | 1.005 | 1.009 |
| 3.006504169485384 | 0.999 | 0.995 | 0.992 | 1.001 | 1.005 | 1.008 |
| 3.009645762138974 | 0.999 | 0.996 | 0.992 | 1.001 | 1.004 | 1.008 |
| 3.012787354792563 | 0.999 | 0.996 | 0.993 | 1.001 | 1.004 | 1.008 |
| 3.015928947446153 | 0.999 | 0.996 | 0.993 | 1.001 | 1.004 | 1.007 |
| 3.019070540099742 | 0.999 | 0.996 | 0.993 | 1.001 | 1.004 | 1.007 |
| 3.022212132753332 | 0.999 | 0.996 | 0.994 | 1.001 | 1.004 | 1.006 |
| 3.025353725406922 | 0.999 | 0.997 | 0.994 | 1.001 | 1.003 | 1.006 |
| 3.028495318060511 | 0.999 | 0.997 | 0.994 | 1.001 | 1.003 | 1.006 |
| 3.031636910714101 | 0.999 | 0.997 | 0.995 | 1.001 | 1.003 | 1.005 |
| 3.03477850336769 | 0.999 | 0.997 | 0.995 | 1.001 | 1.003 | 1.005 |
| 3.03792009602128 | 0.999 | 0.997 | 0.995 | 1.001 | 1.003 | 1.005 |
| 3.04106168867487 | 0.999 | 0.997 | 0.995 | 1.001 | 1.003 | 1.005 |
| 3.04420328132846 | 1 | 0.998 | 0.996 | 1 | 1.002 | 1.004 |
| 3.047344873982049 | 1 | 0.998 | 0.996 | 1 | 1.002 | 1.004 |
| 3.050486466635638 | 1 | 0.998 | 0.996 | 1 | 1.002 | 1.004 |
| 3.053628059289228 | 1 | 0.998 | 0.997 | 1 | 1.002 | 1.003 |
| 3.056769651942818 | 1 | 0.998 | 0.997 | 1 | 1.002 | 1.003 |
| 3.059911244596407 | 1 | 0.998 | 0.997 | 1 | 1.002 | 1.003 |
| 3.063052837249997 | 1 | 0.998 | 0.997 | 1 | 1.002 | 1.003 |
| 3.066194429903586 | 1 | 0.999 | 0.997 | 1 | 1.001 | 1.003 |
| 3.069336022557176 | 1 | 0.999 | 0.998 | 1 | 1.001 | 1.002 |
| 3.072477615210766 | 1 | 0.999 | 0.998 | 1 | 1.001 | 1.002 |
| 3.075619207864355 | 1 | 0.999 | 0.998 | 1 | 1.001 | 1.002 |
| 3.078760800517945 | 1 | 0.999 | 0.998 | 1 | 1.001 | 1.002 |
| 3.081902393171534 | 1 | 0.999 | 0.998 | 1 | 1.001 | 1.002 |
| 3.085043985825124 | 1 | 0.999 | 0.999 | 1 | 1.001 | 1.001 |
| 3.088185578478713 | 1 | 0.999 | 0.999 | 1 | 1.001 | 1.001 |
| 3.091327171132303 | 1 | 0.999 | 0.999 | 1 | 1.001 | 1.001 |
| 3.094468763785893 | 1 | 0.999 | 0.999 | 1 | 1.001 | 1.001 |
| 3.097610356439482 | 1 | 1 | 0.999 | 1 | 1 | 1.001 |
| 3.100751949093072 | 1 | 1 | 0.999 | 1 | 1 | 1.001 |
| 3.103893541746661 | 1 | 1 | 0.999 | 1 | 1 | 1.001 |
| 3.107035134400251 | 1 | 1 | 0.999 | 1 | 1 | 1.001 |
| 3.110176727053841 | 1 | 1 | 1 | 1 | 1 | 1 |
| 3.11331831970743 | 1 | 1 | 1 | 1 | 1 | 1 |
| 3.11645991236102 | 1 | 1 | 1 | 1 | 1 | 1 |
| 3.11960150501461 | 1 | 1 | 1 | 1 | 1 | 1 |
| 3.122743097668199 | 1 | 1 | 1 | 1 | 1 | 1 |
| 3.125884690321789 | 1 | 1 | 1 | 1 | 1 | 1 |
| 3.129026282975378 | 1 | 1 | 1 | 1 | 1 | 1 |
| 3.132167875628968 | 1 | 1 | 1 | 1 | 1 | 1 |
| 3.135309468282557 | 1 | 1 | 1 | 1 | 1 | 1 |
| 3.138451060936147 | 1 | 1 | 1 | 1 | 1 | 1 |
| 3.141592653589737 | 1 | 1 | 1 | 1 | 1 | 1 |
| 3.144734246243326 | 1 | 1 | 1 | 1 | 1 | 1 |
| 3.147875838896916 | 1 | 1 | 1 | 1 | 1 | 1 |
| 3.151017431550505 | 1 | 1 | 1 | 1 | 1 | 1 |
| 3.154159024204095 | 1 | 1 | 1 | 1 | 1 | 1 |
| 3.157300616857685 | 1 | 1 | 1 | 1 | 1 | 1 |
| 3.160442209511274 | 1 | 1 | 1 | 1 | 1 | 1 |
| 3.163583802164864 | 1 | 1 | 1 | 1 | 1 | 1 |
| 3.166725394818453 | 1 | 1 | 1 | 1 | 1 | 1 |
| 3.169866987472043 | 1 | 1 | 1 | 1 | 1 | 1 |
| 3.173008580125633 | 1 | 1 | 1 | 1 | 1 | 1 |
| 3.176150172779222 | 1 | 1 | 0.999 | 1 | 1 | 1.001 |
| 3.179291765432812 | 1 | 1 | 0.999 | 1 | 1 | 1.001 |
| 3.182433358086401 | 1 | 1 | 0.999 | 1 | 1 | 1.001 |
| 3.185574950739991 | 1 | 1 | 0.999 | 1 | 1 | 1.001 |
| 3.188716543393581 | 1 | 0.999 | 0.999 | 1 | 1.001 | 1.001 |
| 3.19185813604717 | 1 | 0.999 | 0.999 | 1 | 1.001 | 1.001 |
| 3.19499972870076 | 1 | 0.999 | 0.999 | 1 | 1.001 | 1.001 |
| 3.198141321354349 | 1 | 0.999 | 0.999 | 1 | 1.001 | 1.001 |
| 3.20128291400794 | 1 | 0.999 | 0.998 | 1 | 1.001 | 1.002 |
| 3.204424506661528 | 1 | 0.999 | 0.998 | 1 | 1.001 | 1.002 |
| 3.207566099315118 | 1 | 0.999 | 0.998 | 1 | 1.001 | 1.002 |
| 3.210707691968708 | 1 | 0.999 | 0.998 | 1 | 1.001 | 1.002 |
| 3.213849284622297 | 1 | 0.999 | 0.998 | 1 | 1.001 | 1.002 |
| 3.216990877275887 | 1 | 0.999 | 0.997 | 1 | 1.001 | 1.003 |
| 3.220132469929476 | 1 | 0.998 | 0.997 | 1 | 1.002 | 1.003 |
| 3.223274062583066 | 1 | 0.998 | 0.997 | 1 | 1.002 | 1.003 |
| 3.226415655236656 | 1 | 0.998 | 0.997 | 1 | 1.002 | 1.003 |
| 3.229557247890245 | 1 | 0.998 | 0.997 | 1 | 1.002 | 1.003 |
| 3.232698840543835 | 1 | 0.998 | 0.996 | 1 | 1.002 | 1.004 |
| 3.235840433197425 | 1 | 0.998 | 0.996 | 1 | 1.002 | 1.004 |
| 3.238982025851014 | 1 | 0.998 | 0.996 | 1 | 1.002 | 1.004 |
| 3.242123618504604 | 0.999 | 0.997 | 0.995 | 1.001 | 1.003 | 1.005 |
| 3.245265211158193 | 0.999 | 0.997 | 0.995 | 1.001 | 1.003 | 1.005 |
| 3.248406803811783 | 0.999 | 0.997 | 0.995 | 1.001 | 1.003 | 1.005 |
| 3.251548396465373 | 0.999 | 0.997 | 0.995 | 1.001 | 1.003 | 1.005 |
| 3.254689989118962 | 0.999 | 0.997 | 0.994 | 1.001 | 1.003 | 1.006 |
| 3.257831581772551 | 0.999 | 0.997 | 0.994 | 1.001 | 1.003 | 1.006 |
| 3.260973174426141 | 0.999 | 0.996 | 0.994 | 1.001 | 1.004 | 1.006 |
| 3.26411476707973 | 0.999 | 0.996 | 0.993 | 1.001 | 1.004 | 1.007 |
| 3.267256359733321 | 0.999 | 0.996 | 0.993 | 1.001 | 1.004 | 1.007 |
| 3.27039795238691 | 0.999 | 0.996 | 0.993 | 1.001 | 1.004 | 1.008 |
| 3.2735395450405 | 0.999 | 0.996 | 0.992 | 1.001 | 1.004 | 1.008 |
| 3.276681137694089 | 0.999 | 0.995 | 0.992 | 1.001 | 1.005 | 1.008 |
| 3.279822730347679 | 0.999 | 0.995 | 0.991 | 1.001 | 1.005 | 1.009 |
| 3.282964323001269 | 0.999 | 0.995 | 0.991 | 1.001 | 1.005 | 1.009 |
| 3.286105915654858 | 0.999 | 0.995 | 0.991 | 1.001 | 1.005 | 1.009 |
| 3.289247508308448 | 0.999 | 0.995 | 0.99 | 1.001 | 1.005 | 1.01 |
| 3.292389100962037 | 0.999 | 0.994 | 0.99 | 1.001 | 1.006 | 1.01 |
| 3.295530693615627 | 0.999 | 0.994 | 0.989 | 1.001 | 1.006 | 1.011 |
| 3.298672286269217 | 0.999 | 0.994 | 0.989 | 1.001 | 1.006 | 1.011 |
| 3.301813878922806 | 0.999 | 0.994 | 0.988 | 1.001 | 1.006 | 1.012 |
| 3.304955471576396 | 0.999 | 0.993 | 0.988 | 1.001 | 1.007 | 1.012 |
| 3.308097064229985 | 0.999 | 0.993 | 0.988 | 1.001 | 1.007 | 1.013 |
| 3.311238656883575 | 0.999 | 0.993 | 0.987 | 1.001 | 1.007 | 1.013 |
| 3.314380249537165 | 0.999 | 0.993 | 0.987 | 1.001 | 1.007 | 1.014 |
| 3.317521842190754 | 0.998 | 0.992 | 0.986 | 1.002 | 1.008 | 1.014 |
| 3.320663434844344 | 0.998 | 0.992 | 0.986 | 1.002 | 1.008 | 1.015 |
| 3.323805027497933 | 0.998 | 0.992 | 0.985 | 1.002 | 1.008 | 1.015 |
| 3.326946620151523 | 0.998 | 0.991 | 0.985 | 1.002 | 1.009 | 1.016 |
| 3.330088212805113 | 0.998 | 0.991 | 0.984 | 1.002 | 1.009 | 1.016 |
| 3.333229805458702 | 0.998 | 0.991 | 0.984 | 1.002 | 1.009 | 1.017 |
| 3.336371398112292 | 0.998 | 0.991 | 0.983 | 1.002 | 1.009 | 1.017 |
| 3.339512990765881 | 0.998 | 0.99 | 0.982 | 1.002 | 1.01 | 1.018 |
| 3.342654583419471 | 0.998 | 0.99 | 0.982 | 1.002 | 1.01 | 1.018 |
| 3.345796176073061 | 0.998 | 0.99 | 0.981 | 1.002 | 1.01 | 1.019 |
| 3.34893776872665 | 0.998 | 0.989 | 0.981 | 1.002 | 1.011 | 1.02 |
| 3.35207936138024 | 0.998 | 0.989 | 0.98 | 1.002 | 1.011 | 1.02 |
| 3.355220954033829 | 0.998 | 0.989 | 0.98 | 1.002 | 1.011 | 1.021 |
| 3.358362546687419 | 0.998 | 0.988 | 0.979 | 1.002 | 1.012 | 1.021 |
| 3.361504139341009 | 0.998 | 0.988 | 0.978 | 1.002 | 1.012 | 1.022 |
| 3.364645731994598 | 0.998 | 0.988 | 0.978 | 1.002 | 1.012 | 1.023 |
| 3.367787324648188 | 0.997 | 0.987 | 0.977 | 1.003 | 1.013 | 1.023 |
| 3.370928917301777 | 0.997 | 0.987 | 0.976 | 1.003 | 1.013 | 1.024 |
| 3.374070509955367 | 0.997 | 0.987 | 0.976 | 1.003 | 1.014 | 1.025 |
| 3.377212102608956 | 0.997 | 0.986 | 0.975 | 1.003 | 1.014 | 1.025 |
| 3.380353695262546 | 0.997 | 0.986 | 0.975 | 1.003 | 1.014 | 1.026 |
| 3.383495287916136 | 0.997 | 0.986 | 0.974 | 1.003 | 1.015 | 1.027 |
| 3.386636880569725 | 0.997 | 0.985 | 0.973 | 1.003 | 1.015 | 1.028 |
| 3.389778473223315 | 0.997 | 0.985 | 0.972 | 1.003 | 1.015 | 1.028 |
| 3.392920065876904 | 0.997 | 0.984 | 0.972 | 1.003 | 1.016 | 1.029 |
| 3.396061658530494 | 0.997 | 0.984 | 0.971 | 1.003 | 1.016 | 1.03 |
| 3.399203251184084 | 0.997 | 0.984 | 0.97 | 1.003 | 1.017 | 1.031 |
| 3.402344843837673 | 0.997 | 0.983 | 0.97 | 1.003 | 1.017 | 1.031 |
| 3.405486436491263 | 0.997 | 0.983 | 0.969 | 1.003 | 1.017 | 1.032 |
| 3.408628029144852 | 0.997 | 0.982 | 0.968 | 1.003 | 1.018 | 1.033 |
| 3.411769621798442 | 0.996 | 0.982 | 0.967 | 1.004 | 1.018 | 1.034 |
| 3.414911214452032 | 0.996 | 0.982 | 0.967 | 1.004 | 1.019 | 1.034 |
| 3.418052807105621 | 0.996 | 0.981 | 0.966 | 1.004 | 1.019 | 1.035 |
| 3.421194399759211 | 0.996 | 0.981 | 0.965 | 1.004 | 1.02 | 1.036 |
| 3.4243359924128 | 0.996 | 0.98 | 0.964 | 1.004 | 1.02 | 1.037 |
| 3.42747758506639 | 0.996 | 0.98 | 0.964 | 1.004 | 1.02 | 1.038 |
| 3.43061917771998 | 0.996 | 0.979 | 0.963 | 1.004 | 1.021 | 1.039 |
| 3.433760770373569 | 0.996 | 0.979 | 0.962 | 1.004 | 1.021 | 1.04 |
| 3.436902363027159 | 0.996 | 0.979 | 0.961 | 1.004 | 1.022 | 1.04 |
| 3.440043955680748 | 0.996 | 0.978 | 0.96 | 1.004 | 1.022 | 1.041 |
| 3.443185548334338 | 0.996 | 0.978 | 0.959 | 1.004 | 1.023 | 1.042 |
| 3.446327140987927 | 0.995 | 0.977 | 0.959 | 1.005 | 1.023 | 1.043 |
| 3.449468733641517 | 0.995 | 0.977 | 0.958 | 1.005 | 1.024 | 1.044 |
| 3.452610326295107 | 0.995 | 0.976 | 0.957 | 1.005 | 1.024 | 1.045 |
| 3.455751918948696 | 0.995 | 0.976 | 0.956 | 1.005 | 1.025 | 1.046 |
| 3.458893511602286 | 0.995 | 0.975 | 0.955 | 1.005 | 1.025 | 1.047 |
| 3.462035104255876 | 0.995 | 0.975 | 0.954 | 1.005 | 1.026 | 1.048 |
| 3.465176696909465 | 0.995 | 0.974 | 0.953 | 1.005 | 1.026 | 1.049 |
| 3.468318289563055 | 0.995 | 0.974 | 0.953 | 1.005 | 1.027 | 1.05 |
| 3.471459882216644 | 0.995 | 0.973 | 0.952 | 1.005 | 1.027 | 1.051 |
| 3.474601474870234 | 0.995 | 0.973 | 0.951 | 1.005 | 1.028 | 1.052 |
| 3.477743067523824 | 0.995 | 0.972 | 0.95 | 1.005 | 1.028 | 1.053 |
| 3.480884660177413 | 0.994 | 0.972 | 0.949 | 1.006 | 1.029 | 1.054 |
| 3.484026252831002 | 0.994 | 0.971 | 0.948 | 1.006 | 1.029 | 1.055 |
| 3.487167845484592 | 0.994 | 0.971 | 0.947 | 1.006 | 1.03 | 1.056 |
| 3.490309438138182 | 0.994 | 0.97 | 0.946 | 1.006 | 1.031 | 1.057 |
| 3.493451030791772 | 0.994 | 0.97 | 0.945 | 1.006 | 1.031 | 1.058 |
| 3.496592623445361 | 0.994 | 0.969 | 0.944 | 1.006 | 1.032 | 1.059 |
| 3.499734216098951 | 0.994 | 0.969 | 0.943 | 1.006 | 1.032 | 1.06 |
| 3.50287580875254 | 0.994 | 0.968 | 0.942 | 1.006 | 1.033 | 1.061 |
| 3.50601740140613 | 0.994 | 0.968 | 0.941 | 1.006 | 1.033 | 1.063 |
| 3.50915899405972 | 0.994 | 0.967 | 0.94 | 1.007 | 1.034 | 1.064 |
| 3.512300586713309 | 0.993 | 0.967 | 0.939 | 1.007 | 1.035 | 1.065 |
| 3.515442179366899 | 0.993 | 0.966 | 0.938 | 1.007 | 1.035 | 1.066 |
| 3.518583772020488 | 0.993 | 0.966 | 0.937 | 1.007 | 1.036 | 1.067 |
| 3.521725364674078 | 0.993 | 0.965 | 0.936 | 1.007 | 1.036 | 1.068 |
| 3.524866957327668 | 0.993 | 0.964 | 0.935 | 1.007 | 1.037 | 1.07 |
| 3.528008549981257 | 0.993 | 0.964 | 0.934 | 1.007 | 1.038 | 1.071 |
| 3.531150142634847 | 0.993 | 0.963 | 0.933 | 1.007 | 1.038 | 1.072 |
| 3.534291735288436 | 0.993 | 0.963 | 0.932 | 1.007 | 1.039 | 1.073 |
| 3.537433327942026 | 0.993 | 0.962 | 0.931 | 1.008 | 1.039 | 1.074 |
| 3.540574920595616 | 0.992 | 0.962 | 0.93 | 1.008 | 1.04 | 1.076 |
| 3.543716513249205 | 0.992 | 0.961 | 0.929 | 1.008 | 1.041 | 1.077 |
| 3.546858105902795 | 0.992 | 0.96 | 0.927 | 1.008 | 1.041 | 1.078 |
| 3.549999698556384 | 0.992 | 0.96 | 0.926 | 1.008 | 1.042 | 1.08 |
| 3.553141291209974 | 0.992 | 0.959 | 0.925 | 1.008 | 1.043 | 1.081 |
| 3.556282883863564 | 0.992 | 0.959 | 0.924 | 1.008 | 1.043 | 1.082 |
| 3.559424476517153 | 0.992 | 0.958 | 0.923 | 1.008 | 1.044 | 1.084 |
| 3.562566069170743 | 0.992 | 0.957 | 0.922 | 1.008 | 1.045 | 1.085 |
| 3.565707661824332 | 0.991 | 0.957 | 0.921 | 1.009 | 1.045 | 1.086 |
| 3.568849254477922 | 0.991 | 0.956 | 0.919 | 1.009 | 1.046 | 1.088 |
| 3.571990847131511 | 0.991 | 0.955 | 0.918 | 1.009 | 1.047 | 1.089 |
| 3.575132439785101 | 0.991 | 0.955 | 0.917 | 1.009 | 1.047 | 1.09 |
| 3.578274032438691 | 0.991 | 0.954 | 0.916 | 1.009 | 1.048 | 1.092 |
| 3.58141562509228 | 0.991 | 0.954 | 0.915 | 1.009 | 1.049 | 1.093 |
| 3.58455721774587 | 0.991 | 0.953 | 0.914 | 1.009 | 1.049 | 1.095 |
| 3.58769881039946 | 0.991 | 0.952 | 0.912 | 1.009 | 1.05 | 1.096 |
| 3.590840403053049 | 0.991 | 0.952 | 0.911 | 1.01 | 1.051 | 1.097 |
| 3.593981995706639 | 0.99 | 0.951 | 0.91 | 1.01 | 1.051 | 1.099 |
| 3.597123588360228 | 0.99 | 0.95 | 0.909 | 1.01 | 1.052 | 1.1 |
| 3.600265181013818 | 0.99 | 0.95 | 0.908 | 1.01 | 1.053 | 1.102 |
| 3.603406773667407 | 0.99 | 0.949 | 0.906 | 1.01 | 1.054 | 1.103 |
| 3.606548366320997 | 0.99 | 0.948 | 0.905 | 1.01 | 1.054 | 1.105 |
| 3.609689958974587 | 0.99 | 0.948 | 0.904 | 1.01 | 1.055 | 1.106 |
| 3.612831551628176 | 0.99 | 0.947 | 0.902 | 1.01 | 1.056 | 1.108 |
| 3.615973144281766 | 0.99 | 0.946 | 0.901 | 1.011 | 1.057 | 1.11 |
| 3.619114736935355 | 0.989 | 0.946 | 0.9 | 1.011 | 1.057 | 1.111 |
| 3.622256329588945 | 0.989 | 0.945 | 0.899 | 1.011 | 1.058 | 1.113 |
| 3.625397922242534 | 0.989 | 0.944 | 0.897 | 1.011 | 1.059 | 1.114 |
| 3.628539514896124 | 0.989 | 0.944 | 0.896 | 1.011 | 1.06 | 1.116 |
| 3.631681107549714 | 0.989 | 0.943 | 0.895 | 1.011 | 1.06 | 1.118 |
| 3.634822700203303 | 0.989 | 0.942 | 0.893 | 1.011 | 1.061 | 1.119 |
| 3.637964292856893 | 0.989 | 0.942 | 0.892 | 1.012 | 1.062 | 1.121 |
| 3.641105885510483 | 0.988 | 0.941 | 0.891 | 1.012 | 1.063 | 1.123 |
| 3.644247478164072 | 0.988 | 0.94 | 0.889 | 1.012 | 1.064 | 1.124 |
| 3.647389070817662 | 0.988 | 0.939 | 0.888 | 1.012 | 1.064 | 1.126 |
| 3.650530663471251 | 0.988 | 0.939 | 0.887 | 1.012 | 1.065 | 1.128 |
| 3.653672256124841 | 0.988 | 0.938 | 0.885 | 1.012 | 1.066 | 1.129 |
| 3.656813848778431 | 0.988 | 0.937 | 0.884 | 1.012 | 1.067 | 1.131 |
| 3.65995544143202 | 0.988 | 0.937 | 0.883 | 1.013 | 1.068 | 1.133 |
| 3.66309703408561 | 0.988 | 0.936 | 0.881 | 1.013 | 1.068 | 1.135 |
| 3.666238626739199 | 0.987 | 0.935 | 0.88 | 1.013 | 1.069 | 1.137 |
| 3.66938021939279 | 0.987 | 0.934 | 0.878 | 1.013 | 1.07 | 1.138 |
| 3.672521812046378 | 0.987 | 0.934 | 0.877 | 1.013 | 1.071 | 1.14 |
| 3.675663404699968 | 0.987 | 0.933 | 0.876 | 1.013 | 1.072 | 1.142 |
| 3.678804997353558 | 0.987 | 0.932 | 0.874 | 1.013 | 1.073 | 1.144 |
| 3.681946590007147 | 0.987 | 0.931 | 0.873 | 1.014 | 1.074 | 1.146 |
| 3.685088182660737 | 0.987 | 0.931 | 0.871 | 1.014 | 1.074 | 1.148 |
| 3.688229775314326 | 0.986 | 0.93 | 0.87 | 1.014 | 1.075 | 1.149 |
| 3.691371367967916 | 0.986 | 0.929 | 0.869 | 1.014 | 1.076 | 1.151 |
| 3.694512960621506 | 0.986 | 0.928 | 0.867 | 1.014 | 1.077 | 1.153 |
| 3.697654553275095 | 0.986 | 0.928 | 0.866 | 1.014 | 1.078 | 1.155 |
| 3.700796145928685 | 0.986 | 0.927 | 0.864 | 1.014 | 1.079 | 1.157 |
| 3.703937738582274 | 0.986 | 0.926 | 0.863 | 1.015 | 1.08 | 1.159 |
| 3.707079331235864 | 0.986 | 0.925 | 0.861 | 1.015 | 1.081 | 1.161 |
| 3.710220923889454 | 0.985 | 0.925 | 0.86 | 1.015 | 1.081 | 1.163 |
| 3.713362516543043 | 0.985 | 0.924 | 0.858 | 1.015 | 1.082 | 1.165 |
| 3.716504109196633 | 0.985 | 0.923 | 0.857 | 1.015 | 1.083 | 1.167 |
| 3.719645701850223 | 0.985 | 0.922 | 0.855 | 1.015 | 1.084 | 1.169 |
| 3.722787294503812 | 0.985 | 0.922 | 0.854 | 1.015 | 1.085 | 1.171 |
| 3.725928887157402 | 0.985 | 0.921 | 0.852 | 1.016 | 1.086 | 1.174 |
| 3.729070479810991 | 0.985 | 0.92 | 0.851 | 1.016 | 1.087 | 1.176 |
| 3.732212072464581 | 0.984 | 0.919 | 0.849 | 1.016 | 1.088 | 1.178 |
| 3.735353665118171 | 0.984 | 0.918 | 0.848 | 1.016 | 1.089 | 1.18 |
| 3.73849525777176 | 0.984 | 0.918 | 0.846 | 1.016 | 1.09 | 1.182 |
| 3.74163685042535 | 0.984 | 0.917 | 0.844 | 1.016 | 1.091 | 1.184 |
| 3.744778443078939 | 0.984 | 0.916 | 0.843 | 1.016 | 1.092 | 1.186 |
| 3.747920035732529 | 0.984 | 0.915 | 0.841 | 1.017 | 1.093 | 1.189 |
| 3.751061628386119 | 0.983 | 0.914 | 0.84 | 1.017 | 1.094 | 1.191 |
| 3.754203221039708 | 0.983 | 0.914 | 0.838 | 1.017 | 1.095 | 1.193 |
| 3.757344813693298 | 0.983 | 0.913 | 0.837 | 1.017 | 1.096 | 1.195 |
| 3.760486406346887 | 0.983 | 0.912 | 0.835 | 1.017 | 1.097 | 1.198 |
| 3.763627999000477 | 0.983 | 0.911 | 0.833 | 1.017 | 1.097 | 1.2 |
| 3.766769591654067 | 0.983 | 0.91 | 0.832 | 1.018 | 1.098 | 1.202 |
| 3.769911184307656 | 0.983 | 0.91 | 0.83 | 1.018 | 1.099 | 1.205 |
| 3.773052776961246 | 0.982 | 0.909 | 0.828 | 1.018 | 1.1 | 1.207 |
| 3.776194369614835 | 0.982 | 0.908 | 0.827 | 1.018 | 1.101 | 1.209 |
| 3.779335962268425 | 0.982 | 0.907 | 0.825 | 1.018 | 1.102 | 1.212 |
| 3.782477554922014 | 0.982 | 0.906 | 0.824 | 1.018 | 1.103 | 1.214 |
| 3.785619147575604 | 0.982 | 0.905 | 0.822 | 1.019 | 1.104 | 1.217 |
| 3.788760740229193 | 0.982 | 0.905 | 0.82 | 1.019 | 1.106 | 1.219 |
| 3.791902332882783 | 0.982 | 0.904 | 0.819 | 1.019 | 1.107 | 1.222 |
| 3.795043925536373 | 0.981 | 0.903 | 0.817 | 1.019 | 1.108 | 1.224 |
| 3.798185518189962 | 0.981 | 0.902 | 0.815 | 1.019 | 1.109 | 1.227 |
| 3.801327110843552 | 0.981 | 0.901 | 0.814 | 1.019 | 1.11 | 1.229 |
| 3.804468703497142 | 0.981 | 0.9 | 0.812 | 1.019 | 1.111 | 1.232 |
| 3.807610296150731 | 0.981 | 0.9 | 0.81 | 1.02 | 1.112 | 1.234 |
| 3.810751888804321 | 0.981 | 0.899 | 0.809 | 1.02 | 1.113 | 1.237 |
| 3.813893481457911 | 0.98 | 0.898 | 0.807 | 1.02 | 1.114 | 1.239 |
| 3.8170350741115 | 0.98 | 0.897 | 0.805 | 1.02 | 1.115 | 1.242 |
| 3.82017666676509 | 0.98 | 0.896 | 0.803 | 1.02 | 1.116 | 1.245 |
| 3.823318259418679 | 0.98 | 0.895 | 0.802 | 1.02 | 1.117 | 1.247 |
| 3.826459852072269 | 0.98 | 0.894 | 0.8 | 1.021 | 1.118 | 1.25 |
| 3.829601444725859 | 0.98 | 0.894 | 0.798 | 1.021 | 1.119 | 1.253 |
| 3.832743037379448 | 0.979 | 0.893 | 0.796 | 1.021 | 1.12 | 1.256 |
| 3.835884630033038 | 0.979 | 0.892 | 0.795 | 1.021 | 1.121 | 1.258 |
| 3.839026222686627 | 0.979 | 0.891 | 0.793 | 1.021 | 1.122 | 1.261 |
| 3.842167815340217 | 0.979 | 0.89 | 0.791 | 1.021 | 1.124 | 1.264 |
| 3.845309407993807 | 0.979 | 0.889 | 0.789 | 1.022 | 1.125 | 1.267 |
| 3.848451000647396 | 0.979 | 0.888 | 0.788 | 1.022 | 1.126 | 1.27 |
| 3.851592593300986 | 0.979 | 0.887 | 0.786 | 1.022 | 1.127 | 1.272 |
| 3.854734185954575 | 0.978 | 0.887 | 0.784 | 1.022 | 1.128 | 1.275 |
| 3.857875778608165 | 0.978 | 0.886 | 0.782 | 1.022 | 1.129 | 1.278 |
| 3.861017371261755 | 0.978 | 0.885 | 0.781 | 1.022 | 1.13 | 1.281 |
| 3.864158963915344 | 0.978 | 0.884 | 0.779 | 1.023 | 1.131 | 1.284 |
| 3.867300556568933 | 0.978 | 0.883 | 0.777 | 1.023 | 1.132 | 1.287 |
| 3.870442149222523 | 0.978 | 0.882 | 0.775 | 1.023 | 1.134 | 1.29 |
| 3.873583741876112 | 0.977 | 0.881 | 0.773 | 1.023 | 1.135 | 1.293 |
| 3.876725334529703 | 0.977 | 0.88 | 0.771 | 1.023 | 1.136 | 1.296 |
| 3.879866927183292 | 0.977 | 0.88 | 0.77 | 1.023 | 1.137 | 1.299 |
| 3.883008519836882 | 0.977 | 0.879 | 0.768 | 1.024 | 1.138 | 1.302 |
| 3.886150112490471 | 0.977 | 0.878 | 0.766 | 1.024 | 1.139 | 1.306 |
| 3.889291705144061 | 0.977 | 0.877 | 0.764 | 1.024 | 1.14 | 1.309 |
| 3.892433297797651 | 0.976 | 0.876 | 0.762 | 1.024 | 1.142 | 1.312 |
| 3.89557489045124 | 0.976 | 0.875 | 0.76 | 1.024 | 1.143 | 1.315 |
| 3.89871648310483 | 0.976 | 0.874 | 0.759 | 1.024 | 1.144 | 1.318 |
| 3.901858075758419 | 0.976 | 0.873 | 0.757 | 1.025 | 1.145 | 1.322 |
| 3.904999668412009 | 0.976 | 0.872 | 0.755 | 1.025 | 1.146 | 1.325 |
| 3.908141261065598 | 0.976 | 0.871 | 0.753 | 1.025 | 1.148 | 1.328 |
| 3.911282853719188 | 0.975 | 0.871 | 0.751 | 1.025 | 1.149 | 1.331 |
| 3.914424446372778 | 0.975 | 0.87 | 0.749 | 1.025 | 1.15 | 1.335 |
| 3.917566039026367 | 0.975 | 0.869 | 0.747 | 1.025 | 1.151 | 1.338 |
| 3.920707631679957 | 0.975 | 0.868 | 0.745 | 1.026 | 1.152 | 1.342 |
| 3.923849224333547 | 0.975 | 0.867 | 0.744 | 1.026 | 1.153 | 1.345 |
| 3.926990816987136 | 0.975 | 0.866 | 0.742 | 1.026 | 1.155 | 1.348 |
| 3.930132409640726 | 0.975 | 0.865 | 0.74 | 1.026 | 1.156 | 1.352 |
| 3.933274002294315 | 0.974 | 0.864 | 0.738 | 1.026 | 1.157 | 1.355 |
| 3.936415594947905 | 0.974 | 0.863 | 0.736 | 1.026 | 1.158 | 1.359 |
| 3.939557187601495 | 0.974 | 0.862 | 0.734 | 1.027 | 1.16 | 1.362 |
| 3.942698780255084 | 0.974 | 0.861 | 0.732 | 1.027 | 1.161 | 1.366 |
| 3.945840372908674 | 0.974 | 0.861 | 0.73 | 1.027 | 1.162 | 1.37 |
| 3.948981965562263 | 0.974 | 0.86 | 0.728 | 1.027 | 1.163 | 1.373 |
| 3.952123558215853 | 0.973 | 0.859 | 0.726 | 1.027 | 1.164 | 1.377 |
| 3.955265150869442 | 0.973 | 0.858 | 0.724 | 1.028 | 1.166 | 1.381 |
| 3.958406743523032 | 0.973 | 0.857 | 0.722 | 1.028 | 1.167 | 1.384 |
| 3.961548336176622 | 0.973 | 0.856 | 0.72 | 1.028 | 1.168 | 1.388 |
| 3.964689928830211 | 0.973 | 0.855 | 0.718 | 1.028 | 1.169 | 1.392 |
| 3.967831521483801 | 0.973 | 0.854 | 0.716 | 1.028 | 1.171 | 1.396 |
| 3.97097311413739 | 0.972 | 0.853 | 0.714 | 1.028 | 1.172 | 1.4 |
| 3.97411470679098 | 0.972 | 0.852 | 0.712 | 1.029 | 1.173 | 1.404 |
| 3.97725629944457 | 0.972 | 0.851 | 0.711 | 1.029 | 1.175 | 1.407 |
| 3.98039789209816 | 0.972 | 0.85 | 0.709 | 1.029 | 1.176 | 1.411 |
| 3.983539484751749 | 0.972 | 0.85 | 0.707 | 1.029 | 1.177 | 1.415 |
| 3.986681077405338 | 0.972 | 0.849 | 0.705 | 1.029 | 1.178 | 1.419 |
| 3.989822670058928 | 0.971 | 0.848 | 0.703 | 1.029 | 1.18 | 1.423 |
| 3.992964262712517 | 0.971 | 0.847 | 0.701 | 1.03 | 1.181 | 1.427 |
| 3.996105855366107 | 0.971 | 0.846 | 0.699 | 1.03 | 1.182 | 1.432 |
| 3.999247448019697 | 0.971 | 0.845 | 0.697 | 1.03 | 1.183 | 1.436 |
| 4.002389040673287 | 0.971 | 0.844 | 0.695 | 1.03 | 1.185 | 1.44 |
| 4.005530633326877 | 0.971 | 0.843 | 0.693 | 1.03 | 1.186 | 1.444 |
| 4.008672225980466 | 0.97 | 0.842 | 0.691 | 1.03 | 1.187 | 1.448 |
| 4.011813818634056 | 0.97 | 0.841 | 0.688 | 1.031 | 1.189 | 1.452 |
| 4.014955411287645 | 0.97 | 0.84 | 0.686 | 1.031 | 1.19 | 1.457 |
| 4.018097003941234 | 0.97 | 0.839 | 0.684 | 1.031 | 1.191 | 1.461 |
| 4.021238596594824 | 0.97 | 0.839 | 0.682 | 1.031 | 1.193 | 1.465 |
| 4.024380189248414 | 0.97 | 0.838 | 0.68 | 1.031 | 1.194 | 1.47 |
| 4.027521781902004 | 0.97 | 0.837 | 0.678 | 1.031 | 1.195 | 1.474 |
| 4.030663374555593 | 0.969 | 0.836 | 0.676 | 1.032 | 1.196 | 1.479 |
| 4.033804967209183 | 0.969 | 0.835 | 0.674 | 1.032 | 1.198 | 1.483 |
| 4.036946559862773 | 0.969 | 0.834 | 0.672 | 1.032 | 1.199 | 1.488 |
| 4.040088152516362 | 0.969 | 0.833 | 0.67 | 1.032 | 1.2 | 1.492 |
| 4.043229745169951 | 0.969 | 0.832 | 0.668 | 1.032 | 1.202 | 1.497 |
| 4.046371337823541 | 0.969 | 0.831 | 0.666 | 1.032 | 1.203 | 1.501 |
| 4.049512930477131 | 0.968 | 0.83 | 0.664 | 1.033 | 1.204 | 1.506 |
| 4.05265452313072 | 0.968 | 0.829 | 0.662 | 1.033 | 1.206 | 1.511 |
| 4.05579611578431 | 0.968 | 0.828 | 0.66 | 1.033 | 1.207 | 1.516 |
| 4.0589377084379 | 0.968 | 0.828 | 0.658 | 1.033 | 1.208 | 1.52 |
| 4.062079301091489 | 0.968 | 0.827 | 0.656 | 1.033 | 1.21 | 1.525 |
| 4.065220893745079 | 0.968 | 0.826 | 0.654 | 1.033 | 1.211 | 1.53 |
| 4.068362486398668 | 0.967 | 0.825 | 0.652 | 1.034 | 1.212 | 1.535 |
| 4.071504079052258 | 0.967 | 0.824 | 0.649 | 1.034 | 1.214 | 1.54 |
| 4.074645671705848 | 0.967 | 0.823 | 0.647 | 1.034 | 1.215 | 1.545 |
| 4.077787264359437 | 0.967 | 0.822 | 0.645 | 1.034 | 1.216 | 1.55 |
| 4.080928857013027 | 0.967 | 0.821 | 0.643 | 1.034 | 1.218 | 1.555 |
| 4.084070449666616 | 0.967 | 0.82 | 0.641 | 1.034 | 1.219 | 1.56 |
| 4.087212042320206 | 0.967 | 0.819 | 0.639 | 1.035 | 1.221 | 1.565 |
| 4.090353634973795 | 0.966 | 0.818 | 0.637 | 1.035 | 1.222 | 1.57 |
| 4.093495227627385 | 0.966 | 0.817 | 0.635 | 1.035 | 1.223 | 1.575 |
| 4.096636820280975 | 0.966 | 0.817 | 0.633 | 1.035 | 1.225 | 1.581 |
| 4.099778412934564 | 0.966 | 0.816 | 0.631 | 1.035 | 1.226 | 1.586 |
| 4.102920005588154 | 0.966 | 0.815 | 0.628 | 1.035 | 1.227 | 1.591 |
| 4.106061598241744 | 0.966 | 0.814 | 0.626 | 1.036 | 1.229 | 1.597 |
| 4.109203190895333 | 0.965 | 0.813 | 0.624 | 1.036 | 1.23 | 1.602 |
| 4.112344783548923 | 0.965 | 0.812 | 0.622 | 1.036 | 1.231 | 1.608 |
| 4.115486376202512 | 0.965 | 0.811 | 0.62 | 1.036 | 1.233 | 1.613 |
| 4.118627968856102 | 0.965 | 0.81 | 0.618 | 1.036 | 1.234 | 1.619 |
| 4.121769561509692 | 0.965 | 0.809 | 0.616 | 1.036 | 1.236 | 1.624 |
| 4.124911154163281 | 0.965 | 0.808 | 0.614 | 1.037 | 1.237 | 1.63 |
| 4.128052746816871 | 0.965 | 0.808 | 0.611 | 1.037 | 1.238 | 1.635 |
| 4.13119433947046 | 0.964 | 0.807 | 0.609 | 1.037 | 1.24 | 1.641 |
| 4.13433593212405 | 0.964 | 0.806 | 0.607 | 1.037 | 1.241 | 1.647 |
| 4.13747752477764 | 0.964 | 0.805 | 0.605 | 1.037 | 1.242 | 1.653 |
| 4.14061911743123 | 0.964 | 0.804 | 0.603 | 1.037 | 1.244 | 1.659 |
| 4.143760710084818 | 0.964 | 0.803 | 0.601 | 1.038 | 1.245 | 1.664 |
| 4.146902302738408 | 0.964 | 0.802 | 0.599 | 1.038 | 1.247 | 1.67 |
| 4.150043895391998 | 0.964 | 0.801 | 0.597 | 1.038 | 1.248 | 1.676 |
| 4.153185488045588 | 0.963 | 0.8 | 0.594 | 1.038 | 1.249 | 1.682 |
| 4.156327080699177 | 0.963 | 0.8 | 0.592 | 1.038 | 1.251 | 1.688 |
| 4.159468673352766 | 0.963 | 0.799 | 0.59 | 1.038 | 1.252 | 1.695 |
| 4.162610266006356 | 0.963 | 0.798 | 0.588 | 1.038 | 1.253 | 1.701 |
| 4.165751858659946 | 0.963 | 0.797 | 0.586 | 1.039 | 1.255 | 1.707 |
| 4.168893451313535 | 0.963 | 0.796 | 0.584 | 1.039 | 1.256 | 1.713 |
| 4.172035043967125 | 0.963 | 0.795 | 0.582 | 1.039 | 1.258 | 1.72 |
| 4.175176636620715 | 0.962 | 0.794 | 0.579 | 1.039 | 1.259 | 1.726 |
| 4.178318229274304 | 0.962 | 0.793 | 0.577 | 1.039 | 1.26 | 1.732 |
| 4.181459821927894 | 0.962 | 0.793 | 0.575 | 1.039 | 1.262 | 1.739 |
| 4.184601414581484 | 0.962 | 0.792 | 0.573 | 1.04 | 1.263 | 1.745 |
| 4.187743007235073 | 0.962 | 0.791 | 0.571 | 1.04 | 1.264 | 1.752 |
| 4.190884599888663 | 0.962 | 0.79 | 0.569 | 1.04 | 1.266 | 1.759 |
| 4.194026192542252 | 0.962 | 0.789 | 0.567 | 1.04 | 1.267 | 1.765 |
| 4.197167785195842 | 0.961 | 0.788 | 0.564 | 1.04 | 1.269 | 1.772 |
| 4.200309377849432 | 0.961 | 0.787 | 0.562 | 1.04 | 1.27 | 1.779 |
| 4.203450970503021 | 0.961 | 0.787 | 0.56 | 1.04 | 1.271 | 1.786 |
| 4.206592563156611 | 0.961 | 0.786 | 0.558 | 1.041 | 1.273 | 1.792 |
| 4.2097341558102 | 0.961 | 0.785 | 0.556 | 1.041 | 1.274 | 1.799 |
| 4.21287574846379 | 0.961 | 0.784 | 0.554 | 1.041 | 1.275 | 1.806 |
| 4.21601734111738 | 0.961 | 0.783 | 0.551 | 1.041 | 1.277 | 1.813 |
| 4.21915893377097 | 0.96 | 0.782 | 0.549 | 1.041 | 1.278 | 1.82 |
| 4.222300526424559 | 0.96 | 0.782 | 0.547 | 1.041 | 1.28 | 1.828 |
| 4.225442119078148 | 0.96 | 0.781 | 0.545 | 1.041 | 1.281 | 1.835 |
| 4.228583711731738 | 0.96 | 0.78 | 0.543 | 1.042 | 1.282 | 1.842 |
| 4.231725304385327 | 0.96 | 0.779 | 0.541 | 1.042 | 1.284 | 1.849 |
| 4.234866897038917 | 0.96 | 0.778 | 0.539 | 1.042 | 1.285 | 1.857 |
| 4.238008489692506 | 0.96 | 0.777 | 0.536 | 1.042 | 1.286 | 1.864 |
| 4.241150082346096 | 0.959 | 0.777 | 0.534 | 1.042 | 1.288 | 1.872 |
| 4.244291674999685 | 0.959 | 0.776 | 0.532 | 1.042 | 1.289 | 1.879 |
| 4.247433267653276 | 0.959 | 0.775 | 0.53 | 1.043 | 1.29 | 1.887 |
| 4.250574860306865 | 0.959 | 0.774 | 0.528 | 1.043 | 1.292 | 1.894 |
| 4.253716452960455 | 0.959 | 0.773 | 0.526 | 1.043 | 1.293 | 1.902 |
| 4.256858045614044 | 0.959 | 0.773 | 0.524 | 1.043 | 1.294 | 1.91 |
| 4.259999638267634 | 0.959 | 0.772 | 0.522 | 1.043 | 1.296 | 1.918 |
| 4.263141230921224 | 0.959 | 0.771 | 0.519 | 1.043 | 1.297 | 1.925 |
| 4.266282823574813 | 0.958 | 0.77 | 0.517 | 1.043 | 1.299 | 1.933 |
| 4.269424416228403 | 0.958 | 0.769 | 0.515 | 1.043 | 1.3 | 1.941 |
| 4.272566008881992 | 0.958 | 0.769 | 0.513 | 1.044 | 1.301 | 1.949 |
| 4.275707601535582 | 0.958 | 0.768 | 0.511 | 1.044 | 1.303 | 1.957 |
| 4.27884919418917 | 0.958 | 0.767 | 0.509 | 1.044 | 1.304 | 1.966 |
| 4.28199078684276 | 0.958 | 0.766 | 0.507 | 1.044 | 1.305 | 1.974 |
| 4.285132379496351 | 0.958 | 0.765 | 0.505 | 1.044 | 1.306 | 1.982 |
| 4.28827397214994 | 0.958 | 0.765 | 0.502 | 1.044 | 1.308 | 1.99 |
| 4.29141556480353 | 0.957 | 0.764 | 0.5 | 1.044 | 1.309 | 1.999 |
| 4.294557157457119 | 0.957 | 0.763 | 0.498 | 1.045 | 1.31 | 2.007 |
| 4.29769875011071 | 0.957 | 0.762 | 0.496 | 1.045 | 1.312 | 2.016 |
| 4.300840342764299 | 0.957 | 0.762 | 0.494 | 1.045 | 1.313 | 2.024 |
| 4.303981935417888 | 0.957 | 0.761 | 0.492 | 1.045 | 1.314 | 2.033 |
| 4.307123528071478 | 0.957 | 0.76 | 0.49 | 1.045 | 1.316 | 2.042 |
| 4.310265120725067 | 0.957 | 0.759 | 0.488 | 1.045 | 1.317 | 2.05 |
| 4.313406713378657 | 0.957 | 0.759 | 0.486 | 1.045 | 1.318 | 2.059 |
| 4.316548306032247 | 0.956 | 0.758 | 0.484 | 1.045 | 1.32 | 2.068 |
| 4.319689898685836 | 0.956 | 0.757 | 0.481 | 1.046 | 1.321 | 2.077 |
| 4.322831491339426 | 0.956 | 0.756 | 0.479 | 1.046 | 1.322 | 2.086 |
| 4.325973083993015 | 0.956 | 0.756 | 0.477 | 1.046 | 1.323 | 2.095 |
| 4.329114676646605 | 0.956 | 0.755 | 0.475 | 1.046 | 1.325 | 2.104 |
| 4.332256269300195 | 0.956 | 0.754 | 0.473 | 1.046 | 1.326 | 2.113 |
| 4.335397861953784 | 0.956 | 0.753 | 0.471 | 1.046 | 1.327 | 2.123 |
| 4.338539454607374 | 0.956 | 0.753 | 0.469 | 1.046 | 1.328 | 2.132 |
| 4.341681047260963 | 0.956 | 0.752 | 0.467 | 1.046 | 1.33 | 2.141 |
| 4.344822639914553 | 0.955 | 0.751 | 0.465 | 1.047 | 1.331 | 2.151 |
| 4.347964232568143 | 0.955 | 0.751 | 0.463 | 1.047 | 1.332 | 2.16 |
| 4.351105825221732 | 0.955 | 0.75 | 0.461 | 1.047 | 1.333 | 2.17 |
| 4.354247417875322 | 0.955 | 0.749 | 0.459 | 1.047 | 1.335 | 2.179 |
| 4.357389010528911 | 0.955 | 0.749 | 0.457 | 1.047 | 1.336 | 2.189 |
| 4.360530603182501 | 0.955 | 0.748 | 0.455 | 1.047 | 1.337 | 2.198 |
| 4.36367219583609 | 0.955 | 0.747 | 0.453 | 1.047 | 1.338 | 2.208 |
| 4.36681378848968 | 0.955 | 0.747 | 0.451 | 1.047 | 1.339 | 2.218 |
| 4.36995538114327 | 0.955 | 0.746 | 0.449 | 1.048 | 1.341 | 2.228 |
| 4.373096973796859 | 0.955 | 0.745 | 0.447 | 1.048 | 1.342 | 2.238 |
| 4.376238566450449 | 0.954 | 0.745 | 0.445 | 1.048 | 1.343 | 2.248 |
| 4.379380159104038 | 0.954 | 0.744 | 0.443 | 1.048 | 1.344 | 2.258 |
| 4.382521751757628 | 0.954 | 0.743 | 0.441 | 1.048 | 1.345 | 2.268 |
| 4.385663344411217 | 0.954 | 0.743 | 0.439 | 1.048 | 1.347 | 2.278 |
| 4.388804937064807 | 0.954 | 0.742 | 0.437 | 1.048 | 1.348 | 2.288 |
| 4.391946529718397 | 0.954 | 0.741 | 0.435 | 1.048 | 1.349 | 2.298 |
| 4.395088122371987 | 0.954 | 0.741 | 0.433 | 1.048 | 1.35 | 2.309 |
| 4.398229715025576 | 0.954 | 0.74 | 0.431 | 1.049 | 1.351 | 2.319 |
| 4.401371307679165 | 0.954 | 0.739 | 0.429 | 1.049 | 1.352 | 2.329 |
| 4.404512900332755 | 0.954 | 0.739 | 0.427 | 1.049 | 1.353 | 2.34 |
| 4.407654492986345 | 0.953 | 0.738 | 0.425 | 1.049 | 1.355 | 2.35 |
| 4.410796085639934 | 0.953 | 0.738 | 0.424 | 1.049 | 1.356 | 2.361 |
| 4.413937678293524 | 0.953 | 0.737 | 0.422 | 1.049 | 1.357 | 2.371 |
| 4.417079270947114 | 0.953 | 0.736 | 0.42 | 1.049 | 1.358 | 2.382 |
| 4.420220863600703 | 0.953 | 0.736 | 0.418 | 1.049 | 1.359 | 2.393 |
| 4.423362456254293 | 0.953 | 0.735 | 0.416 | 1.049 | 1.36 | 2.403 |
| 4.426504048907883 | 0.953 | 0.735 | 0.414 | 1.049 | 1.361 | 2.414 |
| 4.429645641561472 | 0.953 | 0.734 | 0.412 | 1.05 | 1.362 | 2.425 |
| 4.432787234215062 | 0.953 | 0.734 | 0.411 | 1.05 | 1.363 | 2.436 |
| 4.435928826868651 | 0.953 | 0.733 | 0.409 | 1.05 | 1.364 | 2.447 |
| 4.43907041952224 | 0.953 | 0.732 | 0.407 | 1.05 | 1.365 | 2.458 |
| 4.44221201217583 | 0.952 | 0.732 | 0.405 | 1.05 | 1.366 | 2.468 |
| 4.44535360482942 | 0.952 | 0.731 | 0.403 | 1.05 | 1.367 | 2.479 |
| 4.44849519748301 | 0.952 | 0.731 | 0.402 | 1.05 | 1.368 | 2.49 |
| 4.4516367901366 | 0.952 | 0.73 | 0.4 | 1.05 | 1.369 | 2.501 |
| 4.454778382790188 | 0.952 | 0.73 | 0.398 | 1.05 | 1.37 | 2.512 |
| 4.457919975443779 | 0.952 | 0.729 | 0.396 | 1.05 | 1.371 | 2.524 |
| 4.461061568097368 | 0.952 | 0.729 | 0.395 | 1.05 | 1.372 | 2.535 |
| 4.464203160750958 | 0.952 | 0.728 | 0.393 | 1.051 | 1.373 | 2.546 |
| 4.467344753404547 | 0.952 | 0.728 | 0.391 | 1.051 | 1.374 | 2.557 |
| 4.470486346058137 | 0.952 | 0.727 | 0.389 | 1.051 | 1.375 | 2.568 |
| 4.473627938711726 | 0.952 | 0.727 | 0.388 | 1.051 | 1.376 | 2.579 |
| 4.476769531365316 | 0.952 | 0.726 | 0.386 | 1.051 | 1.377 | 2.59 |
| 4.479911124018905 | 0.951 | 0.726 | 0.384 | 1.051 | 1.378 | 2.601 |
| 4.483052716672495 | 0.951 | 0.725 | 0.383 | 1.051 | 1.379 | 2.613 |
| 4.486194309326085 | 0.951 | 0.725 | 0.381 | 1.051 | 1.38 | 2.624 |
| 4.489335901979674 | 0.951 | 0.724 | 0.38 | 1.051 | 1.381 | 2.635 |
| 4.492477494633264 | 0.951 | 0.724 | 0.378 | 1.051 | 1.382 | 2.646 |
| 4.495619087286854 | 0.951 | 0.723 | 0.376 | 1.051 | 1.383 | 2.657 |
| 4.498760679940443 | 0.951 | 0.723 | 0.375 | 1.051 | 1.383 | 2.668 |
| 4.501902272594033 | 0.951 | 0.722 | 0.373 | 1.052 | 1.384 | 2.679 |
| 4.505043865247622 | 0.951 | 0.722 | 0.372 | 1.052 | 1.385 | 2.691 |
| 4.508185457901212 | 0.951 | 0.721 | 0.37 | 1.052 | 1.386 | 2.702 |
| 4.511327050554801 | 0.951 | 0.721 | 0.369 | 1.052 | 1.387 | 2.713 |
| 4.514468643208391 | 0.951 | 0.721 | 0.367 | 1.052 | 1.388 | 2.724 |
| 4.517610235861981 | 0.951 | 0.72 | 0.366 | 1.052 | 1.388 | 2.735 |
| 4.520751828515571 | 0.951 | 0.72 | 0.364 | 1.052 | 1.389 | 2.746 |
| 4.52389342116916 | 0.951 | 0.719 | 0.363 | 1.052 | 1.39 | 2.757 |
| 4.52703501382275 | 0.95 | 0.719 | 0.361 | 1.052 | 1.391 | 2.767 |
| 4.530176606476339 | 0.95 | 0.719 | 0.36 | 1.052 | 1.392 | 2.778 |
| 4.533318199129928 | 0.95 | 0.718 | 0.359 | 1.052 | 1.392 | 2.789 |
| 4.536459791783518 | 0.95 | 0.718 | 0.357 | 1.052 | 1.393 | 2.8 |
| 4.539601384437108 | 0.95 | 0.717 | 0.356 | 1.052 | 1.394 | 2.81 |
| 4.542742977090698 | 0.95 | 0.717 | 0.354 | 1.052 | 1.394 | 2.821 |
| 4.545884569744287 | 0.95 | 0.717 | 0.353 | 1.052 | 1.395 | 2.832 |
| 4.549026162397876 | 0.95 | 0.716 | 0.352 | 1.053 | 1.396 | 2.842 |
| 4.552167755051466 | 0.95 | 0.716 | 0.351 | 1.053 | 1.397 | 2.852 |
| 4.555309347705056 | 0.95 | 0.716 | 0.349 | 1.053 | 1.397 | 2.863 |
| 4.558450940358646 | 0.95 | 0.715 | 0.348 | 1.053 | 1.398 | 2.873 |
| 4.561592533012235 | 0.95 | 0.715 | 0.347 | 1.053 | 1.399 | 2.883 |
| 4.564734125665825 | 0.95 | 0.715 | 0.346 | 1.053 | 1.399 | 2.893 |
| 4.567875718319415 | 0.95 | 0.714 | 0.344 | 1.053 | 1.4 | 2.903 |
| 4.571017310973004 | 0.95 | 0.714 | 0.343 | 1.053 | 1.4 | 2.913 |
| 4.574158903626594 | 0.95 | 0.714 | 0.342 | 1.053 | 1.401 | 2.922 |
| 4.577300496280183 | 0.95 | 0.713 | 0.341 | 1.053 | 1.402 | 2.932 |
| 4.580442088933772 | 0.95 | 0.713 | 0.34 | 1.053 | 1.402 | 2.941 |
| 4.583583681587362 | 0.95 | 0.713 | 0.339 | 1.053 | 1.403 | 2.951 |
| 4.586725274240952 | 0.95 | 0.713 | 0.338 | 1.053 | 1.403 | 2.96 |
| 4.589866866894542 | 0.949 | 0.712 | 0.337 | 1.053 | 1.404 | 2.969 |
| 4.593008459548131 | 0.949 | 0.712 | 0.336 | 1.053 | 1.404 | 2.978 |
| 4.596150052201721 | 0.949 | 0.712 | 0.335 | 1.053 | 1.405 | 2.987 |
| 4.59929164485531 | 0.949 | 0.712 | 0.334 | 1.053 | 1.405 | 2.995 |
| 4.6024332375089 | 0.949 | 0.711 | 0.333 | 1.053 | 1.406 | 3.004 |
| 4.60557483016249 | 0.949 | 0.711 | 0.332 | 1.053 | 1.406 | 3.012 |
| 4.608716422816079 | 0.949 | 0.711 | 0.331 | 1.053 | 1.407 | 3.02 |
| 4.611858015469668 | 0.949 | 0.711 | 0.33 | 1.054 | 1.407 | 3.028 |
| 4.614999608123258 | 0.949 | 0.71 | 0.329 | 1.054 | 1.408 | 3.036 |
| 4.618141200776848 | 0.949 | 0.71 | 0.329 | 1.054 | 1.408 | 3.043 |
| 4.621282793430437 | 0.949 | 0.71 | 0.328 | 1.054 | 1.408 | 3.051 |
| 4.624424386084027 | 0.949 | 0.71 | 0.327 | 1.054 | 1.409 | 3.058 |
| 4.627565978737617 | 0.949 | 0.71 | 0.326 | 1.054 | 1.409 | 3.065 |
| 4.630707571391206 | 0.949 | 0.709 | 0.326 | 1.054 | 1.41 | 3.072 |
| 4.633849164044795 | 0.949 | 0.709 | 0.325 | 1.054 | 1.41 | 3.078 |
| 4.636990756698386 | 0.949 | 0.709 | 0.324 | 1.054 | 1.41 | 3.084 |
| 4.640132349351975 | 0.949 | 0.709 | 0.324 | 1.054 | 1.411 | 3.091 |
| 4.643273942005564 | 0.949 | 0.709 | 0.323 | 1.054 | 1.411 | 3.097 |
| 4.646415534659154 | 0.949 | 0.709 | 0.322 | 1.054 | 1.411 | 3.102 |
| 4.649557127312744 | 0.949 | 0.708 | 0.322 | 1.054 | 1.411 | 3.108 |
| 4.652698719966334 | 0.949 | 0.708 | 0.321 | 1.054 | 1.412 | 3.113 |
| 4.655840312619923 | 0.949 | 0.708 | 0.321 | 1.054 | 1.412 | 3.118 |
| 4.658981905273513 | 0.949 | 0.708 | 0.32 | 1.054 | 1.412 | 3.122 |
| 4.662123497927102 | 0.949 | 0.708 | 0.32 | 1.054 | 1.412 | 3.127 |
| 4.665265090580692 | 0.949 | 0.708 | 0.319 | 1.054 | 1.413 | 3.131 |
| 4.668406683234282 | 0.949 | 0.708 | 0.319 | 1.054 | 1.413 | 3.135 |
| 4.671548275887871 | 0.949 | 0.708 | 0.319 | 1.054 | 1.413 | 3.139 |
| 4.674689868541461 | 0.949 | 0.708 | 0.318 | 1.054 | 1.413 | 3.142 |
| 4.67783146119505 | 0.949 | 0.708 | 0.318 | 1.054 | 1.413 | 3.145 |
| 4.68097305384864 | 0.949 | 0.707 | 0.318 | 1.054 | 1.414 | 3.148 |
| 4.68411464650223 | 0.949 | 0.707 | 0.317 | 1.054 | 1.414 | 3.151 |
| 4.687256239155819 | 0.949 | 0.707 | 0.317 | 1.054 | 1.414 | 3.153 |
| 4.690397831809409 | 0.949 | 0.707 | 0.317 | 1.054 | 1.414 | 3.155 |
| 4.693539424462998 | 0.949 | 0.707 | 0.317 | 1.054 | 1.414 | 3.157 |
| 4.696681017116588 | 0.949 | 0.707 | 0.317 | 1.054 | 1.414 | 3.159 |
| 4.699822609770177 | 0.949 | 0.707 | 0.316 | 1.054 | 1.414 | 3.16 |
| 4.702964202423767 | 0.949 | 0.707 | 0.316 | 1.054 | 1.414 | 3.161 |
| 4.706105795077356 | 0.949 | 0.707 | 0.316 | 1.054 | 1.414 | 3.162 |
| 4.709247387730946 | 0.949 | 0.707 | 0.316 | 1.054 | 1.414 | 3.162 |
| 4.712388980384535 | 0.949 | 0.707 | 0.316 | 1.054 | 1.414 | 3.162 |
| 4.715530573038126 | 0.949 | 0.707 | 0.316 | 1.054 | 1.414 | 3.162 |
| 4.718672165691715 | 0.949 | 0.707 | 0.316 | 1.054 | 1.414 | 3.162 |
| 4.721813758345305 | 0.949 | 0.707 | 0.316 | 1.054 | 1.414 | 3.161 |
| 4.724955350998894 | 0.949 | 0.707 | 0.316 | 1.054 | 1.414 | 3.16 |
| 4.728096943652484 | 0.949 | 0.707 | 0.317 | 1.054 | 1.414 | 3.159 |
| 4.731238536306074 | 0.949 | 0.707 | 0.317 | 1.054 | 1.414 | 3.157 |
| 4.734380128959663 | 0.949 | 0.707 | 0.317 | 1.054 | 1.414 | 3.155 |
| 4.737521721613253 | 0.949 | 0.707 | 0.317 | 1.054 | 1.414 | 3.153 |
| 4.740663314266842 | 0.949 | 0.707 | 0.317 | 1.054 | 1.414 | 3.151 |
| 4.743804906920432 | 0.949 | 0.707 | 0.318 | 1.054 | 1.414 | 3.148 |
| 4.74694649957402 | 0.949 | 0.708 | 0.318 | 1.054 | 1.413 | 3.145 |
| 4.750088092227611 | 0.949 | 0.708 | 0.318 | 1.054 | 1.413 | 3.142 |
| 4.7532296848812 | 0.949 | 0.708 | 0.319 | 1.054 | 1.413 | 3.139 |
| 4.75637127753479 | 0.949 | 0.708 | 0.319 | 1.054 | 1.413 | 3.135 |
| 4.75951287018838 | 0.949 | 0.708 | 0.319 | 1.054 | 1.413 | 3.131 |
| 4.76265446284197 | 0.949 | 0.708 | 0.32 | 1.054 | 1.412 | 3.127 |
| 4.765796055495559 | 0.949 | 0.708 | 0.32 | 1.054 | 1.412 | 3.122 |
| 4.768937648149149 | 0.949 | 0.708 | 0.321 | 1.054 | 1.412 | 3.118 |
| 4.772079240802738 | 0.949 | 0.708 | 0.321 | 1.054 | 1.412 | 3.113 |
| 4.775220833456327 | 0.949 | 0.708 | 0.322 | 1.054 | 1.411 | 3.108 |
| 4.778362426109917 | 0.949 | 0.709 | 0.322 | 1.054 | 1.411 | 3.102 |
| 4.781504018763507 | 0.949 | 0.709 | 0.323 | 1.054 | 1.411 | 3.097 |
| 4.784645611417097 | 0.949 | 0.709 | 0.324 | 1.054 | 1.411 | 3.091 |
| 4.787787204070686 | 0.949 | 0.709 | 0.324 | 1.054 | 1.41 | 3.084 |
| 4.790928796724275 | 0.949 | 0.709 | 0.325 | 1.054 | 1.41 | 3.078 |
| 4.794070389377865 | 0.949 | 0.709 | 0.326 | 1.054 | 1.41 | 3.072 |
| 4.797211982031455 | 0.949 | 0.71 | 0.326 | 1.054 | 1.409 | 3.065 |
| 4.800353574685045 | 0.949 | 0.71 | 0.327 | 1.054 | 1.409 | 3.058 |
| 4.803495167338634 | 0.949 | 0.71 | 0.328 | 1.054 | 1.408 | 3.051 |
| 4.806636759992224 | 0.949 | 0.71 | 0.329 | 1.054 | 1.408 | 3.043 |
| 4.809778352645814 | 0.949 | 0.71 | 0.329 | 1.054 | 1.408 | 3.036 |
| 4.812919945299403 | 0.949 | 0.711 | 0.33 | 1.054 | 1.407 | 3.028 |
| 4.816061537952993 | 0.949 | 0.711 | 0.331 | 1.053 | 1.407 | 3.02 |
| 4.819203130606582 | 0.949 | 0.711 | 0.332 | 1.053 | 1.406 | 3.012 |
| 4.822344723260172 | 0.949 | 0.711 | 0.333 | 1.053 | 1.406 | 3.004 |
| 4.825486315913761 | 0.949 | 0.712 | 0.334 | 1.053 | 1.405 | 2.995 |
| 4.828627908567351 | 0.949 | 0.712 | 0.335 | 1.053 | 1.405 | 2.987 |
| 4.83176950122094 | 0.949 | 0.712 | 0.336 | 1.053 | 1.404 | 2.978 |
| 4.83491109387453 | 0.949 | 0.712 | 0.337 | 1.053 | 1.404 | 2.969 |
| 4.83805268652812 | 0.95 | 0.713 | 0.338 | 1.053 | 1.403 | 2.96 |
| 4.841194279181709 | 0.95 | 0.713 | 0.339 | 1.053 | 1.403 | 2.951 |
| 4.844335871835299 | 0.95 | 0.713 | 0.34 | 1.053 | 1.402 | 2.941 |
| 4.847477464488889 | 0.95 | 0.713 | 0.341 | 1.053 | 1.402 | 2.932 |
| 4.850619057142478 | 0.95 | 0.714 | 0.342 | 1.053 | 1.401 | 2.922 |
| 4.853760649796068 | 0.95 | 0.714 | 0.343 | 1.053 | 1.4 | 2.913 |
| 4.856902242449657 | 0.95 | 0.714 | 0.344 | 1.053 | 1.4 | 2.903 |
| 4.860043835103247 | 0.95 | 0.715 | 0.346 | 1.053 | 1.399 | 2.893 |
| 4.863185427756837 | 0.95 | 0.715 | 0.347 | 1.053 | 1.399 | 2.883 |
| 4.866327020410426 | 0.95 | 0.715 | 0.348 | 1.053 | 1.398 | 2.873 |
| 4.869468613064015 | 0.95 | 0.716 | 0.349 | 1.053 | 1.397 | 2.863 |
| 4.872610205717605 | 0.95 | 0.716 | 0.351 | 1.053 | 1.397 | 2.852 |
| 4.875751798371195 | 0.95 | 0.716 | 0.352 | 1.053 | 1.396 | 2.842 |
| 4.878893391024784 | 0.95 | 0.717 | 0.353 | 1.052 | 1.395 | 2.832 |
| 4.882034983678374 | 0.95 | 0.717 | 0.354 | 1.052 | 1.394 | 2.821 |
| 4.885176576331964 | 0.95 | 0.717 | 0.356 | 1.052 | 1.394 | 2.81 |
| 4.888318168985553 | 0.95 | 0.718 | 0.357 | 1.052 | 1.393 | 2.8 |
| 4.891459761639143 | 0.95 | 0.718 | 0.359 | 1.052 | 1.392 | 2.789 |
| 4.894601354292733 | 0.95 | 0.719 | 0.36 | 1.052 | 1.392 | 2.778 |
| 4.897742946946322 | 0.95 | 0.719 | 0.361 | 1.052 | 1.391 | 2.767 |
| 4.900884539599912 | 0.951 | 0.719 | 0.363 | 1.052 | 1.39 | 2.757 |
| 4.904026132253501 | 0.951 | 0.72 | 0.364 | 1.052 | 1.389 | 2.746 |
| 4.907167724907091 | 0.951 | 0.72 | 0.366 | 1.052 | 1.388 | 2.735 |
| 4.91030931756068 | 0.951 | 0.721 | 0.367 | 1.052 | 1.388 | 2.724 |
| 4.91345091021427 | 0.951 | 0.721 | 0.369 | 1.052 | 1.387 | 2.713 |
| 4.91659250286786 | 0.951 | 0.721 | 0.37 | 1.052 | 1.386 | 2.702 |
| 4.91973409552145 | 0.951 | 0.722 | 0.372 | 1.052 | 1.385 | 2.691 |
| 4.922875688175039 | 0.951 | 0.722 | 0.373 | 1.052 | 1.384 | 2.679 |
| 4.926017280828628 | 0.951 | 0.723 | 0.375 | 1.051 | 1.383 | 2.668 |
| 4.929158873482218 | 0.951 | 0.723 | 0.376 | 1.051 | 1.383 | 2.657 |
| 4.932300466135808 | 0.951 | 0.724 | 0.378 | 1.051 | 1.382 | 2.646 |
| 4.935442058789397 | 0.951 | 0.724 | 0.38 | 1.051 | 1.381 | 2.635 |
| 4.938583651442987 | 0.951 | 0.725 | 0.381 | 1.051 | 1.38 | 2.624 |
| 4.941725244096576 | 0.951 | 0.725 | 0.383 | 1.051 | 1.379 | 2.613 |
| 4.944866836750166 | 0.951 | 0.726 | 0.384 | 1.051 | 1.378 | 2.601 |
| 4.948008429403755 | 0.952 | 0.726 | 0.386 | 1.051 | 1.377 | 2.59 |
| 4.951150022057345 | 0.952 | 0.727 | 0.388 | 1.051 | 1.376 | 2.579 |
| 4.954291614710935 | 0.952 | 0.727 | 0.389 | 1.051 | 1.375 | 2.568 |
| 4.957433207364524 | 0.952 | 0.728 | 0.391 | 1.051 | 1.374 | 2.557 |
| 4.960574800018114 | 0.952 | 0.728 | 0.393 | 1.051 | 1.373 | 2.546 |
| 4.963716392671704 | 0.952 | 0.729 | 0.395 | 1.05 | 1.372 | 2.535 |
| 4.966857985325293 | 0.952 | 0.729 | 0.396 | 1.05 | 1.371 | 2.524 |
| 4.969999577978883 | 0.952 | 0.73 | 0.398 | 1.05 | 1.37 | 2.512 |
| 4.973141170632472 | 0.952 | 0.73 | 0.4 | 1.05 | 1.369 | 2.501 |
| 4.976282763286062 | 0.952 | 0.731 | 0.402 | 1.05 | 1.368 | 2.49 |
| 4.979424355939651 | 0.952 | 0.731 | 0.403 | 1.05 | 1.367 | 2.479 |
| 4.982565948593241 | 0.952 | 0.732 | 0.405 | 1.05 | 1.366 | 2.468 |
| 4.985707541246831 | 0.953 | 0.732 | 0.407 | 1.05 | 1.365 | 2.458 |
| 4.98884913390042 | 0.953 | 0.733 | 0.409 | 1.05 | 1.364 | 2.447 |
| 4.99199072655401 | 0.953 | 0.734 | 0.411 | 1.05 | 1.363 | 2.436 |
| 4.9951323192076 | 0.953 | 0.734 | 0.412 | 1.05 | 1.362 | 2.425 |
| 4.99827391186119 | 0.953 | 0.735 | 0.414 | 1.049 | 1.361 | 2.414 |
| 5.00141550451478 | 0.953 | 0.735 | 0.416 | 1.049 | 1.36 | 2.403 |
| 5.004557097168369 | 0.953 | 0.736 | 0.418 | 1.049 | 1.359 | 2.393 |
| 5.007698689821958 | 0.953 | 0.736 | 0.42 | 1.049 | 1.358 | 2.382 |
| 5.010840282475548 | 0.953 | 0.737 | 0.422 | 1.049 | 1.357 | 2.371 |
| 5.013981875129137 | 0.953 | 0.738 | 0.424 | 1.049 | 1.356 | 2.361 |
| 5.017123467782727 | 0.953 | 0.738 | 0.425 | 1.049 | 1.355 | 2.35 |
| 5.020265060436317 | 0.954 | 0.739 | 0.427 | 1.049 | 1.353 | 2.34 |
| 5.023406653089906 | 0.954 | 0.739 | 0.429 | 1.049 | 1.352 | 2.329 |
| 5.026548245743496 | 0.954 | 0.74 | 0.431 | 1.049 | 1.351 | 2.319 |
| 5.029689838397085 | 0.954 | 0.741 | 0.433 | 1.048 | 1.35 | 2.309 |
| 5.032831431050674 | 0.954 | 0.741 | 0.435 | 1.048 | 1.349 | 2.298 |
| 5.035973023704264 | 0.954 | 0.742 | 0.437 | 1.048 | 1.348 | 2.288 |
| 5.039114616357854 | 0.954 | 0.743 | 0.439 | 1.048 | 1.347 | 2.278 |
| 5.042256209011444 | 0.954 | 0.743 | 0.441 | 1.048 | 1.345 | 2.268 |
| 5.045397801665033 | 0.954 | 0.744 | 0.443 | 1.048 | 1.344 | 2.258 |
| 5.048539394318622 | 0.954 | 0.745 | 0.445 | 1.048 | 1.343 | 2.248 |
| 5.051680986972213 | 0.955 | 0.745 | 0.447 | 1.048 | 1.342 | 2.238 |
| 5.054822579625802 | 0.955 | 0.746 | 0.449 | 1.048 | 1.341 | 2.228 |
| 5.057964172279392 | 0.955 | 0.747 | 0.451 | 1.047 | 1.339 | 2.218 |
| 5.061105764932981 | 0.955 | 0.747 | 0.453 | 1.047 | 1.338 | 2.208 |
| 5.064247357586571 | 0.955 | 0.748 | 0.455 | 1.047 | 1.337 | 2.198 |
| 5.067388950240161 | 0.955 | 0.749 | 0.457 | 1.047 | 1.336 | 2.189 |
| 5.07053054289375 | 0.955 | 0.749 | 0.459 | 1.047 | 1.335 | 2.179 |
| 5.07367213554734 | 0.955 | 0.75 | 0.461 | 1.047 | 1.333 | 2.17 |
| 5.07681372820093 | 0.955 | 0.751 | 0.463 | 1.047 | 1.332 | 2.16 |
| 5.079955320854519 | 0.955 | 0.751 | 0.465 | 1.047 | 1.331 | 2.151 |
| 5.083096913508108 | 0.956 | 0.752 | 0.467 | 1.046 | 1.33 | 2.141 |
| 5.086238506161698 | 0.956 | 0.753 | 0.469 | 1.046 | 1.328 | 2.132 |
| 5.089380098815288 | 0.956 | 0.753 | 0.471 | 1.046 | 1.327 | 2.123 |
| 5.092521691468877 | 0.956 | 0.754 | 0.473 | 1.046 | 1.326 | 2.113 |
| 5.095663284122466 | 0.956 | 0.755 | 0.475 | 1.046 | 1.325 | 2.104 |
| 5.098804876776057 | 0.956 | 0.756 | 0.477 | 1.046 | 1.323 | 2.095 |
| 5.101946469429646 | 0.956 | 0.756 | 0.479 | 1.046 | 1.322 | 2.086 |
| 5.105088062083236 | 0.956 | 0.757 | 0.481 | 1.046 | 1.321 | 2.077 |
| 5.108229654736825 | 0.956 | 0.758 | 0.484 | 1.045 | 1.32 | 2.068 |
| 5.111371247390415 | 0.957 | 0.759 | 0.486 | 1.045 | 1.318 | 2.059 |
| 5.114512840044005 | 0.957 | 0.759 | 0.488 | 1.045 | 1.317 | 2.05 |
| 5.117654432697594 | 0.957 | 0.76 | 0.49 | 1.045 | 1.316 | 2.042 |
| 5.120796025351184 | 0.957 | 0.761 | 0.492 | 1.045 | 1.314 | 2.033 |
| 5.123937618004773 | 0.957 | 0.762 | 0.494 | 1.045 | 1.313 | 2.024 |
| 5.127079210658363 | 0.957 | 0.762 | 0.496 | 1.045 | 1.312 | 2.016 |
| 5.130220803311953 | 0.957 | 0.763 | 0.498 | 1.045 | 1.31 | 2.007 |
| 5.133362395965542 | 0.957 | 0.764 | 0.5 | 1.044 | 1.309 | 1.999 |
| 5.136503988619131 | 0.958 | 0.765 | 0.502 | 1.044 | 1.308 | 1.99 |
| 5.13964558127272 | 0.958 | 0.765 | 0.505 | 1.044 | 1.306 | 1.982 |
| 5.142787173926311 | 0.958 | 0.766 | 0.507 | 1.044 | 1.305 | 1.974 |
| 5.1459287665799 | 0.958 | 0.767 | 0.509 | 1.044 | 1.304 | 1.966 |
| 5.14907035923349 | 0.958 | 0.768 | 0.511 | 1.044 | 1.303 | 1.957 |
| 5.15221195188708 | 0.958 | 0.769 | 0.513 | 1.044 | 1.301 | 1.949 |
| 5.15535354454067 | 0.958 | 0.769 | 0.515 | 1.043 | 1.3 | 1.941 |
| 5.158495137194259 | 0.958 | 0.77 | 0.517 | 1.043 | 1.299 | 1.933 |
| 5.161636729847848 | 0.959 | 0.771 | 0.519 | 1.043 | 1.297 | 1.925 |
| 5.164778322501438 | 0.959 | 0.772 | 0.522 | 1.043 | 1.296 | 1.918 |
| 5.167919915155028 | 0.959 | 0.773 | 0.524 | 1.043 | 1.294 | 1.91 |
| 5.171061507808617 | 0.959 | 0.773 | 0.526 | 1.043 | 1.293 | 1.902 |
| 5.174203100462206 | 0.959 | 0.774 | 0.528 | 1.043 | 1.292 | 1.894 |
| 5.177344693115796 | 0.959 | 0.775 | 0.53 | 1.043 | 1.29 | 1.887 |
| 5.180486285769386 | 0.959 | 0.776 | 0.532 | 1.042 | 1.289 | 1.879 |
| 5.183627878422976 | 0.959 | 0.777 | 0.534 | 1.042 | 1.288 | 1.872 |
| 5.186769471076565 | 0.96 | 0.777 | 0.536 | 1.042 | 1.286 | 1.864 |
| 5.189911063730155 | 0.96 | 0.778 | 0.539 | 1.042 | 1.285 | 1.857 |
| 5.193052656383744 | 0.96 | 0.779 | 0.541 | 1.042 | 1.284 | 1.849 |
| 5.196194249037334 | 0.96 | 0.78 | 0.543 | 1.042 | 1.282 | 1.842 |
| 5.199335841690924 | 0.96 | 0.781 | 0.545 | 1.041 | 1.281 | 1.835 |
| 5.202477434344513 | 0.96 | 0.782 | 0.547 | 1.041 | 1.28 | 1.828 |
| 5.205619026998103 | 0.96 | 0.782 | 0.549 | 1.041 | 1.278 | 1.82 |
| 5.208760619651692 | 0.961 | 0.783 | 0.551 | 1.041 | 1.277 | 1.813 |
| 5.211902212305282 | 0.961 | 0.784 | 0.554 | 1.041 | 1.275 | 1.806 |
| 5.215043804958871 | 0.961 | 0.785 | 0.556 | 1.041 | 1.274 | 1.799 |
| 5.218185397612461 | 0.961 | 0.786 | 0.558 | 1.041 | 1.273 | 1.792 |
| 5.221326990266051 | 0.961 | 0.787 | 0.56 | 1.04 | 1.271 | 1.786 |
| 5.22446858291964 | 0.961 | 0.787 | 0.562 | 1.04 | 1.27 | 1.779 |
| 5.22761017557323 | 0.961 | 0.788 | 0.564 | 1.04 | 1.269 | 1.772 |
| 5.23075176822682 | 0.962 | 0.789 | 0.567 | 1.04 | 1.267 | 1.765 |
| 5.23389336088041 | 0.962 | 0.79 | 0.569 | 1.04 | 1.266 | 1.759 |
| 5.237034953533999 | 0.962 | 0.791 | 0.571 | 1.04 | 1.264 | 1.752 |
| 5.240176546187588 | 0.962 | 0.792 | 0.573 | 1.04 | 1.263 | 1.745 |
| 5.243318138841178 | 0.962 | 0.793 | 0.575 | 1.039 | 1.262 | 1.739 |
| 5.246459731494767 | 0.962 | 0.793 | 0.577 | 1.039 | 1.26 | 1.732 |
| 5.249601324148357 | 0.962 | 0.794 | 0.579 | 1.039 | 1.259 | 1.726 |
| 5.252742916801947 | 0.963 | 0.795 | 0.582 | 1.039 | 1.258 | 1.72 |
| 5.255884509455536 | 0.963 | 0.796 | 0.584 | 1.039 | 1.256 | 1.713 |
| 5.259026102109125 | 0.963 | 0.797 | 0.586 | 1.039 | 1.255 | 1.707 |
| 5.262167694762715 | 0.963 | 0.798 | 0.588 | 1.038 | 1.253 | 1.701 |
| 5.265309287416305 | 0.963 | 0.799 | 0.59 | 1.038 | 1.252 | 1.695 |
| 5.268450880069895 | 0.963 | 0.8 | 0.592 | 1.038 | 1.251 | 1.688 |
| 5.271592472723484 | 0.963 | 0.8 | 0.594 | 1.038 | 1.249 | 1.682 |
| 5.274734065377074 | 0.964 | 0.801 | 0.597 | 1.038 | 1.248 | 1.676 |
| 5.277875658030664 | 0.964 | 0.802 | 0.599 | 1.038 | 1.247 | 1.67 |
| 5.281017250684253 | 0.964 | 0.803 | 0.601 | 1.038 | 1.245 | 1.664 |
| 5.284158843337843 | 0.964 | 0.804 | 0.603 | 1.037 | 1.244 | 1.659 |
| 5.287300435991432 | 0.964 | 0.805 | 0.605 | 1.037 | 1.242 | 1.653 |
| 5.290442028645022 | 0.964 | 0.806 | 0.607 | 1.037 | 1.241 | 1.647 |
| 5.293583621298612 | 0.964 | 0.807 | 0.609 | 1.037 | 1.24 | 1.641 |
| 5.296725213952201 | 0.965 | 0.808 | 0.611 | 1.037 | 1.238 | 1.635 |
| 5.299866806605791 | 0.965 | 0.808 | 0.614 | 1.037 | 1.237 | 1.63 |
| 5.30300839925938 | 0.965 | 0.809 | 0.616 | 1.036 | 1.236 | 1.624 |
| 5.30614999191297 | 0.965 | 0.81 | 0.618 | 1.036 | 1.234 | 1.619 |
| 5.30929158456656 | 0.965 | 0.811 | 0.62 | 1.036 | 1.233 | 1.613 |
| 5.312433177220149 | 0.965 | 0.812 | 0.622 | 1.036 | 1.231 | 1.608 |
| 5.315574769873739 | 0.965 | 0.813 | 0.624 | 1.036 | 1.23 | 1.602 |
| 5.318716362527328 | 0.966 | 0.814 | 0.626 | 1.036 | 1.229 | 1.597 |
| 5.321857955180918 | 0.966 | 0.815 | 0.628 | 1.035 | 1.227 | 1.591 |
| 5.324999547834508 | 0.966 | 0.816 | 0.631 | 1.035 | 1.226 | 1.586 |
| 5.328141140488097 | 0.966 | 0.817 | 0.633 | 1.035 | 1.225 | 1.581 |
| 5.331282733141686 | 0.966 | 0.817 | 0.635 | 1.035 | 1.223 | 1.575 |
| 5.334424325795276 | 0.966 | 0.818 | 0.637 | 1.035 | 1.222 | 1.57 |
| 5.337565918448866 | 0.967 | 0.819 | 0.639 | 1.035 | 1.221 | 1.565 |
| 5.340707511102456 | 0.967 | 0.82 | 0.641 | 1.034 | 1.219 | 1.56 |
| 5.343849103756045 | 0.967 | 0.821 | 0.643 | 1.034 | 1.218 | 1.555 |
| 5.346990696409634 | 0.967 | 0.822 | 0.645 | 1.034 | 1.216 | 1.55 |
| 5.350132289063224 | 0.967 | 0.823 | 0.647 | 1.034 | 1.215 | 1.545 |
| 5.353273881716814 | 0.967 | 0.824 | 0.649 | 1.034 | 1.214 | 1.54 |
| 5.356415474370403 | 0.967 | 0.825 | 0.652 | 1.034 | 1.212 | 1.535 |
| 5.359557067023993 | 0.968 | 0.826 | 0.654 | 1.033 | 1.211 | 1.53 |
| 5.362698659677583 | 0.968 | 0.827 | 0.656 | 1.033 | 1.21 | 1.525 |
| 5.365840252331172 | 0.968 | 0.828 | 0.658 | 1.033 | 1.208 | 1.52 |
| 5.368981844984762 | 0.968 | 0.828 | 0.66 | 1.033 | 1.207 | 1.516 |
| 5.372123437638351 | 0.968 | 0.829 | 0.662 | 1.033 | 1.206 | 1.511 |
| 5.375265030291941 | 0.968 | 0.83 | 0.664 | 1.033 | 1.204 | 1.506 |
| 5.378406622945531 | 0.969 | 0.831 | 0.666 | 1.032 | 1.203 | 1.501 |
| 5.38154821559912 | 0.969 | 0.832 | 0.668 | 1.032 | 1.202 | 1.497 |
| 5.38468980825271 | 0.969 | 0.833 | 0.67 | 1.032 | 1.2 | 1.492 |
| 5.387831400906299 | 0.969 | 0.834 | 0.672 | 1.032 | 1.199 | 1.488 |
| 5.39097299355989 | 0.969 | 0.835 | 0.674 | 1.032 | 1.198 | 1.483 |
| 5.394114586213479 | 0.969 | 0.836 | 0.676 | 1.032 | 1.196 | 1.479 |
| 5.397256178867068 | 0.97 | 0.837 | 0.678 | 1.031 | 1.195 | 1.474 |
| 5.400397771520657 | 0.97 | 0.838 | 0.68 | 1.031 | 1.194 | 1.47 |
| 5.403539364174247 | 0.97 | 0.839 | 0.682 | 1.031 | 1.193 | 1.465 |
| 5.406680956827837 | 0.97 | 0.839 | 0.684 | 1.031 | 1.191 | 1.461 |
| 5.409822549481426 | 0.97 | 0.84 | 0.686 | 1.031 | 1.19 | 1.457 |
| 5.412964142135016 | 0.97 | 0.841 | 0.688 | 1.031 | 1.189 | 1.452 |
| 5.416105734788605 | 0.97 | 0.842 | 0.691 | 1.03 | 1.187 | 1.448 |
| 5.419247327442195 | 0.971 | 0.843 | 0.693 | 1.03 | 1.186 | 1.444 |
| 5.422388920095785 | 0.971 | 0.844 | 0.695 | 1.03 | 1.185 | 1.44 |
| 5.425530512749375 | 0.971 | 0.845 | 0.697 | 1.03 | 1.183 | 1.436 |
| 5.428672105402964 | 0.971 | 0.846 | 0.699 | 1.03 | 1.182 | 1.432 |
| 5.431813698056554 | 0.971 | 0.847 | 0.701 | 1.03 | 1.181 | 1.427 |
| 5.434955290710143 | 0.971 | 0.848 | 0.703 | 1.029 | 1.18 | 1.423 |
| 5.438096883363733 | 0.972 | 0.849 | 0.705 | 1.029 | 1.178 | 1.419 |
| 5.441238476017322 | 0.972 | 0.85 | 0.707 | 1.029 | 1.177 | 1.415 |
| 5.444380068670912 | 0.972 | 0.85 | 0.709 | 1.029 | 1.176 | 1.411 |
| 5.447521661324502 | 0.972 | 0.851 | 0.711 | 1.029 | 1.175 | 1.407 |
| 5.450663253978091 | 0.972 | 0.852 | 0.712 | 1.029 | 1.173 | 1.404 |
| 5.453804846631681 | 0.972 | 0.853 | 0.714 | 1.028 | 1.172 | 1.4 |
| 5.456946439285271 | 0.973 | 0.854 | 0.716 | 1.028 | 1.171 | 1.396 |
| 5.46008803193886 | 0.973 | 0.855 | 0.718 | 1.028 | 1.169 | 1.392 |
| 5.46322962459245 | 0.973 | 0.856 | 0.72 | 1.028 | 1.168 | 1.388 |
| 5.466371217246039 | 0.973 | 0.857 | 0.722 | 1.028 | 1.167 | 1.384 |
| 5.46951280989963 | 0.973 | 0.858 | 0.724 | 1.028 | 1.166 | 1.381 |
| 5.472654402553218 | 0.973 | 0.859 | 0.726 | 1.027 | 1.164 | 1.377 |
| 5.475795995206808 | 0.974 | 0.86 | 0.728 | 1.027 | 1.163 | 1.373 |
| 5.478937587860398 | 0.974 | 0.861 | 0.73 | 1.027 | 1.162 | 1.37 |
| 5.482079180513987 | 0.974 | 0.861 | 0.732 | 1.027 | 1.161 | 1.366 |
| 5.485220773167577 | 0.974 | 0.862 | 0.734 | 1.027 | 1.16 | 1.362 |
| 5.488362365821166 | 0.974 | 0.863 | 0.736 | 1.026 | 1.158 | 1.359 |
| 5.491503958474756 | 0.974 | 0.864 | 0.738 | 1.026 | 1.157 | 1.355 |
| 5.494645551128346 | 0.975 | 0.865 | 0.74 | 1.026 | 1.156 | 1.352 |
| 5.497787143781935 | 0.975 | 0.866 | 0.742 | 1.026 | 1.155 | 1.348 |
| 5.500928736435525 | 0.975 | 0.867 | 0.744 | 1.026 | 1.153 | 1.345 |
| 5.504070329089115 | 0.975 | 0.868 | 0.745 | 1.026 | 1.152 | 1.342 |
| 5.507211921742704 | 0.975 | 0.869 | 0.747 | 1.025 | 1.151 | 1.338 |
| 5.510353514396294 | 0.975 | 0.87 | 0.749 | 1.025 | 1.15 | 1.335 |
| 5.513495107049883 | 0.975 | 0.871 | 0.751 | 1.025 | 1.149 | 1.331 |
| 5.516636699703473 | 0.976 | 0.871 | 0.753 | 1.025 | 1.148 | 1.328 |
| 5.519778292357062 | 0.976 | 0.872 | 0.755 | 1.025 | 1.146 | 1.325 |
| 5.522919885010652 | 0.976 | 0.873 | 0.757 | 1.025 | 1.145 | 1.322 |
| 5.526061477664242 | 0.976 | 0.874 | 0.759 | 1.024 | 1.144 | 1.318 |
| 5.529203070317831 | 0.976 | 0.875 | 0.76 | 1.024 | 1.143 | 1.315 |
| 5.532344662971421 | 0.976 | 0.876 | 0.762 | 1.024 | 1.142 | 1.312 |
| 5.535486255625011 | 0.977 | 0.877 | 0.764 | 1.024 | 1.14 | 1.309 |
| 5.5386278482786 | 0.977 | 0.878 | 0.766 | 1.024 | 1.139 | 1.306 |
| 5.54176944093219 | 0.977 | 0.879 | 0.768 | 1.024 | 1.138 | 1.302 |
| 5.544911033585779 | 0.977 | 0.88 | 0.77 | 1.023 | 1.137 | 1.299 |
| 5.54805262623937 | 0.977 | 0.88 | 0.771 | 1.023 | 1.136 | 1.296 |
| 5.551194218892959 | 0.977 | 0.881 | 0.773 | 1.023 | 1.135 | 1.293 |
| 5.554335811546548 | 0.978 | 0.882 | 0.775 | 1.023 | 1.134 | 1.29 |
| 5.557477404200137 | 0.978 | 0.883 | 0.777 | 1.023 | 1.132 | 1.287 |
| 5.560618996853727 | 0.978 | 0.884 | 0.779 | 1.023 | 1.131 | 1.284 |
| 5.563760589507317 | 0.978 | 0.885 | 0.781 | 1.022 | 1.13 | 1.281 |
| 5.566902182160906 | 0.978 | 0.886 | 0.782 | 1.022 | 1.129 | 1.278 |
| 5.570043774814496 | 0.978 | 0.887 | 0.784 | 1.022 | 1.128 | 1.275 |
| 5.573185367468086 | 0.979 | 0.887 | 0.786 | 1.022 | 1.127 | 1.272 |
| 5.576326960121675 | 0.979 | 0.888 | 0.788 | 1.022 | 1.126 | 1.27 |
| 5.579468552775264 | 0.979 | 0.889 | 0.789 | 1.022 | 1.125 | 1.267 |
| 5.582610145428854 | 0.979 | 0.89 | 0.791 | 1.021 | 1.124 | 1.264 |
| 5.585751738082444 | 0.979 | 0.891 | 0.793 | 1.021 | 1.122 | 1.261 |
| 5.588893330736034 | 0.979 | 0.892 | 0.795 | 1.021 | 1.121 | 1.258 |
| 5.592034923389623 | 0.979 | 0.893 | 0.796 | 1.021 | 1.12 | 1.256 |
| 5.595176516043213 | 0.98 | 0.894 | 0.798 | 1.021 | 1.119 | 1.253 |
| 5.598318108696803 | 0.98 | 0.894 | 0.8 | 1.021 | 1.118 | 1.25 |
| 5.601459701350392 | 0.98 | 0.895 | 0.802 | 1.02 | 1.117 | 1.247 |
| 5.604601294003982 | 0.98 | 0.896 | 0.803 | 1.02 | 1.116 | 1.245 |
| 5.607742886657571 | 0.98 | 0.897 | 0.805 | 1.02 | 1.115 | 1.242 |
| 5.610884479311161 | 0.98 | 0.898 | 0.807 | 1.02 | 1.114 | 1.239 |
| 5.61402607196475 | 0.981 | 0.899 | 0.809 | 1.02 | 1.113 | 1.237 |
| 5.61716766461834 | 0.981 | 0.9 | 0.81 | 1.02 | 1.112 | 1.234 |
| 5.62030925727193 | 0.981 | 0.9 | 0.812 | 1.019 | 1.111 | 1.232 |
| 5.623450849925519 | 0.981 | 0.901 | 0.814 | 1.019 | 1.11 | 1.229 |
| 5.626592442579109 | 0.981 | 0.902 | 0.815 | 1.019 | 1.109 | 1.227 |
| 5.629734035232698 | 0.981 | 0.903 | 0.817 | 1.019 | 1.108 | 1.224 |
| 5.632875627886288 | 0.982 | 0.904 | 0.819 | 1.019 | 1.107 | 1.222 |
| 5.636017220539878 | 0.982 | 0.905 | 0.82 | 1.019 | 1.106 | 1.219 |
| 5.639158813193467 | 0.982 | 0.905 | 0.822 | 1.019 | 1.104 | 1.217 |
| 5.642300405847057 | 0.982 | 0.906 | 0.824 | 1.018 | 1.103 | 1.214 |
| 5.645441998500646 | 0.982 | 0.907 | 0.825 | 1.018 | 1.102 | 1.212 |
| 5.648583591154236 | 0.982 | 0.908 | 0.827 | 1.018 | 1.101 | 1.209 |
| 5.651725183807825 | 0.982 | 0.909 | 0.828 | 1.018 | 1.1 | 1.207 |
| 5.654866776461415 | 0.983 | 0.91 | 0.83 | 1.018 | 1.099 | 1.205 |
| 5.658008369115005 | 0.983 | 0.91 | 0.832 | 1.018 | 1.098 | 1.202 |
| 5.661149961768594 | 0.983 | 0.911 | 0.833 | 1.017 | 1.097 | 1.2 |
| 5.664291554422184 | 0.983 | 0.912 | 0.835 | 1.017 | 1.097 | 1.198 |
| 5.667433147075774 | 0.983 | 0.913 | 0.837 | 1.017 | 1.096 | 1.195 |
| 5.670574739729363 | 0.983 | 0.914 | 0.838 | 1.017 | 1.095 | 1.193 |
| 5.673716332382953 | 0.983 | 0.914 | 0.84 | 1.017 | 1.094 | 1.191 |
| 5.676857925036542 | 0.984 | 0.915 | 0.841 | 1.017 | 1.093 | 1.189 |
| 5.679999517690132 | 0.984 | 0.916 | 0.843 | 1.016 | 1.092 | 1.186 |
| 5.683141110343721 | 0.984 | 0.917 | 0.844 | 1.016 | 1.091 | 1.184 |
| 5.686282702997311 | 0.984 | 0.918 | 0.846 | 1.016 | 1.09 | 1.182 |
| 5.689424295650901 | 0.984 | 0.918 | 0.848 | 1.016 | 1.089 | 1.18 |
| 5.69256588830449 | 0.984 | 0.919 | 0.849 | 1.016 | 1.088 | 1.178 |
| 5.69570748095808 | 0.985 | 0.92 | 0.851 | 1.016 | 1.087 | 1.176 |
| 5.69884907361167 | 0.985 | 0.921 | 0.852 | 1.016 | 1.086 | 1.174 |
| 5.701990666265259 | 0.985 | 0.922 | 0.854 | 1.015 | 1.085 | 1.171 |
| 5.705132258918849 | 0.985 | 0.922 | 0.855 | 1.015 | 1.084 | 1.169 |
| 5.708273851572438 | 0.985 | 0.923 | 0.857 | 1.015 | 1.083 | 1.167 |
| 5.711415444226028 | 0.985 | 0.924 | 0.858 | 1.015 | 1.082 | 1.165 |
| 5.714557036879618 | 0.985 | 0.925 | 0.86 | 1.015 | 1.081 | 1.163 |
| 5.717698629533207 | 0.986 | 0.925 | 0.861 | 1.015 | 1.081 | 1.161 |
| 5.720840222186797 | 0.986 | 0.926 | 0.863 | 1.015 | 1.08 | 1.159 |
| 5.723981814840386 | 0.986 | 0.927 | 0.864 | 1.014 | 1.079 | 1.157 |
| 5.727123407493976 | 0.986 | 0.928 | 0.866 | 1.014 | 1.078 | 1.155 |
| 5.730265000147565 | 0.986 | 0.928 | 0.867 | 1.014 | 1.077 | 1.153 |
| 5.733406592801155 | 0.986 | 0.929 | 0.869 | 1.014 | 1.076 | 1.151 |
| 5.736548185454744 | 0.986 | 0.93 | 0.87 | 1.014 | 1.075 | 1.149 |
| 5.739689778108334 | 0.987 | 0.931 | 0.871 | 1.014 | 1.074 | 1.148 |
| 5.742831370761924 | 0.987 | 0.931 | 0.873 | 1.014 | 1.074 | 1.146 |
| 5.745972963415514 | 0.987 | 0.932 | 0.874 | 1.013 | 1.073 | 1.144 |
| 5.749114556069103 | 0.987 | 0.933 | 0.876 | 1.013 | 1.072 | 1.142 |
| 5.752256148722693 | 0.987 | 0.934 | 0.877 | 1.013 | 1.071 | 1.14 |
| 5.755397741376282 | 0.987 | 0.934 | 0.878 | 1.013 | 1.07 | 1.138 |
| 5.758539334029872 | 0.987 | 0.935 | 0.88 | 1.013 | 1.069 | 1.137 |
| 5.761680926683462 | 0.988 | 0.936 | 0.881 | 1.013 | 1.068 | 1.135 |
| 5.764822519337051 | 0.988 | 0.937 | 0.883 | 1.013 | 1.068 | 1.133 |
| 5.767964111990641 | 0.988 | 0.937 | 0.884 | 1.012 | 1.067 | 1.131 |
| 5.77110570464423 | 0.988 | 0.938 | 0.885 | 1.012 | 1.066 | 1.129 |
| 5.77424729729782 | 0.988 | 0.939 | 0.887 | 1.012 | 1.065 | 1.128 |
| 5.77738888995141 | 0.988 | 0.939 | 0.888 | 1.012 | 1.064 | 1.126 |
| 5.780530482605 | 0.988 | 0.94 | 0.889 | 1.012 | 1.064 | 1.124 |
| 5.783672075258588 | 0.988 | 0.941 | 0.891 | 1.012 | 1.063 | 1.123 |
| 5.786813667912178 | 0.989 | 0.942 | 0.892 | 1.012 | 1.062 | 1.121 |
| 5.789955260565768 | 0.989 | 0.942 | 0.893 | 1.011 | 1.061 | 1.119 |
| 5.793096853219358 | 0.989 | 0.943 | 0.895 | 1.011 | 1.06 | 1.118 |
| 5.796238445872947 | 0.989 | 0.944 | 0.896 | 1.011 | 1.06 | 1.116 |
| 5.799380038526537 | 0.989 | 0.944 | 0.897 | 1.011 | 1.059 | 1.114 |
| 5.802521631180126 | 0.989 | 0.945 | 0.899 | 1.011 | 1.058 | 1.113 |
| 5.805663223833715 | 0.989 | 0.946 | 0.9 | 1.011 | 1.057 | 1.111 |
| 5.808804816487306 | 0.99 | 0.946 | 0.901 | 1.011 | 1.057 | 1.11 |
| 5.811946409140895 | 0.99 | 0.947 | 0.902 | 1.01 | 1.056 | 1.108 |
| 5.815088001794485 | 0.99 | 0.948 | 0.904 | 1.01 | 1.055 | 1.106 |
| 5.818229594448074 | 0.99 | 0.948 | 0.905 | 1.01 | 1.054 | 1.105 |
| 5.821371187101663 | 0.99 | 0.949 | 0.906 | 1.01 | 1.054 | 1.103 |
| 5.824512779755254 | 0.99 | 0.95 | 0.908 | 1.01 | 1.053 | 1.102 |
| 5.827654372408843 | 0.99 | 0.95 | 0.909 | 1.01 | 1.052 | 1.1 |
| 5.830795965062433 | 0.99 | 0.951 | 0.91 | 1.01 | 1.051 | 1.099 |
| 5.833937557716022 | 0.991 | 0.952 | 0.911 | 1.01 | 1.051 | 1.097 |
| 5.837079150369612 | 0.991 | 0.952 | 0.912 | 1.009 | 1.05 | 1.096 |
| 5.840220743023201 | 0.991 | 0.953 | 0.914 | 1.009 | 1.049 | 1.095 |
| 5.843362335676791 | 0.991 | 0.954 | 0.915 | 1.009 | 1.049 | 1.093 |
| 5.846503928330381 | 0.991 | 0.954 | 0.916 | 1.009 | 1.048 | 1.092 |
| 5.84964552098397 | 0.991 | 0.955 | 0.917 | 1.009 | 1.047 | 1.09 |
| 5.85278711363756 | 0.991 | 0.955 | 0.918 | 1.009 | 1.047 | 1.089 |
| 5.85592870629115 | 0.991 | 0.956 | 0.919 | 1.009 | 1.046 | 1.088 |
| 5.85907029894474 | 0.991 | 0.957 | 0.921 | 1.009 | 1.045 | 1.086 |
| 5.862211891598329 | 0.992 | 0.957 | 0.922 | 1.008 | 1.045 | 1.085 |
| 5.865353484251918 | 0.992 | 0.958 | 0.923 | 1.008 | 1.044 | 1.084 |
| 5.868495076905508 | 0.992 | 0.959 | 0.924 | 1.008 | 1.043 | 1.082 |
| 5.871636669559098 | 0.992 | 0.959 | 0.925 | 1.008 | 1.043 | 1.081 |
| 5.874778262212687 | 0.992 | 0.96 | 0.926 | 1.008 | 1.042 | 1.08 |
| 5.877919854866277 | 0.992 | 0.96 | 0.927 | 1.008 | 1.041 | 1.078 |
| 5.881061447519866 | 0.992 | 0.961 | 0.929 | 1.008 | 1.041 | 1.077 |
| 5.884203040173456 | 0.992 | 0.962 | 0.93 | 1.008 | 1.04 | 1.076 |
| 5.887344632827046 | 0.993 | 0.962 | 0.931 | 1.008 | 1.039 | 1.074 |
| 5.890486225480635 | 0.993 | 0.963 | 0.932 | 1.007 | 1.039 | 1.073 |
| 5.893627818134224 | 0.993 | 0.963 | 0.933 | 1.007 | 1.038 | 1.072 |
| 5.896769410787814 | 0.993 | 0.964 | 0.934 | 1.007 | 1.038 | 1.071 |
| 5.899911003441404 | 0.993 | 0.964 | 0.935 | 1.007 | 1.037 | 1.07 |
| 5.903052596094994 | 0.993 | 0.965 | 0.936 | 1.007 | 1.036 | 1.068 |
| 5.906194188748583 | 0.993 | 0.966 | 0.937 | 1.007 | 1.036 | 1.067 |
| 5.909335781402172 | 0.993 | 0.966 | 0.938 | 1.007 | 1.035 | 1.066 |
| 5.912477374055762 | 0.993 | 0.967 | 0.939 | 1.007 | 1.035 | 1.065 |
| 5.915618966709352 | 0.994 | 0.967 | 0.94 | 1.007 | 1.034 | 1.064 |
| 5.918760559362942 | 0.994 | 0.968 | 0.941 | 1.006 | 1.033 | 1.063 |
| 5.921902152016531 | 0.994 | 0.968 | 0.942 | 1.006 | 1.033 | 1.061 |
| 5.92504374467012 | 0.994 | 0.969 | 0.943 | 1.006 | 1.032 | 1.06 |
| 5.92818533732371 | 0.994 | 0.969 | 0.944 | 1.006 | 1.032 | 1.059 |
| 5.9313269299773 | 0.994 | 0.97 | 0.945 | 1.006 | 1.031 | 1.058 |
| 5.93446852263089 | 0.994 | 0.97 | 0.946 | 1.006 | 1.031 | 1.057 |
| 5.93761011528448 | 0.994 | 0.971 | 0.947 | 1.006 | 1.03 | 1.056 |
| 5.940751707938068 | 0.994 | 0.971 | 0.948 | 1.006 | 1.029 | 1.055 |
| 5.943893300591658 | 0.994 | 0.972 | 0.949 | 1.006 | 1.029 | 1.054 |
| 5.947034893245248 | 0.995 | 0.972 | 0.95 | 1.005 | 1.028 | 1.053 |
| 5.950176485898837 | 0.995 | 0.973 | 0.951 | 1.005 | 1.028 | 1.052 |
| 5.953318078552427 | 0.995 | 0.973 | 0.952 | 1.005 | 1.027 | 1.051 |
| 5.956459671206017 | 0.995 | 0.974 | 0.953 | 1.005 | 1.027 | 1.05 |
| 5.959601263859606 | 0.995 | 0.974 | 0.953 | 1.005 | 1.026 | 1.049 |
| 5.962742856513196 | 0.995 | 0.975 | 0.954 | 1.005 | 1.026 | 1.048 |
| 5.965884449166785 | 0.995 | 0.975 | 0.955 | 1.005 | 1.025 | 1.047 |
| 5.969026041820375 | 0.995 | 0.976 | 0.956 | 1.005 | 1.025 | 1.046 |
| 5.972167634473964 | 0.995 | 0.976 | 0.957 | 1.005 | 1.024 | 1.045 |
| 5.975309227127554 | 0.995 | 0.977 | 0.958 | 1.005 | 1.024 | 1.044 |
| 5.978450819781144 | 0.995 | 0.977 | 0.959 | 1.005 | 1.023 | 1.043 |
| 5.981592412434733 | 0.996 | 0.978 | 0.959 | 1.004 | 1.023 | 1.042 |
| 5.984734005088323 | 0.996 | 0.978 | 0.96 | 1.004 | 1.022 | 1.041 |
| 5.987875597741913 | 0.996 | 0.979 | 0.961 | 1.004 | 1.022 | 1.04 |
| 5.991017190395502 | 0.996 | 0.979 | 0.962 | 1.004 | 1.021 | 1.04 |
| 5.994158783049092 | 0.996 | 0.979 | 0.963 | 1.004 | 1.021 | 1.039 |
| 5.997300375702681 | 0.996 | 0.98 | 0.964 | 1.004 | 1.02 | 1.038 |
| 6.000441968356271 | 0.996 | 0.98 | 0.964 | 1.004 | 1.02 | 1.037 |
| 6.003583561009861 | 0.996 | 0.981 | 0.965 | 1.004 | 1.02 | 1.036 |
| 6.00672515366345 | 0.996 | 0.981 | 0.966 | 1.004 | 1.019 | 1.035 |
| 6.00986674631704 | 0.996 | 0.982 | 0.967 | 1.004 | 1.019 | 1.034 |
| 6.01300833897063 | 0.996 | 0.982 | 0.967 | 1.004 | 1.018 | 1.034 |
| 6.01614993162422 | 0.997 | 0.982 | 0.968 | 1.003 | 1.018 | 1.033 |
| 6.019291524277808 | 0.997 | 0.983 | 0.969 | 1.003 | 1.017 | 1.032 |
| 6.022433116931398 | 0.997 | 0.983 | 0.97 | 1.003 | 1.017 | 1.031 |
| 6.025574709584988 | 0.997 | 0.984 | 0.97 | 1.003 | 1.017 | 1.031 |
| 6.028716302238577 | 0.997 | 0.984 | 0.971 | 1.003 | 1.016 | 1.03 |
| 6.031857894892167 | 0.997 | 0.984 | 0.972 | 1.003 | 1.016 | 1.029 |
| 6.034999487545757 | 0.997 | 0.985 | 0.972 | 1.003 | 1.015 | 1.028 |
| 6.038141080199346 | 0.997 | 0.985 | 0.973 | 1.003 | 1.015 | 1.028 |
| 6.041282672852935 | 0.997 | 0.986 | 0.974 | 1.003 | 1.015 | 1.027 |
| 6.044424265506525 | 0.997 | 0.986 | 0.975 | 1.003 | 1.014 | 1.026 |
| 6.047565858160115 | 0.997 | 0.986 | 0.975 | 1.003 | 1.014 | 1.025 |
| 6.050707450813704 | 0.997 | 0.987 | 0.976 | 1.003 | 1.014 | 1.025 |
| 6.053849043467294 | 0.997 | 0.987 | 0.976 | 1.003 | 1.013 | 1.024 |
| 6.056990636120884 | 0.997 | 0.987 | 0.977 | 1.003 | 1.013 | 1.023 |
| 6.060132228774473 | 0.998 | 0.988 | 0.978 | 1.002 | 1.012 | 1.023 |
| 6.063273821428063 | 0.998 | 0.988 | 0.978 | 1.002 | 1.012 | 1.022 |
| 6.066415414081653 | 0.998 | 0.988 | 0.979 | 1.002 | 1.012 | 1.021 |
| 6.069557006735242 | 0.998 | 0.989 | 0.98 | 1.002 | 1.011 | 1.021 |
| 6.072698599388831 | 0.998 | 0.989 | 0.98 | 1.002 | 1.011 | 1.02 |
| 6.07584019204242 | 0.998 | 0.989 | 0.981 | 1.002 | 1.011 | 1.02 |
| 6.078981784696011 | 0.998 | 0.99 | 0.981 | 1.002 | 1.01 | 1.019 |
| 6.082123377349601 | 0.998 | 0.99 | 0.982 | 1.002 | 1.01 | 1.018 |
| 6.08526497000319 | 0.998 | 0.99 | 0.982 | 1.002 | 1.01 | 1.018 |
| 6.08840656265678 | 0.998 | 0.991 | 0.983 | 1.002 | 1.009 | 1.017 |
| 6.09154815531037 | 0.998 | 0.991 | 0.984 | 1.002 | 1.009 | 1.017 |
| 6.094689747963959 | 0.998 | 0.991 | 0.984 | 1.002 | 1.009 | 1.016 |
| 6.097831340617549 | 0.998 | 0.991 | 0.985 | 1.002 | 1.009 | 1.016 |
| 6.100972933271138 | 0.998 | 0.992 | 0.985 | 1.002 | 1.008 | 1.015 |
| 6.104114525924728 | 0.998 | 0.992 | 0.986 | 1.002 | 1.008 | 1.015 |
| 6.107256118578317 | 0.998 | 0.992 | 0.986 | 1.002 | 1.008 | 1.014 |
| 6.110397711231907 | 0.999 | 0.993 | 0.987 | 1.001 | 1.007 | 1.014 |
| 6.113539303885497 | 0.999 | 0.993 | 0.987 | 1.001 | 1.007 | 1.013 |
| 6.116680896539086 | 0.999 | 0.993 | 0.988 | 1.001 | 1.007 | 1.013 |
| 6.119822489192675 | 0.999 | 0.993 | 0.988 | 1.001 | 1.007 | 1.012 |
| 6.122964081846265 | 0.999 | 0.994 | 0.988 | 1.001 | 1.006 | 1.012 |
| 6.126105674499855 | 0.999 | 0.994 | 0.989 | 1.001 | 1.006 | 1.011 |
| 6.129247267153445 | 0.999 | 0.994 | 0.989 | 1.001 | 1.006 | 1.011 |
| 6.132388859807034 | 0.999 | 0.994 | 0.99 | 1.001 | 1.006 | 1.01 |
| 6.135530452460624 | 0.999 | 0.995 | 0.99 | 1.001 | 1.005 | 1.01 |
| 6.138672045114213 | 0.999 | 0.995 | 0.991 | 1.001 | 1.005 | 1.009 |
| 6.141813637767803 | 0.999 | 0.995 | 0.991 | 1.001 | 1.005 | 1.009 |
| 6.144955230421393 | 0.999 | 0.995 | 0.991 | 1.001 | 1.005 | 1.009 |
| 6.148096823074982 | 0.999 | 0.995 | 0.992 | 1.001 | 1.005 | 1.008 |
| 6.151238415728571 | 0.999 | 0.996 | 0.992 | 1.001 | 1.004 | 1.008 |
| 6.154380008382161 | 0.999 | 0.996 | 0.993 | 1.001 | 1.004 | 1.008 |
| 6.157521601035751 | 0.999 | 0.996 | 0.993 | 1.001 | 1.004 | 1.007 |
| 6.16066319368934 | 0.999 | 0.996 | 0.993 | 1.001 | 1.004 | 1.007 |
| 6.16380478634293 | 0.999 | 0.996 | 0.994 | 1.001 | 1.004 | 1.006 |
| 6.16694637899652 | 0.999 | 0.997 | 0.994 | 1.001 | 1.003 | 1.006 |
| 6.170087971650109 | 0.999 | 0.997 | 0.994 | 1.001 | 1.003 | 1.006 |
| 6.173229564303698 | 0.999 | 0.997 | 0.995 | 1.001 | 1.003 | 1.005 |
| 6.176371156957289 | 0.999 | 0.997 | 0.995 | 1.001 | 1.003 | 1.005 |
| 6.179512749610878 | 0.999 | 0.997 | 0.995 | 1.001 | 1.003 | 1.005 |
| 6.182654342264468 | 0.999 | 0.997 | 0.995 | 1.001 | 1.003 | 1.005 |
| 6.185795934918057 | 1 | 0.998 | 0.996 | 1 | 1.002 | 1.004 |
| 6.188937527571647 | 1 | 0.998 | 0.996 | 1 | 1.002 | 1.004 |
| 6.192079120225237 | 1 | 0.998 | 0.996 | 1 | 1.002 | 1.004 |
| 6.195220712878826 | 1 | 0.998 | 0.997 | 1 | 1.002 | 1.003 |
| 6.198362305532415 | 1 | 0.998 | 0.997 | 1 | 1.002 | 1.003 |
| 6.201503898186005 | 1 | 0.998 | 0.997 | 1 | 1.002 | 1.003 |
| 6.204645490839594 | 1 | 0.998 | 0.997 | 1 | 1.002 | 1.003 |
| 6.207787083493184 | 1 | 0.999 | 0.997 | 1 | 1.001 | 1.003 |
| 6.210928676146774 | 1 | 0.999 | 0.998 | 1 | 1.001 | 1.002 |
| 6.214070268800364 | 1 | 0.999 | 0.998 | 1 | 1.001 | 1.002 |
| 6.217211861453953 | 1 | 0.999 | 0.998 | 1 | 1.001 | 1.002 |
| 6.220353454107543 | 1 | 0.999 | 0.998 | 1 | 1.001 | 1.002 |
| 6.223495046761133 | 1 | 0.999 | 0.998 | 1 | 1.001 | 1.002 |
| 6.226636639414722 | 1 | 0.999 | 0.999 | 1 | 1.001 | 1.001 |
| 6.229778232068312 | 1 | 0.999 | 0.999 | 1 | 1.001 | 1.001 |
| 6.232919824721901 | 1 | 0.999 | 0.999 | 1 | 1.001 | 1.001 |
| 6.236061417375491 | 1 | 0.999 | 0.999 | 1 | 1.001 | 1.001 |
| 6.23920301002908 | 1 | 1 | 0.999 | 1 | 1 | 1.001 |
| 6.24234460268267 | 1 | 1 | 0.999 | 1 | 1 | 1.001 |
| 6.24548619533626 | 1 | 1 | 0.999 | 1 | 1 | 1.001 |
| 6.24862778798985 | 1 | 1 | 0.999 | 1 | 1 | 1.001 |
| 6.251769380643438 | 1 | 1 | 1 | 1 | 1 | 1 |
| 6.254910973297028 | 1 | 1 | 1 | 1 | 1 | 1 |
| 6.258052565950618 | 1 | 1 | 1 | 1 | 1 | 1 |
| 6.261194158604208 | 1 | 1 | 1 | 1 | 1 | 1 |
| 6.264335751257797 | 1 | 1 | 1 | 1 | 1 | 1 |
| 6.267477343911387 | 1 | 1 | 1 | 1 | 1 | 1 |
| 6.270618936564976 | 1 | 1 | 1 | 1 | 1 | 1 |
| 6.273760529218566 | 1 | 1 | 1 | 1 | 1 | 1 |
| 6.276902121872155 | 1 | 1 | 1 | 1 | 1 | 1 |
| 6.280043714525745 | 1 | 1 | 1 | 1 | 1 | 1 |
| 6.283185307179335 | 1 | 1 | 1 | 1 | 1 | 1 |